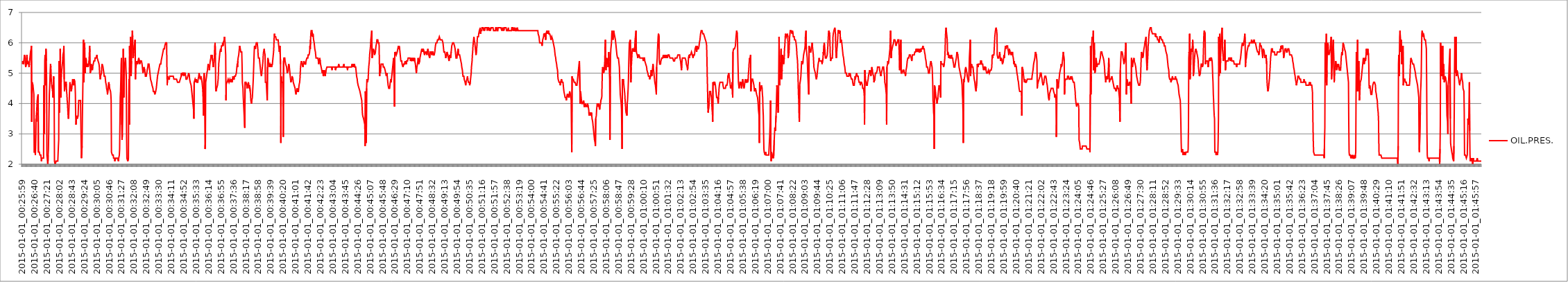
| Category | OIL.PRES. |
|---|---|
| 2015-01-01_00:25:59 | 5.3 |
| 2015-01-01_00:26:00 | 5.4 |
| 2015-01-01_00:26:01 | 5.4 |
| 2015-01-01_00:26:02 | 5.4 |
| 2015-01-01_00:26:03 | 5.3 |
| 2015-01-01_00:26:03 | 5.4 |
| 2015-01-01_00:26:05 | 5.5 |
| 2015-01-01_00:26:06 | 5.6 |
| 2015-01-01_00:26:07 | 5.6 |
| 2015-01-01_00:26:08 | 5.5 |
| 2015-01-01_00:26:09 | 5.3 |
| 2015-01-01_00:26:10 | 5.2 |
| 2015-01-01_00:26:11 | 5.2 |
| 2015-01-01_00:26:12 | 5.3 |
| 2015-01-01_00:26:13 | 5.5 |
| 2015-01-01_00:26:14 | 5.6 |
| 2015-01-01_00:26:15 | 5.5 |
| 2015-01-01_00:26:16 | 5.3 |
| 2015-01-01_00:26:17 | 5.4 |
| 2015-01-01_00:26:18 | 5.4 |
| 2015-01-01_00:26:19 | 5.4 |
| 2015-01-01_00:26:20 | 5.3 |
| 2015-01-01_00:26:21 | 5.2 |
| 2015-01-01_00:26:22 | 5.3 |
| 2015-01-01_00:26:23 | 5.4 |
| 2015-01-01_00:26:24 | 5.5 |
| 2015-01-01_00:26:25 | 5.6 |
| 2015-01-01_00:26:26 | 5.7 |
| 2015-01-01_00:26:27 | 5.7 |
| 2015-01-01_00:26:28 | 5.8 |
| 2015-01-01_00:26:29 | 5.9 |
| 2015-01-01_00:26:30 | 3.4 |
| 2015-01-01_00:26:31 | 4.7 |
| 2015-01-01_00:26:32 | 4.7 |
| 2015-01-01_00:26:33 | 4.7 |
| 2015-01-01_00:26:34 | 4.6 |
| 2015-01-01_00:26:35 | 4.5 |
| 2015-01-01_00:26:36 | 4.4 |
| 2015-01-01_00:26:37 | 4.3 |
| 2015-01-01_00:26:38 | 2.4 |
| 2015-01-01_00:26:39 | 2.4 |
| 2015-01-01_00:26:40 | 2.4 |
| 2015-01-01_00:26:41 | 2.4 |
| 2015-01-01_00:26:42 | 2.3 |
| 2015-01-01_00:26:43 | 2.3 |
| 2015-01-01_00:26:44 | 3.5 |
| 2015-01-01_00:26:45 | 3.4 |
| 2015-01-01_00:26:46 | 3.7 |
| 2015-01-01_00:26:47 | 3.9 |
| 2015-01-01_00:26:48 | 4.1 |
| 2015-01-01_00:26:49 | 4.2 |
| 2015-01-01_00:26:50 | 4.2 |
| 2015-01-01_00:26:51 | 4.3 |
| 2015-01-01_00:26:52 | 2.4 |
| 2015-01-01_00:26:53 | 2.4 |
| 2015-01-01_00:26:54 | 2.4 |
| 2015-01-01_00:26:55 | 2.4 |
| 2015-01-01_00:26:56 | 2.4 |
| 2015-01-01_00:26:57 | 2.3 |
| 2015-01-01_00:26:58 | 2.3 |
| 2015-01-01_00:26:59 | 2.3 |
| 2015-01-01_00:27:00 | 2.3 |
| 2015-01-01_00:27:01 | 2.2 |
| 2015-01-01_00:27:02 | 2.1 |
| 2015-01-01_00:27:03 | 2.2 |
| 2015-01-01_00:27:04 | 2.2 |
| 2015-01-01_00:27:05 | 2.2 |
| 2015-01-01_00:27:06 | 2.2 |
| 2015-01-01_00:27:07 | 2.2 |
| 2015-01-01_00:27:08 | 2.2 |
| 2015-01-01_00:27:09 | 2.2 |
| 2015-01-01_00:27:10 | 4.6 |
| 2015-01-01_00:27:11 | 3 |
| 2015-01-01_00:27:12 | 3.8 |
| 2015-01-01_00:27:13 | 5.4 |
| 2015-01-01_00:27:14 | 5.6 |
| 2015-01-01_00:27:15 | 4.6 |
| 2015-01-01_00:27:16 | 5.5 |
| 2015-01-01_00:27:17 | 5.8 |
| 2015-01-01_00:27:18 | 5.4 |
| 2015-01-01_00:27:19 | 4.8 |
| 2015-01-01_00:27:20 | 2.3 |
| 2015-01-01_00:27:21 | 2.2 |
| 2015-01-01_00:27:22 | 2.1 |
| 2015-01-01_00:27:23 | 1.9 |
| 2015-01-01_00:27:24 | 2.3 |
| 2015-01-01_00:27:25 | 2.5 |
| 2015-01-01_00:27:26 | 3 |
| 2015-01-01_00:27:27 | 3.7 |
| 2015-01-01_00:27:28 | 4.3 |
| 2015-01-01_00:27:29 | 4.5 |
| 2015-01-01_00:27:30 | 4.8 |
| 2015-01-01_00:27:31 | 5.1 |
| 2015-01-01_00:27:32 | 5.3 |
| 2015-01-01_00:27:33 | 5.2 |
| 2015-01-01_00:27:34 | 4.9 |
| 2015-01-01_00:27:35 | 4.7 |
| 2015-01-01_00:27:36 | 4.6 |
| 2015-01-01_00:27:37 | 4.5 |
| 2015-01-01_00:27:38 | 4.6 |
| 2015-01-01_00:27:39 | 4.4 |
| 2015-01-01_00:27:40 | 4.2 |
| 2015-01-01_00:27:41 | 4.5 |
| 2015-01-01_00:27:42 | 4.9 |
| 2015-01-01_00:27:43 | 4.8 |
| 2015-01-01_00:27:44 | 4.1 |
| 2015-01-01_00:27:45 | 2.1 |
| 2015-01-01_00:27:46 | 2.1 |
| 2015-01-01_00:27:47 | 2 |
| 2015-01-01_00:27:48 | 2 |
| 2015-01-01_00:27:49 | 2 |
| 2015-01-01_00:27:50 | 2.1 |
| 2015-01-01_00:27:51 | 2.1 |
| 2015-01-01_00:27:52 | 2.1 |
| 2015-01-01_00:27:53 | 2.1 |
| 2015-01-01_00:27:54 | 2.1 |
| 2015-01-01_00:27:55 | 2.1 |
| 2015-01-01_00:27:56 | 2.1 |
| 2015-01-01_00:27:57 | 2.1 |
| 2015-01-01_00:27:58 | 2.6 |
| 2015-01-01_00:27:59 | 2.8 |
| 2015-01-01_00:28:00 | 5.4 |
| 2015-01-01_00:28:01 | 3.7 |
| 2015-01-01_00:28:02 | 4.4 |
| 2015-01-01_00:28:03 | 4.9 |
| 2015-01-01_00:28:04 | 5.8 |
| 2015-01-01_00:28:05 | 4.8 |
| 2015-01-01_00:28:06 | 4.2 |
| 2015-01-01_00:28:07 | 4.7 |
| 2015-01-01_00:28:08 | 5 |
| 2015-01-01_00:28:09 | 5.1 |
| 2015-01-01_00:28:10 | 5.2 |
| 2015-01-01_00:28:11 | 5.3 |
| 2015-01-01_00:28:12 | 5.4 |
| 2015-01-01_00:28:13 | 5.6 |
| 2015-01-01_00:28:14 | 5.6 |
| 2015-01-01_00:28:15 | 5.7 |
| 2015-01-01_00:28:16 | 5.9 |
| 2015-01-01_00:28:17 | 4.8 |
| 2015-01-01_00:28:18 | 4.4 |
| 2015-01-01_00:28:19 | 4.5 |
| 2015-01-01_00:28:20 | 4.6 |
| 2015-01-01_00:28:21 | 4.7 |
| 2015-01-01_00:28:22 | 4.7 |
| 2015-01-01_00:28:23 | 4.7 |
| 2015-01-01_00:28:24 | 4.7 |
| 2015-01-01_00:28:25 | 4.4 |
| 2015-01-01_00:28:26 | 4.3 |
| 2015-01-01_00:28:27 | 4.1 |
| 2015-01-01_00:28:28 | 4 |
| 2015-01-01_00:28:29 | 3.8 |
| 2015-01-01_00:28:30 | 3.6 |
| 2015-01-01_00:28:31 | 3.5 |
| 2015-01-01_00:28:32 | 3.6 |
| 2015-01-01_00:28:33 | 3.9 |
| 2015-01-01_00:28:34 | 4.2 |
| 2015-01-01_00:28:35 | 4.5 |
| 2015-01-01_00:28:36 | 4.7 |
| 2015-01-01_00:28:37 | 4.7 |
| 2015-01-01_00:28:38 | 4.7 |
| 2015-01-01_00:28:39 | 4.5 |
| 2015-01-01_00:28:40 | 4.4 |
| 2015-01-01_00:28:41 | 4.4 |
| 2015-01-01_00:28:42 | 4.5 |
| 2015-01-01_00:28:43 | 4.6 |
| 2015-01-01_00:28:44 | 4.7 |
| 2015-01-01_00:28:45 | 4.8 |
| 2015-01-01_00:28:46 | 4.8 |
| 2015-01-01_00:28:47 | 4.7 |
| 2015-01-01_00:28:48 | 4.6 |
| 2015-01-01_00:28:49 | 4.7 |
| 2015-01-01_00:28:50 | 4.8 |
| 2015-01-01_00:28:51 | 4.8 |
| 2015-01-01_00:28:52 | 4.7 |
| 2015-01-01_00:28:53 | 4.6 |
| 2015-01-01_00:28:54 | 4.3 |
| 2015-01-01_00:28:55 | 3.6 |
| 2015-01-01_00:28:56 | 3.3 |
| 2015-01-01_00:28:57 | 3.3 |
| 2015-01-01_00:28:58 | 3.6 |
| 2015-01-01_00:28:59 | 3.6 |
| 2015-01-01_00:29:00 | 3.5 |
| 2015-01-01_00:29:01 | 3.5 |
| 2015-01-01_00:29:02 | 3.5 |
| 2015-01-01_00:29:03 | 3.6 |
| 2015-01-01_00:29:04 | 3.9 |
| 2015-01-01_00:29:05 | 4.1 |
| 2015-01-01_00:29:06 | 4.1 |
| 2015-01-01_00:29:07 | 4.1 |
| 2015-01-01_00:29:08 | 4.1 |
| 2015-01-01_00:29:09 | 4.1 |
| 2015-01-01_00:29:10 | 4.1 |
| 2015-01-01_00:29:11 | 4.1 |
| 2015-01-01_00:29:12 | 4.1 |
| 2015-01-01_00:29:13 | 2.7 |
| 2015-01-01_00:29:14 | 2.2 |
| 2015-01-01_00:29:15 | 2.2 |
| 2015-01-01_00:29:16 | 2.6 |
| 2015-01-01_00:29:17 | 3.5 |
| 2015-01-01_00:29:18 | 4.1 |
| 2015-01-01_00:29:19 | 4.8 |
| 2015-01-01_00:29:20 | 6 |
| 2015-01-01_00:29:21 | 6.1 |
| 2015-01-01_00:29:22 | 4.7 |
| 2015-01-01_00:29:23 | 5.3 |
| 2015-01-01_00:29:24 | 6 |
| 2015-01-01_00:29:25 | 5.8 |
| 2015-01-01_00:29:26 | 5 |
| 2015-01-01_00:29:27 | 5.2 |
| 2015-01-01_00:29:28 | 5.4 |
| 2015-01-01_00:29:29 | 5.5 |
| 2015-01-01_00:29:30 | 5.4 |
| 2015-01-01_00:29:31 | 5.3 |
| 2015-01-01_00:29:32 | 5.2 |
| 2015-01-01_00:29:33 | 5.3 |
| 2015-01-01_00:29:34 | 5.3 |
| 2015-01-01_00:29:35 | 5.3 |
| 2015-01-01_00:29:36 | 5.2 |
| 2015-01-01_00:29:37 | 5.2 |
| 2015-01-01_00:29:38 | 5.2 |
| 2015-01-01_00:29:39 | 5.4 |
| 2015-01-01_00:29:40 | 5.6 |
| 2015-01-01_00:29:41 | 5.9 |
| 2015-01-01_00:29:42 | 5.7 |
| 2015-01-01_00:29:43 | 5 |
| 2015-01-01_00:29:44 | 5 |
| 2015-01-01_00:29:45 | 5.1 |
| 2015-01-01_00:29:46 | 5.3 |
| 2015-01-01_00:29:47 | 5.3 |
| 2015-01-01_00:29:48 | 5.2 |
| 2015-01-01_00:29:49 | 5.2 |
| 2015-01-01_00:29:50 | 5.1 |
| 2015-01-01_00:29:51 | 5.2 |
| 2015-01-01_00:29:52 | 5.2 |
| 2015-01-01_00:29:53 | 5.3 |
| 2015-01-01_00:29:54 | 5.3 |
| 2015-01-01_00:29:55 | 5.4 |
| 2015-01-01_00:29:56 | 5.4 |
| 2015-01-01_00:29:57 | 5.4 |
| 2015-01-01_00:29:58 | 5.4 |
| 2015-01-01_00:29:59 | 5.5 |
| 2015-01-01_00:30:00 | 5.5 |
| 2015-01-01_00:30:01 | 5.5 |
| 2015-01-01_00:30:02 | 5.5 |
| 2015-01-01_00:30:03 | 5.5 |
| 2015-01-01_00:30:04 | 5.5 |
| 2015-01-01_00:30:05 | 5.6 |
| 2015-01-01_00:30:06 | 5.5 |
| 2015-01-01_00:30:07 | 5.5 |
| 2015-01-01_00:30:08 | 5.5 |
| 2015-01-01_00:30:09 | 5.4 |
| 2015-01-01_00:30:10 | 5.4 |
| 2015-01-01_00:30:11 | 5.4 |
| 2015-01-01_00:30:12 | 5.3 |
| 2015-01-01_00:30:13 | 5.2 |
| 2015-01-01_00:30:14 | 5 |
| 2015-01-01_00:30:15 | 4.9 |
| 2015-01-01_00:30:16 | 4.8 |
| 2015-01-01_00:30:17 | 4.9 |
| 2015-01-01_00:30:18 | 4.9 |
| 2015-01-01_00:30:19 | 4.9 |
| 2015-01-01_00:30:20 | 5 |
| 2015-01-01_00:30:21 | 5.2 |
| 2015-01-01_00:30:22 | 5.3 |
| 2015-01-01_00:30:23 | 5.3 |
| 2015-01-01_00:30:24 | 5.3 |
| 2015-01-01_00:30:25 | 5.2 |
| 2015-01-01_00:30:26 | 5.2 |
| 2015-01-01_00:30:27 | 5.2 |
| 2015-01-01_00:30:28 | 5 |
| 2015-01-01_00:30:29 | 4.9 |
| 2015-01-01_00:30:30 | 4.9 |
| 2015-01-01_00:30:31 | 4.9 |
| 2015-01-01_00:30:32 | 4.9 |
| 2015-01-01_00:30:33 | 4.8 |
| 2015-01-01_00:30:34 | 4.7 |
| 2015-01-01_00:30:35 | 4.7 |
| 2015-01-01_00:30:36 | 4.6 |
| 2015-01-01_00:30:37 | 4.5 |
| 2015-01-01_00:30:38 | 4.5 |
| 2015-01-01_00:30:39 | 4.4 |
| 2015-01-01_00:30:40 | 4.3 |
| 2015-01-01_00:30:41 | 4.3 |
| 2015-01-01_00:30:42 | 4.5 |
| 2015-01-01_00:30:43 | 4.6 |
| 2015-01-01_00:30:44 | 4.7 |
| 2015-01-01_00:30:45 | 4.7 |
| 2015-01-01_00:30:46 | 4.6 |
| 2015-01-01_00:30:47 | 4.5 |
| 2015-01-01_00:30:48 | 4.5 |
| 2015-01-01_00:30:49 | 4.5 |
| 2015-01-01_00:30:50 | 4.4 |
| 2015-01-01_00:30:51 | 4.3 |
| 2015-01-01_00:30:52 | 4.1 |
| 2015-01-01_00:30:53 | 2.4 |
| 2015-01-01_00:30:54 | 2.4 |
| 2015-01-01_00:30:55 | 2.4 |
| 2015-01-01_00:30:56 | 2.3 |
| 2015-01-01_00:30:57 | 2.3 |
| 2015-01-01_00:30:58 | 2.3 |
| 2015-01-01_00:30:59 | 2.3 |
| 2015-01-01_00:31:00 | 2.2 |
| 2015-01-01_00:31:01 | 2.2 |
| 2015-01-01_00:31:02 | 2.2 |
| 2015-01-01_00:31:03 | 2.2 |
| 2015-01-01_00:31:04 | 2.1 |
| 2015-01-01_00:31:05 | 2.1 |
| 2015-01-01_00:31:06 | 2.1 |
| 2015-01-01_00:31:07 | 2.2 |
| 2015-01-01_00:31:08 | 2.2 |
| 2015-01-01_00:31:09 | 2.2 |
| 2015-01-01_00:31:10 | 2.2 |
| 2015-01-01_00:31:11 | 2.2 |
| 2015-01-01_00:31:12 | 2.2 |
| 2015-01-01_00:31:13 | 2.2 |
| 2015-01-01_00:31:14 | 2.2 |
| 2015-01-01_00:31:15 | 2.2 |
| 2015-01-01_00:31:16 | 2.1 |
| 2015-01-01_00:31:17 | 2.2 |
| 2015-01-01_00:31:18 | 2.2 |
| 2015-01-01_00:31:19 | 2.3 |
| 2015-01-01_00:31:20 | 2.5 |
| 2015-01-01_00:31:21 | 3.4 |
| 2015-01-01_00:31:22 | 4.2 |
| 2015-01-01_00:31:23 | 4.4 |
| 2015-01-01_00:31:24 | 4.8 |
| 2015-01-01_00:31:25 | 5.3 |
| 2015-01-01_00:31:26 | 5.5 |
| 2015-01-01_00:31:27 | 3.3 |
| 2015-01-01_00:31:28 | 2.8 |
| 2015-01-01_00:31:29 | 3 |
| 2015-01-01_00:31:30 | 3.5 |
| 2015-01-01_00:31:31 | 4.7 |
| 2015-01-01_00:31:32 | 5.8 |
| 2015-01-01_00:31:33 | 4.7 |
| 2015-01-01_00:31:34 | 4.2 |
| 2015-01-01_00:31:35 | 4.7 |
| 2015-01-01_00:31:36 | 5.1 |
| 2015-01-01_00:31:37 | 5.3 |
| 2015-01-01_00:31:38 | 5.4 |
| 2015-01-01_00:31:39 | 5.5 |
| 2015-01-01_00:31:40 | 5.4 |
| 2015-01-01_00:31:41 | 5.1 |
| 2015-01-01_00:31:42 | 4.9 |
| 2015-01-01_00:31:43 | 2.9 |
| 2015-01-01_00:31:44 | 2.2 |
| 2015-01-01_00:31:45 | 2.2 |
| 2015-01-01_00:31:46 | 2.2 |
| 2015-01-01_00:31:47 | 2.1 |
| 2015-01-01_00:31:48 | 2.1 |
| 2015-01-01_00:31:49 | 2.2 |
| 2015-01-01_00:31:50 | 4.1 |
| 2015-01-01_00:31:51 | 4.8 |
| 2015-01-01_00:31:52 | 3.3 |
| 2015-01-01_00:31:53 | 5.9 |
| 2015-01-01_00:31:54 | 5 |
| 2015-01-01_00:31:55 | 5.1 |
| 2015-01-01_00:31:56 | 6.2 |
| 2015-01-01_00:31:57 | 5.3 |
| 2015-01-01_00:31:58 | 4.9 |
| 2015-01-01_00:31:59 | 5.4 |
| 2015-01-01_00:32:00 | 5.9 |
| 2015-01-01_00:32:01 | 6.2 |
| 2015-01-01_00:32:02 | 6.4 |
| 2015-01-01_00:32:03 | 6.2 |
| 2015-01-01_00:32:04 | 5.5 |
| 2015-01-01_00:32:05 | 5.5 |
| 2015-01-01_00:32:06 | 5.6 |
| 2015-01-01_00:32:07 | 5.8 |
| 2015-01-01_00:32:08 | 5.9 |
| 2015-01-01_00:32:09 | 5.9 |
| 2015-01-01_00:32:10 | 6 |
| 2015-01-01_00:32:11 | 6.1 |
| 2015-01-01_00:32:12 | 4.8 |
| 2015-01-01_00:32:13 | 5.1 |
| 2015-01-01_00:32:14 | 5.2 |
| 2015-01-01_00:32:15 | 5.3 |
| 2015-01-01_00:32:16 | 5.4 |
| 2015-01-01_00:32:17 | 5.4 |
| 2015-01-01_00:32:18 | 5.4 |
| 2015-01-01_00:32:19 | 5.3 |
| 2015-01-01_00:32:20 | 5.3 |
| 2015-01-01_00:32:21 | 5.4 |
| 2015-01-01_00:32:22 | 5.4 |
| 2015-01-01_00:32:23 | 5.5 |
| 2015-01-01_00:32:24 | 5.5 |
| 2015-01-01_00:32:25 | 5.4 |
| 2015-01-01_00:32:26 | 5.3 |
| 2015-01-01_00:32:27 | 5.3 |
| 2015-01-01_00:32:28 | 5.3 |
| 2015-01-01_00:32:29 | 5.4 |
| 2015-01-01_00:32:30 | 5.4 |
| 2015-01-01_00:32:31 | 5.4 |
| 2015-01-01_00:32:32 | 5.4 |
| 2015-01-01_00:32:33 | 5.4 |
| 2015-01-01_00:32:34 | 5.3 |
| 2015-01-01_00:32:35 | 5.2 |
| 2015-01-01_00:32:36 | 5.1 |
| 2015-01-01_00:32:37 | 5 |
| 2015-01-01_00:32:38 | 5 |
| 2015-01-01_00:32:39 | 5.1 |
| 2015-01-01_00:32:40 | 5.2 |
| 2015-01-01_00:32:41 | 5.2 |
| 2015-01-01_00:32:42 | 5.2 |
| 2015-01-01_00:32:43 | 5.1 |
| 2015-01-01_00:32:44 | 5 |
| 2015-01-01_00:32:45 | 4.9 |
| 2015-01-01_00:32:46 | 4.9 |
| 2015-01-01_00:32:47 | 4.9 |
| 2015-01-01_00:32:48 | 4.9 |
| 2015-01-01_00:32:49 | 4.9 |
| 2015-01-01_00:32:50 | 4.9 |
| 2015-01-01_00:32:51 | 5.1 |
| 2015-01-01_00:32:52 | 5.1 |
| 2015-01-01_00:32:53 | 5.2 |
| 2015-01-01_00:32:54 | 5.3 |
| 2015-01-01_00:32:55 | 5.3 |
| 2015-01-01_00:32:56 | 5.3 |
| 2015-01-01_00:32:57 | 5.3 |
| 2015-01-01_00:32:58 | 5.2 |
| 2015-01-01_00:32:59 | 5.1 |
| 2015-01-01_00:33:00 | 5.1 |
| 2015-01-01_00:33:01 | 4.9 |
| 2015-01-01_00:33:02 | 4.8 |
| 2015-01-01_00:33:03 | 4.8 |
| 2015-01-01_00:33:04 | 4.8 |
| 2015-01-01_00:33:05 | 4.7 |
| 2015-01-01_00:33:06 | 4.7 |
| 2015-01-01_00:33:07 | 4.6 |
| 2015-01-01_00:33:08 | 4.6 |
| 2015-01-01_00:33:09 | 4.6 |
| 2015-01-01_00:33:10 | 4.5 |
| 2015-01-01_00:33:11 | 4.4 |
| 2015-01-01_00:33:12 | 4.4 |
| 2015-01-01_00:33:13 | 4.4 |
| 2015-01-01_00:33:14 | 4.4 |
| 2015-01-01_00:33:15 | 4.4 |
| 2015-01-01_00:33:16 | 4.3 |
| 2015-01-01_00:33:17 | 4.3 |
| 2015-01-01_00:33:18 | 4.3 |
| 2015-01-01_00:33:19 | 4.4 |
| 2015-01-01_00:33:20 | 4.4 |
| 2015-01-01_00:33:21 | 4.5 |
| 2015-01-01_00:33:22 | 4.6 |
| 2015-01-01_00:33:23 | 4.7 |
| 2015-01-01_00:33:24 | 4.8 |
| 2015-01-01_00:33:25 | 4.9 |
| 2015-01-01_00:33:26 | 4.9 |
| 2015-01-01_00:33:27 | 5 |
| 2015-01-01_00:33:28 | 5 |
| 2015-01-01_00:33:29 | 5.1 |
| 2015-01-01_00:33:30 | 5.1 |
| 2015-01-01_00:33:31 | 5.2 |
| 2015-01-01_00:33:32 | 5.2 |
| 2015-01-01_00:33:33 | 5.3 |
| 2015-01-01_00:33:34 | 5.3 |
| 2015-01-01_00:33:35 | 5.3 |
| 2015-01-01_00:33:36 | 5.3 |
| 2015-01-01_00:33:37 | 5.4 |
| 2015-01-01_00:33:38 | 5.4 |
| 2015-01-01_00:33:39 | 5.5 |
| 2015-01-01_00:33:40 | 5.5 |
| 2015-01-01_00:33:41 | 5.6 |
| 2015-01-01_00:33:42 | 5.6 |
| 2015-01-01_00:33:43 | 5.7 |
| 2015-01-01_00:33:44 | 5.7 |
| 2015-01-01_00:33:45 | 5.8 |
| 2015-01-01_00:33:46 | 5.8 |
| 2015-01-01_00:33:47 | 5.8 |
| 2015-01-01_00:33:48 | 5.8 |
| 2015-01-01_00:33:49 | 5.9 |
| 2015-01-01_00:33:50 | 5.9 |
| 2015-01-01_00:33:51 | 5.9 |
| 2015-01-01_00:33:52 | 6 |
| 2015-01-01_00:33:53 | 6 |
| 2015-01-01_00:33:54 | 6 |
| 2015-01-01_00:33:55 | 6 |
| 2015-01-01_00:33:56 | 6 |
| 2015-01-01_00:33:57 | 4.6 |
| 2015-01-01_00:33:58 | 4.9 |
| 2015-01-01_00:33:59 | 4.9 |
| 2015-01-01_00:34:00 | 4.9 |
| 2015-01-01_00:34:01 | 4.8 |
| 2015-01-01_00:34:02 | 4.8 |
| 2015-01-01_00:34:03 | 4.8 |
| 2015-01-01_00:34:04 | 4.8 |
| 2015-01-01_00:34:05 | 4.9 |
| 2015-01-01_00:34:06 | 4.9 |
| 2015-01-01_00:34:07 | 4.9 |
| 2015-01-01_00:34:08 | 4.9 |
| 2015-01-01_00:34:09 | 4.9 |
| 2015-01-01_00:34:10 | 4.9 |
| 2015-01-01_00:34:11 | 4.9 |
| 2015-01-01_00:34:12 | 4.9 |
| 2015-01-01_00:34:13 | 4.9 |
| 2015-01-01_00:34:14 | 4.9 |
| 2015-01-01_00:34:15 | 4.9 |
| 2015-01-01_00:34:16 | 4.9 |
| 2015-01-01_00:34:17 | 4.9 |
| 2015-01-01_00:34:18 | 4.9 |
| 2015-01-01_00:34:19 | 4.8 |
| 2015-01-01_00:34:20 | 4.8 |
| 2015-01-01_00:34:21 | 4.8 |
| 2015-01-01_00:34:22 | 4.8 |
| 2015-01-01_00:34:23 | 4.8 |
| 2015-01-01_00:34:24 | 4.8 |
| 2015-01-01_00:34:25 | 4.8 |
| 2015-01-01_00:34:26 | 4.8 |
| 2015-01-01_00:34:27 | 4.8 |
| 2015-01-01_00:34:28 | 4.8 |
| 2015-01-01_00:34:29 | 4.8 |
| 2015-01-01_00:34:30 | 4.8 |
| 2015-01-01_00:34:31 | 4.7 |
| 2015-01-01_00:34:32 | 4.7 |
| 2015-01-01_00:34:33 | 4.7 |
| 2015-01-01_00:34:34 | 4.7 |
| 2015-01-01_00:34:35 | 4.7 |
| 2015-01-01_00:34:36 | 4.7 |
| 2015-01-01_00:34:37 | 4.7 |
| 2015-01-01_00:34:38 | 4.7 |
| 2015-01-01_00:34:39 | 4.7 |
| 2015-01-01_00:34:40 | 4.8 |
| 2015-01-01_00:34:41 | 4.8 |
| 2015-01-01_00:34:42 | 4.8 |
| 2015-01-01_00:34:43 | 4.9 |
| 2015-01-01_00:34:44 | 5 |
| 2015-01-01_00:34:45 | 4.9 |
| 2015-01-01_00:34:46 | 4.9 |
| 2015-01-01_00:34:47 | 5 |
| 2015-01-01_00:34:48 | 5 |
| 2015-01-01_00:34:49 | 5 |
| 2015-01-01_00:34:50 | 5 |
| 2015-01-01_00:34:51 | 5 |
| 2015-01-01_00:34:52 | 4.9 |
| 2015-01-01_00:34:53 | 5 |
| 2015-01-01_00:34:54 | 5 |
| 2015-01-01_00:34:55 | 5 |
| 2015-01-01_00:34:56 | 5 |
| 2015-01-01_00:34:57 | 5 |
| 2015-01-01_00:34:58 | 4.9 |
| 2015-01-01_00:34:59 | 4.8 |
| 2015-01-01_00:35:00 | 4.8 |
| 2015-01-01_00:35:01 | 4.8 |
| 2015-01-01_00:35:02 | 4.8 |
| 2015-01-01_00:35:03 | 4.8 |
| 2015-01-01_00:35:04 | 4.8 |
| 2015-01-01_00:35:05 | 4.9 |
| 2015-01-01_00:35:06 | 4.9 |
| 2015-01-01_00:35:07 | 4.9 |
| 2015-01-01_00:35:08 | 5 |
| 2015-01-01_00:35:09 | 5 |
| 2015-01-01_00:35:10 | 4.9 |
| 2015-01-01_00:35:11 | 4.8 |
| 2015-01-01_00:35:12 | 4.8 |
| 2015-01-01_00:35:13 | 4.7 |
| 2015-01-01_00:35:14 | 4.7 |
| 2015-01-01_00:35:15 | 4.7 |
| 2015-01-01_00:35:16 | 4.6 |
| 2015-01-01_00:35:17 | 4.5 |
| 2015-01-01_00:35:18 | 4.4 |
| 2015-01-01_00:35:19 | 4.3 |
| 2015-01-01_00:35:20 | 4.3 |
| 2015-01-01_00:35:21 | 4.1 |
| 2015-01-01_00:35:22 | 4 |
| 2015-01-01_00:35:23 | 3.9 |
| 2015-01-01_00:35:24 | 3.8 |
| 2015-01-01_00:35:25 | 3.5 |
| 2015-01-01_00:35:26 | 4.7 |
| 2015-01-01_00:35:27 | 4.7 |
| 2015-01-01_00:35:28 | 4.7 |
| 2015-01-01_00:35:29 | 4.8 |
| 2015-01-01_00:35:30 | 4.8 |
| 2015-01-01_00:35:31 | 4.8 |
| 2015-01-01_00:35:32 | 4.7 |
| 2015-01-01_00:35:33 | 4.8 |
| 2015-01-01_00:35:34 | 4.8 |
| 2015-01-01_00:35:35 | 4.7 |
| 2015-01-01_00:35:36 | 4.7 |
| 2015-01-01_00:35:37 | 4.7 |
| 2015-01-01_00:35:38 | 4.7 |
| 2015-01-01_00:35:39 | 4.8 |
| 2015-01-01_00:35:40 | 4.8 |
| 2015-01-01_00:35:41 | 4.9 |
| 2015-01-01_00:35:42 | 5 |
| 2015-01-01_00:35:43 | 5 |
| 2015-01-01_00:35:44 | 4.9 |
| 2015-01-01_00:35:45 | 4.9 |
| 2015-01-01_00:35:46 | 4.8 |
| 2015-01-01_00:35:47 | 4.8 |
| 2015-01-01_00:35:48 | 4.9 |
| 2015-01-01_00:35:49 | 4.9 |
| 2015-01-01_00:35:50 | 4.8 |
| 2015-01-01_00:35:51 | 4.8 |
| 2015-01-01_00:35:52 | 4.7 |
| 2015-01-01_00:35:53 | 4.6 |
| 2015-01-01_00:35:54 | 4.5 |
| 2015-01-01_00:35:55 | 4.3 |
| 2015-01-01_00:35:56 | 4.3 |
| 2015-01-01_00:35:57 | 3.6 |
| 2015-01-01_00:35:58 | 4.9 |
| 2015-01-01_00:35:59 | 5 |
| 2015-01-01_00:36:00 | 4.7 |
| 2015-01-01_00:36:01 | 3.8 |
| 2015-01-01_00:36:02 | 2.5 |
| 2015-01-01_00:36:03 | 2.7 |
| 2015-01-01_00:36:04 | 4.7 |
| 2015-01-01_00:36:05 | 4.7 |
| 2015-01-01_00:36:06 | 4.7 |
| 2015-01-01_00:36:07 | 4.9 |
| 2015-01-01_00:36:08 | 5 |
| 2015-01-01_00:36:09 | 5 |
| 2015-01-01_00:36:10 | 5.1 |
| 2015-01-01_00:36:11 | 5.2 |
| 2015-01-01_00:36:12 | 5.3 |
| 2015-01-01_00:36:13 | 5.3 |
| 2015-01-01_00:36:14 | 5.3 |
| 2015-01-01_00:36:15 | 5.2 |
| 2015-01-01_00:36:16 | 5.1 |
| 2015-01-01_00:36:17 | 5.2 |
| 2015-01-01_00:36:18 | 5.3 |
| 2015-01-01_00:36:19 | 5.4 |
| 2015-01-01_00:36:20 | 5.4 |
| 2015-01-01_00:36:21 | 5.5 |
| 2015-01-01_00:36:22 | 5.6 |
| 2015-01-01_00:36:23 | 5.5 |
| 2015-01-01_00:36:24 | 5.5 |
| 2015-01-01_00:36:25 | 5.6 |
| 2015-01-01_00:36:26 | 5.6 |
| 2015-01-01_00:36:27 | 5.4 |
| 2015-01-01_00:36:28 | 5.3 |
| 2015-01-01_00:36:29 | 5.2 |
| 2015-01-01_00:36:30 | 5.3 |
| 2015-01-01_00:36:31 | 5.3 |
| 2015-01-01_00:36:32 | 5.4 |
| 2015-01-01_00:36:33 | 5.6 |
| 2015-01-01_00:36:34 | 5.9 |
| 2015-01-01_00:36:35 | 6 |
| 2015-01-01_00:36:36 | 5.6 |
| 2015-01-01_00:36:37 | 4.5 |
| 2015-01-01_00:36:38 | 4.4 |
| 2015-01-01_00:36:39 | 4.4 |
| 2015-01-01_00:36:40 | 4.5 |
| 2015-01-01_00:36:41 | 4.5 |
| 2015-01-01_00:36:42 | 4.5 |
| 2015-01-01_00:36:43 | 4.6 |
| 2015-01-01_00:36:44 | 4.7 |
| 2015-01-01_00:36:45 | 4.8 |
| 2015-01-01_00:36:46 | 5 |
| 2015-01-01_00:36:47 | 5.3 |
| 2015-01-01_00:36:48 | 5.4 |
| 2015-01-01_00:36:49 | 5.5 |
| 2015-01-01_00:36:50 | 5.5 |
| 2015-01-01_00:36:51 | 5.7 |
| 2015-01-01_00:36:52 | 5.7 |
| 2015-01-01_00:36:53 | 5.8 |
| 2015-01-01_00:36:54 | 5.7 |
| 2015-01-01_00:36:55 | 5.8 |
| 2015-01-01_00:36:56 | 5.9 |
| 2015-01-01_00:36:57 | 5.9 |
| 2015-01-01_00:36:58 | 5.9 |
| 2015-01-01_00:36:59 | 5.9 |
| 2015-01-01_00:37:00 | 6 |
| 2015-01-01_00:37:01 | 5.9 |
| 2015-01-01_00:37:02 | 6 |
| 2015-01-01_00:37:03 | 6 |
| 2015-01-01_00:37:04 | 6 |
| 2015-01-01_00:37:05 | 6.1 |
| 2015-01-01_00:37:06 | 6.2 |
| 2015-01-01_00:37:07 | 6.1 |
| 2015-01-01_00:37:08 | 6 |
| 2015-01-01_00:37:09 | 6 |
| 2015-01-01_00:37:10 | 5.6 |
| 2015-01-01_00:37:11 | 4.1 |
| 2015-01-01_00:37:12 | 4.7 |
| 2015-01-01_00:37:13 | 4.7 |
| 2015-01-01_00:37:14 | 4.7 |
| 2015-01-01_00:37:15 | 4.7 |
| 2015-01-01_00:37:16 | 4.7 |
| 2015-01-01_00:37:17 | 4.7 |
| 2015-01-01_00:37:18 | 4.8 |
| 2015-01-01_00:37:19 | 4.8 |
| 2015-01-01_00:37:20 | 4.8 |
| 2015-01-01_00:37:21 | 4.7 |
| 2015-01-01_00:37:22 | 4.7 |
| 2015-01-01_00:37:23 | 4.7 |
| 2015-01-01_00:37:24 | 4.8 |
| 2015-01-01_00:37:25 | 4.8 |
| 2015-01-01_00:37:26 | 4.8 |
| 2015-01-01_00:37:27 | 4.7 |
| 2015-01-01_00:37:28 | 4.7 |
| 2015-01-01_00:37:29 | 4.8 |
| 2015-01-01_00:37:30 | 4.8 |
| 2015-01-01_00:37:31 | 4.7 |
| 2015-01-01_00:37:32 | 4.8 |
| 2015-01-01_00:37:33 | 4.8 |
| 2015-01-01_00:37:34 | 4.9 |
| 2015-01-01_00:37:35 | 4.8 |
| 2015-01-01_00:37:36 | 4.8 |
| 2015-01-01_00:37:37 | 4.8 |
| 2015-01-01_00:37:38 | 4.8 |
| 2015-01-01_00:37:39 | 4.9 |
| 2015-01-01_00:37:40 | 4.9 |
| 2015-01-01_00:37:41 | 4.9 |
| 2015-01-01_00:37:42 | 4.9 |
| 2015-01-01_00:37:43 | 4.9 |
| 2015-01-01_00:37:44 | 4.9 |
| 2015-01-01_00:37:45 | 5 |
| 2015-01-01_00:37:46 | 5.1 |
| 2015-01-01_00:37:47 | 5.2 |
| 2015-01-01_00:37:48 | 5.3 |
| 2015-01-01_00:37:49 | 5.2 |
| 2015-01-01_00:37:50 | 5.4 |
| 2015-01-01_00:37:51 | 5.5 |
| 2015-01-01_00:37:52 | 5.5 |
| 2015-01-01_00:37:53 | 5.6 |
| 2015-01-01_00:37:54 | 5.7 |
| 2015-01-01_00:37:55 | 5.8 |
| 2015-01-01_00:37:56 | 5.9 |
| 2015-01-01_00:37:57 | 5.9 |
| 2015-01-01_00:37:58 | 5.8 |
| 2015-01-01_00:37:59 | 5.8 |
| 2015-01-01_00:38:00 | 5.7 |
| 2015-01-01_00:38:01 | 5.7 |
| 2015-01-01_00:38:02 | 5.7 |
| 2015-01-01_00:38:03 | 5.7 |
| 2015-01-01_00:38:04 | 5.3 |
| 2015-01-01_00:38:05 | 4.7 |
| 2015-01-01_00:38:06 | 4.6 |
| 2015-01-01_00:38:07 | 4.5 |
| 2015-01-01_00:38:08 | 4.2 |
| 2015-01-01_00:38:09 | 4 |
| 2015-01-01_00:38:10 | 3.8 |
| 2015-01-01_00:38:11 | 3.6 |
| 2015-01-01_00:38:12 | 3.3 |
| 2015-01-01_00:38:13 | 3.2 |
| 2015-01-01_00:38:14 | 4.7 |
| 2015-01-01_00:38:15 | 4.7 |
| 2015-01-01_00:38:16 | 4.7 |
| 2015-01-01_00:38:17 | 4.7 |
| 2015-01-01_00:38:18 | 4.7 |
| 2015-01-01_00:38:19 | 4.7 |
| 2015-01-01_00:38:20 | 4.6 |
| 2015-01-01_00:38:21 | 4.5 |
| 2015-01-01_00:38:22 | 4.6 |
| 2015-01-01_00:38:23 | 4.6 |
| 2015-01-01_00:38:24 | 4.6 |
| 2015-01-01_00:38:25 | 4.7 |
| 2015-01-01_00:38:26 | 4.6 |
| 2015-01-01_00:38:27 | 4.6 |
| 2015-01-01_00:38:28 | 4.5 |
| 2015-01-01_00:38:29 | 4.6 |
| 2015-01-01_00:38:30 | 4.6 |
| 2015-01-01_00:38:31 | 4.4 |
| 2015-01-01_00:38:32 | 4.3 |
| 2015-01-01_00:38:33 | 4.1 |
| 2015-01-01_00:38:34 | 4.1 |
| 2015-01-01_00:38:35 | 4 |
| 2015-01-01_00:38:36 | 4.1 |
| 2015-01-01_00:38:37 | 4.1 |
| 2015-01-01_00:38:38 | 4.2 |
| 2015-01-01_00:38:39 | 4.4 |
| 2015-01-01_00:38:40 | 4.6 |
| 2015-01-01_00:38:41 | 4.8 |
| 2015-01-01_00:38:42 | 5.1 |
| 2015-01-01_00:38:43 | 5.4 |
| 2015-01-01_00:38:44 | 5.7 |
| 2015-01-01_00:38:45 | 5.9 |
| 2015-01-01_00:38:46 | 5.9 |
| 2015-01-01_00:38:47 | 5.9 |
| 2015-01-01_00:38:48 | 5.8 |
| 2015-01-01_00:38:49 | 5.9 |
| 2015-01-01_00:38:50 | 5.9 |
| 2015-01-01_00:38:51 | 6 |
| 2015-01-01_00:38:52 | 6 |
| 2015-01-01_00:38:53 | 6 |
| 2015-01-01_00:38:54 | 6 |
| 2015-01-01_00:38:55 | 5.9 |
| 2015-01-01_00:38:56 | 5.8 |
| 2015-01-01_00:38:57 | 5.6 |
| 2015-01-01_00:38:58 | 5.5 |
| 2015-01-01_00:38:59 | 5.5 |
| 2015-01-01_00:39:00 | 5.5 |
| 2015-01-01_00:39:01 | 5.5 |
| 2015-01-01_00:39:02 | 5.4 |
| 2015-01-01_00:39:03 | 5.4 |
| 2015-01-01_00:39:04 | 5.2 |
| 2015-01-01_00:39:05 | 5.1 |
| 2015-01-01_00:39:06 | 5 |
| 2015-01-01_00:39:07 | 5 |
| 2015-01-01_00:39:08 | 4.9 |
| 2015-01-01_00:39:09 | 5 |
| 2015-01-01_00:39:10 | 5.1 |
| 2015-01-01_00:39:11 | 5.1 |
| 2015-01-01_00:39:12 | 5.3 |
| 2015-01-01_00:39:13 | 5.4 |
| 2015-01-01_00:39:14 | 5.6 |
| 2015-01-01_00:39:15 | 5.7 |
| 2015-01-01_00:39:16 | 5.7 |
| 2015-01-01_00:39:17 | 5.8 |
| 2015-01-01_00:39:18 | 5.7 |
| 2015-01-01_00:39:19 | 5.7 |
| 2015-01-01_00:39:20 | 5.6 |
| 2015-01-01_00:39:21 | 4.7 |
| 2015-01-01_00:39:22 | 4.7 |
| 2015-01-01_00:39:23 | 4.7 |
| 2015-01-01_00:39:24 | 4.7 |
| 2015-01-01_00:39:25 | 4.7 |
| 2015-01-01_00:39:26 | 4.7 |
| 2015-01-01_00:39:27 | 4.1 |
| 2015-01-01_00:39:28 | 5.2 |
| 2015-01-01_00:39:29 | 5.5 |
| 2015-01-01_00:39:30 | 5.5 |
| 2015-01-01_00:39:31 | 5.4 |
| 2015-01-01_00:39:32 | 5.3 |
| 2015-01-01_00:39:33 | 5.2 |
| 2015-01-01_00:39:34 | 5.2 |
| 2015-01-01_00:39:35 | 5.2 |
| 2015-01-01_00:39:36 | 5.3 |
| 2015-01-01_00:39:37 | 5.3 |
| 2015-01-01_00:39:38 | 5.3 |
| 2015-01-01_00:39:39 | 5.2 |
| 2015-01-01_00:39:40 | 5.3 |
| 2015-01-01_00:39:41 | 5.2 |
| 2015-01-01_00:39:42 | 5.2 |
| 2015-01-01_00:39:43 | 5.2 |
| 2015-01-01_00:39:44 | 5.3 |
| 2015-01-01_00:39:45 | 5.3 |
| 2015-01-01_00:39:46 | 5.5 |
| 2015-01-01_00:39:47 | 5.6 |
| 2015-01-01_00:39:48 | 5.7 |
| 2015-01-01_00:39:49 | 5.9 |
| 2015-01-01_00:39:50 | 6.2 |
| 2015-01-01_00:39:51 | 6.3 |
| 2015-01-01_00:39:52 | 6.2 |
| 2015-01-01_00:39:53 | 6.2 |
| 2015-01-01_00:39:54 | 6.2 |
| 2015-01-01_00:39:55 | 6.2 |
| 2015-01-01_00:39:56 | 6.2 |
| 2015-01-01_00:39:57 | 6.1 |
| 2015-01-01_00:39:58 | 6.1 |
| 2015-01-01_00:39:59 | 6.1 |
| 2015-01-01_00:40:00 | 6.1 |
| 2015-01-01_00:40:01 | 6.1 |
| 2015-01-01_00:40:02 | 6.1 |
| 2015-01-01_00:40:03 | 6.1 |
| 2015-01-01_00:40:04 | 6 |
| 2015-01-01_00:40:05 | 5.9 |
| 2015-01-01_00:40:06 | 5.8 |
| 2015-01-01_00:40:07 | 5.7 |
| 2015-01-01_00:40:08 | 5.7 |
| 2015-01-01_00:40:09 | 5.9 |
| 2015-01-01_00:40:10 | 5.9 |
| 2015-01-01_00:40:11 | 5.3 |
| 2015-01-01_00:40:12 | 2.7 |
| 2015-01-01_00:40:13 | 4.9 |
| 2015-01-01_00:40:14 | 4.8 |
| 2015-01-01_00:40:15 | 4.7 |
| 2015-01-01_00:40:16 | 4.7 |
| 2015-01-01_00:40:17 | 4.7 |
| 2015-01-01_00:40:18 | 4.7 |
| 2015-01-01_00:40:19 | 4.3 |
| 2015-01-01_00:40:20 | 2.9 |
| 2015-01-01_00:40:21 | 5.4 |
| 2015-01-01_00:40:22 | 5.5 |
| 2015-01-01_00:40:23 | 5.5 |
| 2015-01-01_00:40:24 | 5.5 |
| 2015-01-01_00:40:25 | 5.5 |
| 2015-01-01_00:40:26 | 5.4 |
| 2015-01-01_00:40:27 | 5.4 |
| 2015-01-01_00:40:28 | 5.3 |
| 2015-01-01_00:40:29 | 5.3 |
| 2015-01-01_00:40:30 | 5.3 |
| 2015-01-01_00:40:31 | 5.2 |
| 2015-01-01_00:40:32 | 5.1 |
| 2015-01-01_00:40:33 | 5 |
| 2015-01-01_00:40:34 | 5 |
| 2015-01-01_00:40:35 | 5 |
| 2015-01-01_00:40:36 | 5.1 |
| 2015-01-01_00:40:37 | 5.2 |
| 2015-01-01_00:40:38 | 5.3 |
| 2015-01-01_00:40:39 | 5.3 |
| 2015-01-01_00:40:40 | 5.2 |
| 2015-01-01_00:40:41 | 5.1 |
| 2015-01-01_00:40:42 | 5 |
| 2015-01-01_00:40:43 | 4.9 |
| 2015-01-01_00:40:44 | 4.8 |
| 2015-01-01_00:40:45 | 4.7 |
| 2015-01-01_00:40:46 | 4.7 |
| 2015-01-01_00:40:47 | 4.7 |
| 2015-01-01_00:40:48 | 4.8 |
| 2015-01-01_00:40:49 | 4.9 |
| 2015-01-01_00:40:50 | 4.9 |
| 2015-01-01_00:40:51 | 4.9 |
| 2015-01-01_00:40:52 | 4.8 |
| 2015-01-01_00:40:53 | 4.7 |
| 2015-01-01_00:40:54 | 4.7 |
| 2015-01-01_00:40:55 | 4.7 |
| 2015-01-01_00:40:56 | 4.6 |
| 2015-01-01_00:40:57 | 4.6 |
| 2015-01-01_00:40:58 | 4.6 |
| 2015-01-01_00:40:59 | 4.5 |
| 2015-01-01_00:41:00 | 4.4 |
| 2015-01-01_00:41:01 | 4.4 |
| 2015-01-01_00:41:02 | 4.3 |
| 2015-01-01_00:41:03 | 4.4 |
| 2015-01-01_00:41:04 | 4.4 |
| 2015-01-01_00:41:05 | 4.4 |
| 2015-01-01_00:41:06 | 4.5 |
| 2015-01-01_00:41:07 | 4.4 |
| 2015-01-01_00:41:08 | 4.4 |
| 2015-01-01_00:41:09 | 4.4 |
| 2015-01-01_00:41:10 | 4.4 |
| 2015-01-01_00:41:11 | 4.5 |
| 2015-01-01_00:41:12 | 4.6 |
| 2015-01-01_00:41:13 | 4.6 |
| 2015-01-01_00:41:14 | 4.7 |
| 2015-01-01_00:41:15 | 4.8 |
| 2015-01-01_00:41:16 | 5 |
| 2015-01-01_00:41:17 | 5.2 |
| 2015-01-01_00:41:18 | 5.3 |
| 2015-01-01_00:41:19 | 5.3 |
| 2015-01-01_00:41:20 | 5.4 |
| 2015-01-01_00:41:21 | 5.4 |
| 2015-01-01_00:41:22 | 5.3 |
| 2015-01-01_00:41:23 | 5.3 |
| 2015-01-01_00:41:24 | 5.3 |
| 2015-01-01_00:41:25 | 5.2 |
| 2015-01-01_00:41:26 | 5.3 |
| 2015-01-01_00:41:27 | 5.3 |
| 2015-01-01_00:41:28 | 5.4 |
| 2015-01-01_00:41:29 | 5.4 |
| 2015-01-01_00:41:30 | 5.4 |
| 2015-01-01_00:41:31 | 5.3 |
| 2015-01-01_00:41:32 | 5.3 |
| 2015-01-01_00:41:33 | 5.3 |
| 2015-01-01_00:41:34 | 5.3 |
| 2015-01-01_00:41:35 | 5.4 |
| 2015-01-01_00:41:36 | 5.4 |
| 2015-01-01_00:41:37 | 5.4 |
| 2015-01-01_00:41:38 | 5.5 |
| 2015-01-01_00:41:39 | 5.5 |
| 2015-01-01_00:41:40 | 5.5 |
| 2015-01-01_00:41:41 | 5.5 |
| 2015-01-01_00:41:42 | 5.6 |
| 2015-01-01_00:41:43 | 5.6 |
| 2015-01-01_00:41:44 | 5.6 |
| 2015-01-01_00:41:45 | 5.6 |
| 2015-01-01_00:41:46 | 5.6 |
| 2015-01-01_00:41:47 | 5.7 |
| 2015-01-01_00:41:48 | 5.9 |
| 2015-01-01_00:41:49 | 5.8 |
| 2015-01-01_00:41:50 | 6.1 |
| 2015-01-01_00:41:51 | 6.3 |
| 2015-01-01_00:41:52 | 6.4 |
| 2015-01-01_00:41:53 | 6.4 |
| 2015-01-01_00:41:54 | 6.4 |
| 2015-01-01_00:41:55 | 6.4 |
| 2015-01-01_00:41:56 | 6.2 |
| 2015-01-01_00:41:57 | 6.2 |
| 2015-01-01_00:41:58 | 6.3 |
| 2015-01-01_00:41:59 | 6.2 |
| 2015-01-01_00:42:00 | 6.1 |
| 2015-01-01_00:42:01 | 6.1 |
| 2015-01-01_00:42:02 | 6 |
| 2015-01-01_00:42:03 | 5.9 |
| 2015-01-01_00:42:04 | 5.8 |
| 2015-01-01_00:42:05 | 5.8 |
| 2015-01-01_00:42:06 | 5.7 |
| 2015-01-01_00:42:07 | 5.6 |
| 2015-01-01_00:42:08 | 5.5 |
| 2015-01-01_00:42:09 | 5.5 |
| 2015-01-01_00:42:10 | 5.5 |
| 2015-01-01_00:42:11 | 5.5 |
| 2015-01-01_00:42:12 | 5.5 |
| 2015-01-01_00:42:13 | 5.5 |
| 2015-01-01_00:42:14 | 5.5 |
| 2015-01-01_00:42:15 | 5.5 |
| 2015-01-01_00:42:16 | 5.4 |
| 2015-01-01_00:42:17 | 5.3 |
| 2015-01-01_00:42:18 | 5.4 |
| 2015-01-01_00:42:19 | 5.4 |
| 2015-01-01_00:42:20 | 5.5 |
| 2015-01-01_00:42:21 | 5.5 |
| 2015-01-01_00:42:22 | 5.4 |
| 2015-01-01_00:42:23 | 5.3 |
| 2015-01-01_00:42:24 | 5.3 |
| 2015-01-01_00:42:25 | 5.2 |
| 2015-01-01_00:42:26 | 5.2 |
| 2015-01-01_00:42:27 | 5.1 |
| 2015-01-01_00:42:28 | 5.1 |
| 2015-01-01_00:42:29 | 5 |
| 2015-01-01_00:42:30 | 5.1 |
| 2015-01-01_00:42:31 | 5 |
| 2015-01-01_00:42:32 | 4.9 |
| 2015-01-01_00:42:33 | 4.9 |
| 2015-01-01_00:42:34 | 5 |
| 2015-01-01_00:42:35 | 5.1 |
| 2015-01-01_00:42:36 | 5.1 |
| 2015-01-01_00:42:37 | 5 |
| 2015-01-01_00:42:38 | 4.9 |
| 2015-01-01_00:42:39 | 4.9 |
| 2015-01-01_00:42:40 | 4.9 |
| 2015-01-01_00:42:41 | 5.1 |
| 2015-01-01_00:42:42 | 5.1 |
| 2015-01-01_00:42:43 | 5.1 |
| 2015-01-01_00:42:44 | 5.2 |
| 2015-01-01_00:42:45 | 5.2 |
| 2015-01-01_00:42:46 | 5.2 |
| 2015-01-01_00:42:47 | 5.2 |
| 2015-01-01_00:42:48 | 5.2 |
| 2015-01-01_00:42:49 | 5.2 |
| 2015-01-01_00:42:50 | 5.2 |
| 2015-01-01_00:42:51 | 5.2 |
| 2015-01-01_00:42:52 | 5.2 |
| 2015-01-01_00:42:53 | 5.2 |
| 2015-01-01_00:42:54 | 5.2 |
| 2015-01-01_00:42:55 | 5.2 |
| 2015-01-01_00:42:56 | 5.2 |
| 2015-01-01_00:42:57 | 5.2 |
| 2015-01-01_00:42:58 | 5.2 |
| 2015-01-01_00:42:59 | 5.2 |
| 2015-01-01_00:43:00 | 5.2 |
| 2015-01-01_00:43:01 | 5.1 |
| 2015-01-01_00:43:02 | 5.2 |
| 2015-01-01_00:43:03 | 5.2 |
| 2015-01-01_00:43:04 | 5.2 |
| 2015-01-01_00:43:05 | 5.2 |
| 2015-01-01_00:43:06 | 5.2 |
| 2015-01-01_00:43:07 | 5.2 |
| 2015-01-01_00:43:08 | 5.2 |
| 2015-01-01_00:43:09 | 5.2 |
| 2015-01-01_00:43:10 | 5.2 |
| 2015-01-01_00:43:11 | 5.2 |
| 2015-01-01_00:43:12 | 5.1 |
| 2015-01-01_00:43:13 | 5.1 |
| 2015-01-01_00:43:14 | 5.1 |
| 2015-01-01_00:43:15 | 5.2 |
| 2015-01-01_00:43:16 | 5.2 |
| 2015-01-01_00:43:17 | 5.2 |
| 2015-01-01_00:43:18 | 5.2 |
| 2015-01-01_00:43:19 | 5.2 |
| 2015-01-01_00:43:20 | 5.2 |
| 2015-01-01_00:43:21 | 5.2 |
| 2015-01-01_00:43:22 | 5.2 |
| 2015-01-01_00:43:23 | 5.3 |
| 2015-01-01_00:43:24 | 5.3 |
| 2015-01-01_00:43:25 | 5.2 |
| 2015-01-01_00:43:26 | 5.2 |
| 2015-01-01_00:43:27 | 5.2 |
| 2015-01-01_00:43:28 | 5.2 |
| 2015-01-01_00:43:29 | 5.2 |
| 2015-01-01_00:43:30 | 5.2 |
| 2015-01-01_00:43:31 | 5.2 |
| 2015-01-01_00:43:32 | 5.2 |
| 2015-01-01_00:43:33 | 5.2 |
| 2015-01-01_00:43:34 | 5.2 |
| 2015-01-01_00:43:35 | 5.2 |
| 2015-01-01_00:43:36 | 5.2 |
| 2015-01-01_00:43:37 | 5.2 |
| 2015-01-01_00:43:38 | 5.2 |
| 2015-01-01_00:43:39 | 5.2 |
| 2015-01-01_00:43:40 | 5.3 |
| 2015-01-01_00:43:41 | 5.2 |
| 2015-01-01_00:43:42 | 5.2 |
| 2015-01-01_00:43:43 | 5.2 |
| 2015-01-01_00:43:44 | 5.2 |
| 2015-01-01_00:43:45 | 5.2 |
| 2015-01-01_00:43:46 | 5.2 |
| 2015-01-01_00:43:47 | 5.2 |
| 2015-01-01_00:43:48 | 5.2 |
| 2015-01-01_00:43:49 | 5.2 |
| 2015-01-01_00:43:50 | 5.2 |
| 2015-01-01_00:43:51 | 5.2 |
| 2015-01-01_00:43:52 | 5.1 |
| 2015-01-01_00:43:53 | 5.2 |
| 2015-01-01_00:43:54 | 5.2 |
| 2015-01-01_00:43:55 | 5.2 |
| 2015-01-01_00:43:56 | 5.2 |
| 2015-01-01_00:43:57 | 5.2 |
| 2015-01-01_00:43:58 | 5.2 |
| 2015-01-01_00:43:59 | 5.2 |
| 2015-01-01_00:44:00 | 5.2 |
| 2015-01-01_00:44:01 | 5.2 |
| 2015-01-01_00:44:02 | 5.2 |
| 2015-01-01_00:44:03 | 5.2 |
| 2015-01-01_00:44:04 | 5.2 |
| 2015-01-01_00:44:05 | 5.2 |
| 2015-01-01_00:44:06 | 5.2 |
| 2015-01-01_00:44:07 | 5.3 |
| 2015-01-01_00:44:08 | 5.2 |
| 2015-01-01_00:44:09 | 5.2 |
| 2015-01-01_00:44:10 | 5.3 |
| 2015-01-01_00:44:11 | 5.3 |
| 2015-01-01_00:44:12 | 5.3 |
| 2015-01-01_00:44:13 | 5.2 |
| 2015-01-01_00:44:14 | 5.2 |
| 2015-01-01_00:44:15 | 5.3 |
| 2015-01-01_00:44:16 | 5.2 |
| 2015-01-01_00:44:17 | 5.2 |
| 2015-01-01_00:44:18 | 5.2 |
| 2015-01-01_00:44:19 | 5.2 |
| 2015-01-01_00:44:20 | 5.1 |
| 2015-01-01_00:44:21 | 5.1 |
| 2015-01-01_00:44:22 | 4.9 |
| 2015-01-01_00:44:23 | 4.9 |
| 2015-01-01_00:44:24 | 4.8 |
| 2015-01-01_00:44:25 | 4.7 |
| 2015-01-01_00:44:26 | 4.7 |
| 2015-01-01_00:44:27 | 4.6 |
| 2015-01-01_00:44:28 | 4.6 |
| 2015-01-01_00:44:29 | 4.6 |
| 2015-01-01_00:44:30 | 4.5 |
| 2015-01-01_00:44:31 | 4.5 |
| 2015-01-01_00:44:32 | 4.5 |
| 2015-01-01_00:44:33 | 4.4 |
| 2015-01-01_00:44:34 | 4.4 |
| 2015-01-01_00:44:35 | 4.3 |
| 2015-01-01_00:44:36 | 4.3 |
| 2015-01-01_00:44:37 | 4.2 |
| 2015-01-01_00:44:38 | 4.2 |
| 2015-01-01_00:44:39 | 4.1 |
| 2015-01-01_00:44:40 | 3.9 |
| 2015-01-01_00:44:41 | 3.7 |
| 2015-01-01_00:44:42 | 3.6 |
| 2015-01-01_00:44:43 | 3.6 |
| 2015-01-01_00:44:44 | 3.6 |
| 2015-01-01_00:44:45 | 3.5 |
| 2015-01-01_00:44:46 | 3.5 |
| 2015-01-01_00:44:47 | 3.4 |
| 2015-01-01_00:44:48 | 3.4 |
| 2015-01-01_00:44:49 | 3.3 |
| 2015-01-01_00:44:50 | 2.6 |
| 2015-01-01_00:44:51 | 4.4 |
| 2015-01-01_00:44:52 | 4.3 |
| 2015-01-01_00:44:53 | 4.2 |
| 2015-01-01_00:44:54 | 2.7 |
| 2015-01-01_00:44:55 | 4.5 |
| 2015-01-01_00:44:56 | 4.8 |
| 2015-01-01_00:44:57 | 4.7 |
| 2015-01-01_00:44:58 | 4.7 |
| 2015-01-01_00:44:59 | 4.7 |
| 2015-01-01_00:45:00 | 4.8 |
| 2015-01-01_00:45:01 | 5 |
| 2015-01-01_00:45:02 | 5.2 |
| 2015-01-01_00:45:03 | 5.3 |
| 2015-01-01_00:45:04 | 5.4 |
| 2015-01-01_00:45:05 | 5.6 |
| 2015-01-01_00:45:06 | 5.7 |
| 2015-01-01_00:45:07 | 5.7 |
| 2015-01-01_00:45:08 | 5.9 |
| 2015-01-01_00:45:09 | 6.1 |
| 2015-01-01_00:45:10 | 6.2 |
| 2015-01-01_00:45:11 | 6.3 |
| 2015-01-01_00:45:12 | 6.4 |
| 2015-01-01_00:45:13 | 5.5 |
| 2015-01-01_00:45:14 | 5.5 |
| 2015-01-01_00:45:15 | 5.6 |
| 2015-01-01_00:45:16 | 5.7 |
| 2015-01-01_00:45:17 | 5.8 |
| 2015-01-01_00:45:18 | 5.8 |
| 2015-01-01_00:45:19 | 5.8 |
| 2015-01-01_00:45:20 | 5.7 |
| 2015-01-01_00:45:21 | 5.6 |
| 2015-01-01_00:45:22 | 5.6 |
| 2015-01-01_00:45:23 | 5.6 |
| 2015-01-01_00:45:24 | 5.7 |
| 2015-01-01_00:45:25 | 5.7 |
| 2015-01-01_00:45:26 | 5.9 |
| 2015-01-01_00:45:27 | 5.9 |
| 2015-01-01_00:45:28 | 6 |
| 2015-01-01_00:45:29 | 6.1 |
| 2015-01-01_00:45:30 | 6.1 |
| 2015-01-01_00:45:31 | 6.1 |
| 2015-01-01_00:45:32 | 6.1 |
| 2015-01-01_00:45:33 | 6 |
| 2015-01-01_00:45:34 | 6 |
| 2015-01-01_00:45:35 | 6 |
| 2015-01-01_00:45:36 | 6 |
| 2015-01-01_00:45:37 | 6 |
| 2015-01-01_00:45:38 | 4.9 |
| 2015-01-01_00:45:39 | 5.1 |
| 2015-01-01_00:45:40 | 5 |
| 2015-01-01_00:45:41 | 5.1 |
| 2015-01-01_00:45:42 | 5.2 |
| 2015-01-01_00:45:43 | 5.3 |
| 2015-01-01_00:45:44 | 5.3 |
| 2015-01-01_00:45:45 | 5.3 |
| 2015-01-01_00:45:46 | 5.3 |
| 2015-01-01_00:45:47 | 5.3 |
| 2015-01-01_00:45:48 | 5.3 |
| 2015-01-01_00:45:49 | 5.3 |
| 2015-01-01_00:45:50 | 5.2 |
| 2015-01-01_00:45:51 | 5.2 |
| 2015-01-01_00:45:52 | 5.2 |
| 2015-01-01_00:45:53 | 5.2 |
| 2015-01-01_00:45:54 | 5.2 |
| 2015-01-01_00:45:55 | 5.2 |
| 2015-01-01_00:45:56 | 5.1 |
| 2015-01-01_00:45:57 | 5.1 |
| 2015-01-01_00:45:58 | 5 |
| 2015-01-01_00:45:59 | 5 |
| 2015-01-01_00:46:00 | 4.9 |
| 2015-01-01_00:46:01 | 4.9 |
| 2015-01-01_00:46:02 | 5 |
| 2015-01-01_00:46:03 | 4.9 |
| 2015-01-01_00:46:04 | 4.8 |
| 2015-01-01_00:46:05 | 4.7 |
| 2015-01-01_00:46:06 | 4.6 |
| 2015-01-01_00:46:07 | 4.6 |
| 2015-01-01_00:46:08 | 4.5 |
| 2015-01-01_00:46:09 | 4.5 |
| 2015-01-01_00:46:10 | 4.5 |
| 2015-01-01_00:46:11 | 4.5 |
| 2015-01-01_00:46:12 | 4.6 |
| 2015-01-01_00:46:13 | 4.7 |
| 2015-01-01_00:46:14 | 4.7 |
| 2015-01-01_00:46:15 | 4.8 |
| 2015-01-01_00:46:16 | 4.7 |
| 2015-01-01_00:46:17 | 4.8 |
| 2015-01-01_00:46:18 | 4.9 |
| 2015-01-01_00:46:19 | 5 |
| 2015-01-01_00:46:20 | 5.1 |
| 2015-01-01_00:46:21 | 5.2 |
| 2015-01-01_00:46:22 | 5.3 |
| 2015-01-01_00:46:23 | 5.4 |
| 2015-01-01_00:46:24 | 5.5 |
| 2015-01-01_00:46:25 | 5.5 |
| 2015-01-01_00:46:26 | 4.7 |
| 2015-01-01_00:46:27 | 3.9 |
| 2015-01-01_00:46:28 | 5.7 |
| 2015-01-01_00:46:29 | 5.6 |
| 2015-01-01_00:46:30 | 5.7 |
| 2015-01-01_00:46:31 | 5.7 |
| 2015-01-01_00:46:32 | 5.7 |
| 2015-01-01_00:46:33 | 5.6 |
| 2015-01-01_00:46:34 | 5.6 |
| 2015-01-01_00:46:35 | 5.6 |
| 2015-01-01_00:46:36 | 5.7 |
| 2015-01-01_00:46:37 | 5.7 |
| 2015-01-01_00:46:38 | 5.8 |
| 2015-01-01_00:46:39 | 5.8 |
| 2015-01-01_00:46:40 | 5.9 |
| 2015-01-01_00:46:41 | 5.8 |
| 2015-01-01_00:46:42 | 5.9 |
| 2015-01-01_00:46:43 | 5.9 |
| 2015-01-01_00:46:44 | 5.8 |
| 2015-01-01_00:46:45 | 5.7 |
| 2015-01-01_00:46:46 | 5.6 |
| 2015-01-01_00:46:47 | 5.6 |
| 2015-01-01_00:46:48 | 5.4 |
| 2015-01-01_00:46:49 | 5.4 |
| 2015-01-01_00:46:50 | 5.4 |
| 2015-01-01_00:46:51 | 5.4 |
| 2015-01-01_00:46:52 | 5.3 |
| 2015-01-01_00:46:53 | 5.3 |
| 2015-01-01_00:46:54 | 5.3 |
| 2015-01-01_00:46:55 | 5.2 |
| 2015-01-01_00:46:56 | 5.2 |
| 2015-01-01_00:46:57 | 5.3 |
| 2015-01-01_00:46:58 | 5.3 |
| 2015-01-01_00:46:59 | 5.3 |
| 2015-01-01_00:47:00 | 5.3 |
| 2015-01-01_00:47:01 | 5.3 |
| 2015-01-01_00:47:02 | 5.4 |
| 2015-01-01_00:47:03 | 5.4 |
| 2015-01-01_00:47:04 | 5.3 |
| 2015-01-01_00:47:05 | 5.4 |
| 2015-01-01_00:47:06 | 5.3 |
| 2015-01-01_00:47:07 | 5.4 |
| 2015-01-01_00:47:08 | 5.4 |
| 2015-01-01_00:47:09 | 5.4 |
| 2015-01-01_00:47:10 | 5.4 |
| 2015-01-01_00:47:11 | 5.4 |
| 2015-01-01_00:47:12 | 5.5 |
| 2015-01-01_00:47:13 | 5.5 |
| 2015-01-01_00:47:14 | 5.5 |
| 2015-01-01_00:47:15 | 5.5 |
| 2015-01-01_00:47:16 | 5.5 |
| 2015-01-01_00:47:17 | 5.5 |
| 2015-01-01_00:47:18 | 5.5 |
| 2015-01-01_00:47:19 | 5.5 |
| 2015-01-01_00:47:20 | 5.4 |
| 2015-01-01_00:47:21 | 5.4 |
| 2015-01-01_00:47:22 | 5.5 |
| 2015-01-01_00:47:23 | 5.4 |
| 2015-01-01_00:47:24 | 5.4 |
| 2015-01-01_00:47:25 | 5.5 |
| 2015-01-01_00:47:26 | 5.4 |
| 2015-01-01_00:47:27 | 5.4 |
| 2015-01-01_00:47:28 | 5.4 |
| 2015-01-01_00:47:29 | 5.5 |
| 2015-01-01_00:47:30 | 5.4 |
| 2015-01-01_00:47:31 | 5.4 |
| 2015-01-01_00:47:32 | 5.4 |
| 2015-01-01_00:47:33 | 5.5 |
| 2015-01-01_00:47:34 | 5.4 |
| 2015-01-01_00:47:35 | 5.4 |
| 2015-01-01_00:47:36 | 5.3 |
| 2015-01-01_00:47:37 | 5.2 |
| 2015-01-01_00:47:38 | 5.1 |
| 2015-01-01_00:47:39 | 5 |
| 2015-01-01_00:47:40 | 5.1 |
| 2015-01-01_00:47:41 | 5.2 |
| 2015-01-01_00:47:42 | 5.2 |
| 2015-01-01_00:47:43 | 5.3 |
| 2015-01-01_00:47:44 | 5.4 |
| 2015-01-01_00:47:45 | 5.5 |
| 2015-01-01_00:47:46 | 5.4 |
| 2015-01-01_00:47:47 | 5.3 |
| 2015-01-01_00:47:48 | 5.3 |
| 2015-01-01_00:47:49 | 5.3 |
| 2015-01-01_00:47:50 | 5.4 |
| 2015-01-01_00:47:51 | 5.5 |
| 2015-01-01_00:47:52 | 5.5 |
| 2015-01-01_00:47:53 | 5.6 |
| 2015-01-01_00:47:54 | 5.6 |
| 2015-01-01_00:47:55 | 5.7 |
| 2015-01-01_00:47:56 | 5.7 |
| 2015-01-01_00:47:57 | 5.8 |
| 2015-01-01_00:47:58 | 5.8 |
| 2015-01-01_00:47:59 | 5.7 |
| 2015-01-01_00:48:00 | 5.7 |
| 2015-01-01_00:48:01 | 5.7 |
| 2015-01-01_00:48:02 | 5.8 |
| 2015-01-01_00:48:03 | 5.8 |
| 2015-01-01_00:48:04 | 5.7 |
| 2015-01-01_00:48:05 | 5.7 |
| 2015-01-01_00:48:06 | 5.6 |
| 2015-01-01_00:48:07 | 5.6 |
| 2015-01-01_00:48:08 | 5.6 |
| 2015-01-01_00:48:09 | 5.7 |
| 2015-01-01_00:48:10 | 5.7 |
| 2015-01-01_00:48:11 | 5.7 |
| 2015-01-01_00:48:12 | 5.7 |
| 2015-01-01_00:48:13 | 5.7 |
| 2015-01-01_00:48:14 | 5.6 |
| 2015-01-01_00:48:15 | 5.7 |
| 2015-01-01_00:48:16 | 5.7 |
| 2015-01-01_00:48:17 | 5.8 |
| 2015-01-01_00:48:18 | 5.8 |
| 2015-01-01_00:48:19 | 5.7 |
| 2015-01-01_00:48:20 | 5.6 |
| 2015-01-01_00:48:21 | 5.6 |
| 2015-01-01_00:48:22 | 5.6 |
| 2015-01-01_00:48:23 | 5.5 |
| 2015-01-01_00:48:24 | 5.6 |
| 2015-01-01_00:48:25 | 5.7 |
| 2015-01-01_00:48:26 | 5.7 |
| 2015-01-01_00:48:27 | 5.7 |
| 2015-01-01_00:48:28 | 5.7 |
| 2015-01-01_00:48:29 | 5.7 |
| 2015-01-01_00:48:30 | 5.6 |
| 2015-01-01_00:48:31 | 5.7 |
| 2015-01-01_00:48:32 | 5.7 |
| 2015-01-01_00:48:33 | 5.7 |
| 2015-01-01_00:48:34 | 5.7 |
| 2015-01-01_00:48:35 | 5.6 |
| 2015-01-01_00:48:36 | 5.6 |
| 2015-01-01_00:48:37 | 5.6 |
| 2015-01-01_00:48:38 | 5.6 |
| 2015-01-01_00:48:39 | 5.6 |
| 2015-01-01_00:48:40 | 5.7 |
| 2015-01-01_00:48:41 | 5.8 |
| 2015-01-01_00:48:42 | 5.9 |
| 2015-01-01_00:48:43 | 5.9 |
| 2015-01-01_00:48:44 | 6 |
| 2015-01-01_00:48:45 | 6 |
| 2015-01-01_00:48:46 | 6 |
| 2015-01-01_00:48:47 | 6 |
| 2015-01-01_00:48:48 | 6 |
| 2015-01-01_00:48:49 | 6.1 |
| 2015-01-01_00:48:50 | 6.1 |
| 2015-01-01_00:48:51 | 6.1 |
| 2015-01-01_00:48:52 | 6.1 |
| 2015-01-01_00:48:53 | 6.1 |
| 2015-01-01_00:48:54 | 6.1 |
| 2015-01-01_00:48:55 | 6.2 |
| 2015-01-01_00:48:56 | 6.2 |
| 2015-01-01_00:48:57 | 6.2 |
| 2015-01-01_00:48:58 | 6.1 |
| 2015-01-01_00:48:59 | 6.1 |
| 2015-01-01_00:49:00 | 6.1 |
| 2015-01-01_00:49:01 | 6.1 |
| 2015-01-01_00:49:02 | 6.1 |
| 2015-01-01_00:49:03 | 6.1 |
| 2015-01-01_00:49:04 | 6.1 |
| 2015-01-01_00:49:05 | 6.1 |
| 2015-01-01_00:49:06 | 6.1 |
| 2015-01-01_00:49:07 | 6 |
| 2015-01-01_00:49:08 | 5.9 |
| 2015-01-01_00:49:09 | 5.8 |
| 2015-01-01_00:49:10 | 5.7 |
| 2015-01-01_00:49:11 | 5.7 |
| 2015-01-01_00:49:12 | 5.7 |
| 2015-01-01_00:49:13 | 5.7 |
| 2015-01-01_00:49:14 | 5.7 |
| 2015-01-01_00:49:15 | 5.6 |
| 2015-01-01_00:49:16 | 5.5 |
| 2015-01-01_00:49:17 | 5.5 |
| 2015-01-01_00:49:18 | 5.5 |
| 2015-01-01_00:49:19 | 5.6 |
| 2015-01-01_00:49:20 | 5.7 |
| 2015-01-01_00:49:21 | 5.7 |
| 2015-01-01_00:49:22 | 5.7 |
| 2015-01-01_00:49:23 | 5.6 |
| 2015-01-01_00:49:24 | 5.6 |
| 2015-01-01_00:49:25 | 5.5 |
| 2015-01-01_00:49:26 | 5.5 |
| 2015-01-01_00:49:27 | 5.4 |
| 2015-01-01_00:49:28 | 5.5 |
| 2015-01-01_00:49:29 | 5.6 |
| 2015-01-01_00:49:30 | 5.5 |
| 2015-01-01_00:49:31 | 5.6 |
| 2015-01-01_00:49:32 | 5.5 |
| 2015-01-01_00:49:33 | 5.5 |
| 2015-01-01_00:49:34 | 5.7 |
| 2015-01-01_00:49:35 | 5.8 |
| 2015-01-01_00:49:36 | 5.9 |
| 2015-01-01_00:49:37 | 5.9 |
| 2015-01-01_00:49:38 | 5.9 |
| 2015-01-01_00:49:39 | 6 |
| 2015-01-01_00:49:40 | 6 |
| 2015-01-01_00:49:41 | 6 |
| 2015-01-01_00:49:42 | 6 |
| 2015-01-01_00:49:43 | 6 |
| 2015-01-01_00:49:44 | 6 |
| 2015-01-01_00:49:45 | 5.9 |
| 2015-01-01_00:49:46 | 5.9 |
| 2015-01-01_00:49:47 | 5.8 |
| 2015-01-01_00:49:48 | 5.7 |
| 2015-01-01_00:49:49 | 5.6 |
| 2015-01-01_00:49:50 | 5.5 |
| 2015-01-01_00:49:51 | 5.5 |
| 2015-01-01_00:49:52 | 5.5 |
| 2015-01-01_00:49:53 | 5.5 |
| 2015-01-01_00:49:54 | 5.6 |
| 2015-01-01_00:49:55 | 5.7 |
| 2015-01-01_00:49:56 | 5.7 |
| 2015-01-01_00:49:57 | 5.8 |
| 2015-01-01_00:49:58 | 5.7 |
| 2015-01-01_00:49:59 | 5.6 |
| 2015-01-01_00:50:00 | 5.6 |
| 2015-01-01_00:50:01 | 5.6 |
| 2015-01-01_00:50:02 | 5.6 |
| 2015-01-01_00:50:03 | 5.6 |
| 2015-01-01_00:50:04 | 5.5 |
| 2015-01-01_00:50:05 | 5.5 |
| 2015-01-01_00:50:06 | 5.4 |
| 2015-01-01_00:50:07 | 5.4 |
| 2015-01-01_00:50:08 | 5.3 |
| 2015-01-01_00:50:09 | 5.2 |
| 2015-01-01_00:50:10 | 5.2 |
| 2015-01-01_00:50:11 | 5.1 |
| 2015-01-01_00:50:12 | 5 |
| 2015-01-01_00:50:13 | 4.9 |
| 2015-01-01_00:50:14 | 4.9 |
| 2015-01-01_00:50:15 | 4.9 |
| 2015-01-01_00:50:16 | 4.9 |
| 2015-01-01_00:50:17 | 4.8 |
| 2015-01-01_00:50:18 | 4.8 |
| 2015-01-01_00:50:19 | 4.8 |
| 2015-01-01_00:50:20 | 4.7 |
| 2015-01-01_00:50:21 | 4.7 |
| 2015-01-01_00:50:22 | 4.6 |
| 2015-01-01_00:50:23 | 4.7 |
| 2015-01-01_00:50:24 | 4.7 |
| 2015-01-01_00:50:25 | 4.7 |
| 2015-01-01_00:50:26 | 4.8 |
| 2015-01-01_00:50:27 | 4.8 |
| 2015-01-01_00:50:28 | 4.9 |
| 2015-01-01_00:50:29 | 4.8 |
| 2015-01-01_00:50:30 | 4.8 |
| 2015-01-01_00:50:31 | 4.7 |
| 2015-01-01_00:50:32 | 4.7 |
| 2015-01-01_00:50:33 | 4.7 |
| 2015-01-01_00:50:34 | 4.7 |
| 2015-01-01_00:50:35 | 4.6 |
| 2015-01-01_00:50:36 | 4.6 |
| 2015-01-01_00:50:37 | 4.7 |
| 2015-01-01_00:50:38 | 4.8 |
| 2015-01-01_00:50:39 | 4.9 |
| 2015-01-01_00:50:40 | 5 |
| 2015-01-01_00:50:41 | 5.2 |
| 2015-01-01_00:50:42 | 5.3 |
| 2015-01-01_00:50:43 | 5.4 |
| 2015-01-01_00:50:44 | 5.6 |
| 2015-01-01_00:50:45 | 5.7 |
| 2015-01-01_00:50:46 | 5.9 |
| 2015-01-01_00:50:47 | 6 |
| 2015-01-01_00:50:48 | 6.1 |
| 2015-01-01_00:50:49 | 6.2 |
| 2015-01-01_00:50:50 | 6.1 |
| 2015-01-01_00:50:51 | 6.1 |
| 2015-01-01_00:50:52 | 6 |
| 2015-01-01_00:50:53 | 5.9 |
| 2015-01-01_00:50:54 | 5.8 |
| 2015-01-01_00:50:55 | 5.8 |
| 2015-01-01_00:50:56 | 5.6 |
| 2015-01-01_00:50:57 | 5.6 |
| 2015-01-01_00:50:58 | 5.8 |
| 2015-01-01_00:50:59 | 5.9 |
| 2015-01-01_00:51:00 | 6.1 |
| 2015-01-01_00:51:01 | 6.2 |
| 2015-01-01_00:51:02 | 6.2 |
| 2015-01-01_00:51:03 | 6.2 |
| 2015-01-01_00:51:04 | 6.2 |
| 2015-01-01_00:51:05 | 6.3 |
| 2015-01-01_00:51:06 | 6.3 |
| 2015-01-01_00:51:07 | 6.4 |
| 2015-01-01_00:51:08 | 6.4 |
| 2015-01-01_00:51:09 | 6.4 |
| 2015-01-01_00:51:10 | 6.5 |
| 2015-01-01_00:51:11 | 6.3 |
| 2015-01-01_00:51:12 | 6.4 |
| 2015-01-01_00:51:13 | 6.4 |
| 2015-01-01_00:51:14 | 6.4 |
| 2015-01-01_00:51:15 | 6.4 |
| 2015-01-01_00:51:16 | 6.5 |
| 2015-01-01_00:51:17 | 6.5 |
| 2015-01-01_00:51:18 | 6.5 |
| 2015-01-01_00:51:19 | 6.5 |
| 2015-01-01_00:51:20 | 6.5 |
| 2015-01-01_00:51:21 | 6.5 |
| 2015-01-01_00:51:22 | 6.4 |
| 2015-01-01_00:51:23 | 6.5 |
| 2015-01-01_00:51:24 | 6.4 |
| 2015-01-01_00:51:25 | 6.4 |
| 2015-01-01_00:51:26 | 6.5 |
| 2015-01-01_00:51:27 | 6.5 |
| 2015-01-01_00:51:28 | 6.5 |
| 2015-01-01_00:51:29 | 6.5 |
| 2015-01-01_00:51:30 | 6.5 |
| 2015-01-01_00:51:31 | 6.5 |
| 2015-01-01_00:51:32 | 6.5 |
| 2015-01-01_00:51:33 | 6.4 |
| 2015-01-01_00:51:34 | 6.5 |
| 2015-01-01_00:51:35 | 6.5 |
| 2015-01-01_00:51:36 | 6.5 |
| 2015-01-01_00:51:37 | 6.5 |
| 2015-01-01_00:51:38 | 6.5 |
| 2015-01-01_00:51:39 | 6.4 |
| 2015-01-01_00:51:40 | 6.4 |
| 2015-01-01_00:51:41 | 6.4 |
| 2015-01-01_00:51:42 | 6.5 |
| 2015-01-01_00:51:43 | 6.4 |
| 2015-01-01_00:51:44 | 6.4 |
| 2015-01-01_00:51:45 | 6.4 |
| 2015-01-01_00:51:46 | 6.5 |
| 2015-01-01_00:51:47 | 6.5 |
| 2015-01-01_00:51:48 | 6.5 |
| 2015-01-01_00:51:49 | 6.5 |
| 2015-01-01_00:51:50 | 6.5 |
| 2015-01-01_00:51:51 | 6.5 |
| 2015-01-01_00:51:52 | 6.5 |
| 2015-01-01_00:51:53 | 6.5 |
| 2015-01-01_00:51:54 | 6.4 |
| 2015-01-01_00:51:55 | 6.4 |
| 2015-01-01_00:51:56 | 6.4 |
| 2015-01-01_00:51:57 | 6.4 |
| 2015-01-01_00:51:58 | 6.4 |
| 2015-01-01_00:51:59 | 6.4 |
| 2015-01-01_00:52:00 | 6.4 |
| 2015-01-01_00:52:01 | 6.5 |
| 2015-01-01_00:52:02 | 6.5 |
| 2015-01-01_00:52:03 | 6.5 |
| 2015-01-01_00:52:04 | 6.5 |
| 2015-01-01_00:52:05 | 6.4 |
| 2015-01-01_00:52:06 | 6.4 |
| 2015-01-01_00:52:07 | 6.4 |
| 2015-01-01_00:52:08 | 6.4 |
| 2015-01-01_00:52:09 | 6.5 |
| 2015-01-01_00:52:10 | 6.5 |
| 2015-01-01_00:52:11 | 6.5 |
| 2015-01-01_00:52:12 | 6.5 |
| 2015-01-01_00:52:13 | 6.5 |
| 2015-01-01_00:52:14 | 6.5 |
| 2015-01-01_00:52:15 | 6.5 |
| 2015-01-01_00:52:16 | 6.5 |
| 2015-01-01_00:52:17 | 6.5 |
| 2015-01-01_00:52:18 | 6.5 |
| 2015-01-01_00:52:19 | 6.5 |
| 2015-01-01_00:52:20 | 6.5 |
| 2015-01-01_00:52:21 | 6.4 |
| 2015-01-01_00:52:22 | 6.4 |
| 2015-01-01_00:52:23 | 6.5 |
| 2015-01-01_00:52:24 | 6.4 |
| 2015-01-01_00:52:25 | 6.5 |
| 2015-01-01_00:52:26 | 6.5 |
| 2015-01-01_00:52:27 | 6.5 |
| 2015-01-01_00:52:28 | 6.4 |
| 2015-01-01_00:52:29 | 6.5 |
| 2015-01-01_00:52:30 | 6.5 |
| 2015-01-01_00:52:31 | 6.5 |
| 2015-01-01_00:52:32 | 6.5 |
| 2015-01-01_00:52:33 | 6.5 |
| 2015-01-01_00:52:34 | 6.5 |
| 2015-01-01_00:52:35 | 6.5 |
| 2015-01-01_00:52:36 | 6.5 |
| 2015-01-01_00:52:37 | 6.4 |
| 2015-01-01_00:52:38 | 6.4 |
| 2015-01-01_00:52:39 | 6.4 |
| 2015-01-01_00:52:40 | 6.4 |
| 2015-01-01_00:52:41 | 6.4 |
| 2015-01-01_00:52:42 | 6.4 |
| 2015-01-01_00:52:43 | 6.5 |
| 2015-01-01_00:52:44 | 6.4 |
| 2015-01-01_00:52:45 | 6.4 |
| 2015-01-01_00:52:46 | 6.4 |
| 2015-01-01_00:52:47 | 6.4 |
| 2015-01-01_00:52:48 | 6.4 |
| 2015-01-01_00:52:49 | 6.4 |
| 2015-01-01_00:52:50 | 6.4 |
| 2015-01-01_00:52:51 | 6.4 |
| 2015-01-01_00:52:52 | 6.4 |
| 2015-01-01_00:52:53 | 6.4 |
| 2015-01-01_00:52:54 | 6.5 |
| 2015-01-01_00:52:55 | 6.5 |
| 2015-01-01_00:52:56 | 6.5 |
| 2015-01-01_00:52:57 | 6.5 |
| 2015-01-01_00:52:58 | 6.4 |
| 2015-01-01_00:52:59 | 6.5 |
| 2015-01-01_00:53:00 | 6.4 |
| 2015-01-01_00:53:01 | 6.5 |
| 2015-01-01_00:53:02 | 6.4 |
| 2015-01-01_00:53:03 | 6.4 |
| 2015-01-01_00:53:04 | 6.5 |
| 2015-01-01_00:53:05 | 6.5 |
| 2015-01-01_00:53:06 | 6.4 |
| 2015-01-01_00:53:07 | 6.4 |
| 2015-01-01_00:53:08 | 6.4 |
| 2015-01-01_00:53:09 | 6.4 |
| 2015-01-01_00:53:10 | 6.5 |
| 2015-01-01_00:53:11 | 6.4 |
| 2015-01-01_00:53:12 | 6.4 |
| 2015-01-01_00:53:13 | 6.5 |
| 2015-01-01_00:53:14 | 6.4 |
| 2015-01-01_00:53:15 | 6.4 |
| 2015-01-01_00:53:16 | 6.4 |
| 2015-01-01_00:53:17 | 6.4 |
| 2015-01-01_00:53:18 | 6.4 |
| 2015-01-01_00:53:19 | 6.4 |
| 2015-01-01_00:53:20 | 6.4 |
| 2015-01-01_00:53:21 | 6.4 |
| 2015-01-01_00:53:22 | 6.4 |
| 2015-01-01_00:53:23 | 6.4 |
| 2015-01-01_00:53:24 | 6.4 |
| 2015-01-01_00:53:25 | 6.4 |
| 2015-01-01_00:53:26 | 6.4 |
| 2015-01-01_00:53:27 | 6.4 |
| 2015-01-01_00:53:28 | 6.4 |
| 2015-01-01_00:53:29 | 6.4 |
| 2015-01-01_00:53:30 | 6.4 |
| 2015-01-01_00:53:31 | 6.4 |
| 2015-01-01_00:53:32 | 6.4 |
| 2015-01-01_00:53:33 | 6.4 |
| 2015-01-01_00:53:34 | 6.4 |
| 2015-01-01_00:53:35 | 6.4 |
| 2015-01-01_00:53:36 | 6.4 |
| 2015-01-01_00:53:37 | 6.4 |
| 2015-01-01_00:53:38 | 6.4 |
| 2015-01-01_00:53:39 | 6.4 |
| 2015-01-01_00:53:40 | 6.4 |
| 2015-01-01_00:53:41 | 6.4 |
| 2015-01-01_00:53:42 | 6.4 |
| 2015-01-01_00:53:43 | 6.4 |
| 2015-01-01_00:53:44 | 6.4 |
| 2015-01-01_00:53:45 | 6.4 |
| 2015-01-01_00:53:46 | 6.4 |
| 2015-01-01_00:53:47 | 6.4 |
| 2015-01-01_00:53:48 | 6.4 |
| 2015-01-01_00:53:49 | 6.4 |
| 2015-01-01_00:53:50 | 6.4 |
| 2015-01-01_00:53:51 | 6.4 |
| 2015-01-01_00:53:52 | 6.4 |
| 2015-01-01_00:53:53 | 6.4 |
| 2015-01-01_00:53:54 | 6.4 |
| 2015-01-01_00:53:55 | 6.4 |
| 2015-01-01_00:53:56 | 6.4 |
| 2015-01-01_00:53:57 | 6.4 |
| 2015-01-01_00:53:58 | 6.4 |
| 2015-01-01_00:53:59 | 6.4 |
| 2015-01-01_00:54:00 | 6.4 |
| 2015-01-01_00:54:01 | 6.4 |
| 2015-01-01_00:54:02 | 6.4 |
| 2015-01-01_00:54:03 | 6.4 |
| 2015-01-01_00:54:04 | 6.4 |
| 2015-01-01_00:54:05 | 6.4 |
| 2015-01-01_00:54:06 | 6.4 |
| 2015-01-01_00:54:07 | 6.4 |
| 2015-01-01_00:54:08 | 6.4 |
| 2015-01-01_00:54:09 | 6.4 |
| 2015-01-01_00:54:10 | 6.4 |
| 2015-01-01_00:54:11 | 6.4 |
| 2015-01-01_00:54:12 | 6.4 |
| 2015-01-01_00:54:13 | 6.4 |
| 2015-01-01_00:54:14 | 6.4 |
| 2015-01-01_00:54:15 | 6.4 |
| 2015-01-01_00:54:16 | 6.4 |
| 2015-01-01_00:54:17 | 6.4 |
| 2015-01-01_00:54:18 | 6.4 |
| 2015-01-01_00:54:19 | 6.4 |
| 2015-01-01_00:54:20 | 6.4 |
| 2015-01-01_00:54:21 | 6.3 |
| 2015-01-01_00:54:22 | 6.3 |
| 2015-01-01_00:54:23 | 6.3 |
| 2015-01-01_00:54:24 | 6.2 |
| 2015-01-01_00:54:25 | 6.1 |
| 2015-01-01_00:54:26 | 6 |
| 2015-01-01_00:54:27 | 6 |
| 2015-01-01_00:54:28 | 6 |
| 2015-01-01_00:54:29 | 6 |
| 2015-01-01_00:54:30 | 6 |
| 2015-01-01_00:54:31 | 6 |
| 2015-01-01_00:54:32 | 6 |
| 2015-01-01_00:54:33 | 6 |
| 2015-01-01_00:54:34 | 5.9 |
| 2015-01-01_00:54:35 | 6 |
| 2015-01-01_00:54:36 | 6.1 |
| 2015-01-01_00:54:37 | 6.1 |
| 2015-01-01_00:54:38 | 6.1 |
| 2015-01-01_00:54:39 | 6.2 |
| 2015-01-01_00:54:40 | 6.3 |
| 2015-01-01_00:54:41 | 6.2 |
| 2015-01-01_00:54:42 | 6.3 |
| 2015-01-01_00:54:43 | 6.3 |
| 2015-01-01_00:54:44 | 6.3 |
| 2015-01-01_00:54:45 | 6.3 |
| 2015-01-01_00:54:46 | 6.1 |
| 2015-01-01_00:54:47 | 6.3 |
| 2015-01-01_00:54:48 | 6.3 |
| 2015-01-01_00:54:49 | 6.3 |
| 2015-01-01_00:54:50 | 6.4 |
| 2015-01-01_00:54:51 | 6.4 |
| 2015-01-01_00:54:52 | 6.3 |
| 2015-01-01_00:54:53 | 6.4 |
| 2015-01-01_00:54:54 | 6.3 |
| 2015-01-01_00:54:55 | 6.4 |
| 2015-01-01_00:54:56 | 6.3 |
| 2015-01-01_00:54:57 | 6.3 |
| 2015-01-01_00:54:58 | 6.3 |
| 2015-01-01_00:54:59 | 6.3 |
| 2015-01-01_00:55:00 | 6.3 |
| 2015-01-01_00:55:01 | 6.3 |
| 2015-01-01_00:55:02 | 6.2 |
| 2015-01-01_00:55:03 | 6.1 |
| 2015-01-01_00:55:04 | 6.1 |
| 2015-01-01_00:55:05 | 6.1 |
| 2015-01-01_00:55:06 | 6.2 |
| 2015-01-01_00:55:07 | 6.2 |
| 2015-01-01_00:55:08 | 6.2 |
| 2015-01-01_00:55:09 | 6.1 |
| 2015-01-01_00:55:10 | 6.1 |
| 2015-01-01_00:55:11 | 6 |
| 2015-01-01_00:55:12 | 6 |
| 2015-01-01_00:55:13 | 5.9 |
| 2015-01-01_00:55:14 | 5.9 |
| 2015-01-01_00:55:15 | 5.8 |
| 2015-01-01_00:55:16 | 5.7 |
| 2015-01-01_00:55:17 | 5.6 |
| 2015-01-01_00:55:18 | 5.6 |
| 2015-01-01_00:55:19 | 5.5 |
| 2015-01-01_00:55:20 | 5.4 |
| 2015-01-01_00:55:21 | 5.4 |
| 2015-01-01_00:55:22 | 5.3 |
| 2015-01-01_00:55:23 | 5.2 |
| 2015-01-01_00:55:24 | 5.2 |
| 2015-01-01_00:55:25 | 5.1 |
| 2015-01-01_00:55:26 | 4.9 |
| 2015-01-01_00:55:27 | 4.8 |
| 2015-01-01_00:55:28 | 4.8 |
| 2015-01-01_00:55:29 | 4.8 |
| 2015-01-01_00:55:30 | 4.7 |
| 2015-01-01_00:55:31 | 4.7 |
| 2015-01-01_00:55:32 | 4.7 |
| 2015-01-01_00:55:33 | 4.7 |
| 2015-01-01_00:55:34 | 4.6 |
| 2015-01-01_00:55:35 | 4.7 |
| 2015-01-01_00:55:36 | 4.7 |
| 2015-01-01_00:55:37 | 4.7 |
| 2015-01-01_00:55:38 | 4.8 |
| 2015-01-01_00:55:39 | 4.8 |
| 2015-01-01_00:55:40 | 4.7 |
| 2015-01-01_00:55:41 | 4.7 |
| 2015-01-01_00:55:42 | 4.7 |
| 2015-01-01_00:55:43 | 4.7 |
| 2015-01-01_00:55:44 | 4.6 |
| 2015-01-01_00:55:45 | 4.5 |
| 2015-01-01_00:55:46 | 4.4 |
| 2015-01-01_00:55:47 | 4.4 |
| 2015-01-01_00:55:48 | 4.3 |
| 2015-01-01_00:55:49 | 4.3 |
| 2015-01-01_00:55:50 | 4.2 |
| 2015-01-01_00:55:51 | 4.2 |
| 2015-01-01_00:55:52 | 4.2 |
| 2015-01-01_00:55:53 | 4.2 |
| 2015-01-01_00:55:54 | 4.1 |
| 2015-01-01_00:55:55 | 4.2 |
| 2015-01-01_00:55:56 | 4.2 |
| 2015-01-01_00:55:57 | 4.3 |
| 2015-01-01_00:55:58 | 4.3 |
| 2015-01-01_00:55:59 | 4.3 |
| 2015-01-01_00:56:00 | 4.3 |
| 2015-01-01_00:56:01 | 4.2 |
| 2015-01-01_00:56:02 | 4.3 |
| 2015-01-01_00:56:03 | 4.2 |
| 2015-01-01_00:56:04 | 4.3 |
| 2015-01-01_00:56:05 | 4.4 |
| 2015-01-01_00:56:06 | 4.4 |
| 2015-01-01_00:56:07 | 4.3 |
| 2015-01-01_00:56:08 | 4.3 |
| 2015-01-01_00:56:09 | 4.2 |
| 2015-01-01_00:56:10 | 4.1 |
| 2015-01-01_00:56:11 | 3.2 |
| 2015-01-01_00:56:12 | 2.4 |
| 2015-01-01_00:56:13 | 4.9 |
| 2015-01-01_00:56:14 | 4.8 |
| 2015-01-01_00:56:15 | 4.8 |
| 2015-01-01_00:56:16 | 4.8 |
| 2015-01-01_00:56:17 | 4.8 |
| 2015-01-01_00:56:18 | 4.8 |
| 2015-01-01_00:56:19 | 4.8 |
| 2015-01-01_00:56:20 | 4.7 |
| 2015-01-01_00:56:21 | 4.7 |
| 2015-01-01_00:56:22 | 4.7 |
| 2015-01-01_00:56:23 | 4.7 |
| 2015-01-01_00:56:24 | 4.7 |
| 2015-01-01_00:56:25 | 4.7 |
| 2015-01-01_00:56:26 | 4.6 |
| 2015-01-01_00:56:27 | 4.6 |
| 2015-01-01_00:56:28 | 4.6 |
| 2015-01-01_00:56:29 | 4.6 |
| 2015-01-01_00:56:30 | 4.7 |
| 2015-01-01_00:56:31 | 4.8 |
| 2015-01-01_00:56:32 | 4.9 |
| 2015-01-01_00:56:33 | 5 |
| 2015-01-01_00:56:34 | 5 |
| 2015-01-01_00:56:35 | 5.2 |
| 2015-01-01_00:56:36 | 5.3 |
| 2015-01-01_00:56:37 | 5.4 |
| 2015-01-01_00:56:38 | 5.4 |
| 2015-01-01_00:56:39 | 5.4 |
| 2015-01-01_00:56:40 | 4 |
| 2015-01-01_00:56:41 | 4.4 |
| 2015-01-01_00:56:42 | 4.3 |
| 2015-01-01_00:56:43 | 4.3 |
| 2015-01-01_00:56:44 | 4.1 |
| 2015-01-01_00:56:45 | 4 |
| 2015-01-01_00:56:46 | 4 |
| 2015-01-01_00:56:47 | 4 |
| 2015-01-01_00:56:48 | 4 |
| 2015-01-01_00:56:49 | 4 |
| 2015-01-01_00:56:50 | 4 |
| 2015-01-01_00:56:51 | 4.1 |
| 2015-01-01_00:56:52 | 4 |
| 2015-01-01_00:56:53 | 3.9 |
| 2015-01-01_00:56:54 | 3.9 |
| 2015-01-01_00:56:55 | 3.9 |
| 2015-01-01_00:56:56 | 3.9 |
| 2015-01-01_00:56:57 | 4 |
| 2015-01-01_00:56:58 | 4 |
| 2015-01-01_00:56:59 | 4 |
| 2015-01-01_00:57:00 | 3.9 |
| 2015-01-01_00:57:01 | 3.9 |
| 2015-01-01_00:57:02 | 3.9 |
| 2015-01-01_00:57:03 | 3.9 |
| 2015-01-01_00:57:04 | 4 |
| 2015-01-01_00:57:05 | 4 |
| 2015-01-01_00:57:06 | 3.9 |
| 2015-01-01_00:57:07 | 3.9 |
| 2015-01-01_00:57:08 | 3.8 |
| 2015-01-01_00:57:09 | 3.6 |
| 2015-01-01_00:57:10 | 3.7 |
| 2015-01-01_00:57:11 | 3.7 |
| 2015-01-01_00:57:12 | 3.6 |
| 2015-01-01_00:57:13 | 3.7 |
| 2015-01-01_00:57:14 | 3.6 |
| 2015-01-01_00:57:15 | 3.6 |
| 2015-01-01_00:57:16 | 3.6 |
| 2015-01-01_00:57:17 | 3.7 |
| 2015-01-01_00:57:18 | 3.6 |
| 2015-01-01_00:57:19 | 3.5 |
| 2015-01-01_00:57:20 | 3.5 |
| 2015-01-01_00:57:21 | 3.4 |
| 2015-01-01_00:57:22 | 3.3 |
| 2015-01-01_00:57:23 | 3.2 |
| 2015-01-01_00:57:24 | 3.1 |
| 2015-01-01_00:57:25 | 3 |
| 2015-01-01_00:57:26 | 2.9 |
| 2015-01-01_00:57:27 | 2.8 |
| 2015-01-01_00:57:28 | 2.8 |
| 2015-01-01_00:57:29 | 2.7 |
| 2015-01-01_00:57:30 | 2.6 |
| 2015-01-01_00:57:31 | 3.5 |
| 2015-01-01_00:57:32 | 3.5 |
| 2015-01-01_00:57:33 | 3.6 |
| 2015-01-01_00:57:34 | 3.8 |
| 2015-01-01_00:57:35 | 3.8 |
| 2015-01-01_00:57:36 | 4 |
| 2015-01-01_00:57:37 | 3.9 |
| 2015-01-01_00:57:38 | 3.9 |
| 2015-01-01_00:57:39 | 4 |
| 2015-01-01_00:57:40 | 3.9 |
| 2015-01-01_00:57:41 | 4 |
| 2015-01-01_00:57:42 | 3.9 |
| 2015-01-01_00:57:43 | 3.9 |
| 2015-01-01_00:57:44 | 3.8 |
| 2015-01-01_00:57:45 | 3.9 |
| 2015-01-01_00:57:46 | 3.9 |
| 2015-01-01_00:57:47 | 4 |
| 2015-01-01_00:57:48 | 4.1 |
| 2015-01-01_00:57:49 | 4.1 |
| 2015-01-01_00:57:50 | 4.1 |
| 2015-01-01_00:57:51 | 4.2 |
| 2015-01-01_00:57:52 | 4.2 |
| 2015-01-01_00:57:53 | 5.1 |
| 2015-01-01_00:57:54 | 5.2 |
| 2015-01-01_00:57:55 | 5.2 |
| 2015-01-01_00:57:56 | 5.1 |
| 2015-01-01_00:57:57 | 5 |
| 2015-01-01_00:57:58 | 5 |
| 2015-01-01_00:57:59 | 5.1 |
| 2015-01-01_00:58:00 | 5.1 |
| 2015-01-01_00:58:01 | 5.4 |
| 2015-01-01_00:58:02 | 5.9 |
| 2015-01-01_00:58:03 | 6.1 |
| 2015-01-01_00:58:04 | 5.2 |
| 2015-01-01_00:58:05 | 5.1 |
| 2015-01-01_00:58:06 | 5.3 |
| 2015-01-01_00:58:07 | 5.5 |
| 2015-01-01_00:58:08 | 5.5 |
| 2015-01-01_00:58:09 | 5.5 |
| 2015-01-01_00:58:10 | 5.4 |
| 2015-01-01_00:58:11 | 5.3 |
| 2015-01-01_00:58:12 | 5.2 |
| 2015-01-01_00:58:13 | 5.4 |
| 2015-01-01_00:58:14 | 5.7 |
| 2015-01-01_00:58:15 | 5.4 |
| 2015-01-01_00:58:16 | 5.1 |
| 2015-01-01_00:58:17 | 4.8 |
| 2015-01-01_00:58:18 | 2.8 |
| 2015-01-01_00:58:19 | 4.9 |
| 2015-01-01_00:58:20 | 5.6 |
| 2015-01-01_00:58:21 | 5.8 |
| 2015-01-01_00:58:22 | 5.9 |
| 2015-01-01_00:58:23 | 6 |
| 2015-01-01_00:58:24 | 6.3 |
| 2015-01-01_00:58:25 | 6.4 |
| 2015-01-01_00:58:26 | 6.4 |
| 2015-01-01_00:58:27 | 6.2 |
| 2015-01-01_00:58:28 | 6.1 |
| 2015-01-01_00:58:29 | 6.3 |
| 2015-01-01_00:58:30 | 6.4 |
| 2015-01-01_00:58:31 | 6.4 |
| 2015-01-01_00:58:32 | 6.3 |
| 2015-01-01_00:58:33 | 6.3 |
| 2015-01-01_00:58:34 | 6.2 |
| 2015-01-01_00:58:35 | 6.2 |
| 2015-01-01_00:58:36 | 6.1 |
| 2015-01-01_00:58:37 | 6 |
| 2015-01-01_00:58:38 | 5.9 |
| 2015-01-01_00:58:39 | 5.8 |
| 2015-01-01_00:58:40 | 5.7 |
| 2015-01-01_00:58:41 | 5.6 |
| 2015-01-01_00:58:42 | 5.6 |
| 2015-01-01_00:58:43 | 5.5 |
| 2015-01-01_00:58:44 | 5.5 |
| 2015-01-01_00:58:45 | 5.5 |
| 2015-01-01_00:58:46 | 5.5 |
| 2015-01-01_00:58:47 | 5.4 |
| 2015-01-01_00:58:48 | 5.3 |
| 2015-01-01_00:58:49 | 5.2 |
| 2015-01-01_00:58:50 | 4.9 |
| 2015-01-01_00:58:51 | 4.6 |
| 2015-01-01_00:58:52 | 4.3 |
| 2015-01-01_00:58:53 | 4.2 |
| 2015-01-01_00:58:54 | 4.1 |
| 2015-01-01_00:58:55 | 4 |
| 2015-01-01_00:58:56 | 3.8 |
| 2015-01-01_00:58:57 | 3.8 |
| 2015-01-01_00:58:58 | 2.5 |
| 2015-01-01_00:58:59 | 4.8 |
| 2015-01-01_00:59:00 | 4.7 |
| 2015-01-01_00:59:01 | 4.7 |
| 2015-01-01_00:59:02 | 4.8 |
| 2015-01-01_00:59:03 | 4.7 |
| 2015-01-01_00:59:04 | 4.6 |
| 2015-01-01_00:59:05 | 4.5 |
| 2015-01-01_00:59:06 | 4.4 |
| 2015-01-01_00:59:07 | 4.3 |
| 2015-01-01_00:59:08 | 4.1 |
| 2015-01-01_00:59:09 | 4 |
| 2015-01-01_00:59:10 | 3.8 |
| 2015-01-01_00:59:11 | 3.7 |
| 2015-01-01_00:59:12 | 3.7 |
| 2015-01-01_00:59:13 | 3.7 |
| 2015-01-01_00:59:14 | 3.6 |
| 2015-01-01_00:59:15 | 4 |
| 2015-01-01_00:59:16 | 4.1 |
| 2015-01-01_00:59:17 | 4.3 |
| 2015-01-01_00:59:18 | 4.5 |
| 2015-01-01_00:59:19 | 4.8 |
| 2015-01-01_00:59:20 | 5.3 |
| 2015-01-01_00:59:21 | 5.7 |
| 2015-01-01_00:59:22 | 6 |
| 2015-01-01_00:59:23 | 6 |
| 2015-01-01_00:59:24 | 6 |
| 2015-01-01_00:59:25 | 6.1 |
| 2015-01-01_00:59:26 | 6.1 |
| 2015-01-01_00:59:27 | 4.7 |
| 2015-01-01_00:59:28 | 5.2 |
| 2015-01-01_00:59:29 | 5.3 |
| 2015-01-01_00:59:30 | 5.5 |
| 2015-01-01_00:59:31 | 5.7 |
| 2015-01-01_00:59:32 | 5.8 |
| 2015-01-01_00:59:33 | 5.8 |
| 2015-01-01_00:59:34 | 5.8 |
| 2015-01-01_00:59:35 | 5.8 |
| 2015-01-01_00:59:36 | 5.8 |
| 2015-01-01_00:59:37 | 5.7 |
| 2015-01-01_00:59:38 | 5.8 |
| 2015-01-01_00:59:39 | 5.7 |
| 2015-01-01_00:59:40 | 5.9 |
| 2015-01-01_00:59:41 | 6.1 |
| 2015-01-01_00:59:42 | 6.2 |
| 2015-01-01_00:59:43 | 6.3 |
| 2015-01-01_00:59:44 | 6.4 |
| 2015-01-01_00:59:45 | 5.7 |
| 2015-01-01_00:59:46 | 5.7 |
| 2015-01-01_00:59:47 | 5.7 |
| 2015-01-01_00:59:48 | 5.6 |
| 2015-01-01_00:59:49 | 5.6 |
| 2015-01-01_00:59:50 | 5.5 |
| 2015-01-01_00:59:51 | 5.6 |
| 2015-01-01_00:59:52 | 5.6 |
| 2015-01-01_00:59:53 | 5.6 |
| 2015-01-01_00:59:54 | 5.6 |
| 2015-01-01_00:59:55 | 5.6 |
| 2015-01-01_00:59:56 | 5.6 |
| 2015-01-01_00:59:57 | 5.5 |
| 2015-01-01_00:59:58 | 5.5 |
| 2015-01-01_00:59:59 | 5.5 |
| 2015-01-01_01:00:01 | 5.5 |
| 2015-01-01_01:00:02 | 5.5 |
| 2015-01-01_01:00:03 | 5.5 |
| 2015-01-01_01:00:04 | 5.5 |
| 2015-01-01_01:00:05 | 5.5 |
| 2015-01-01_01:00:06 | 5.5 |
| 2015-01-01_01:00:07 | 5.5 |
| 2015-01-01_01:00:08 | 5.5 |
| 2015-01-01_01:00:09 | 5.4 |
| 2015-01-01_01:00:10 | 5.5 |
| 2015-01-01_01:00:11 | 5.5 |
| 2015-01-01_01:00:12 | 5.5 |
| 2015-01-01_01:00:13 | 5.5 |
| 2015-01-01_01:00:14 | 5.4 |
| 2015-01-01_01:00:15 | 5.4 |
| 2015-01-01_01:00:16 | 5.4 |
| 2015-01-01_01:00:17 | 5.3 |
| 2015-01-01_01:00:18 | 5.3 |
| 2015-01-01_01:00:19 | 5.3 |
| 2015-01-01_01:00:20 | 5.2 |
| 2015-01-01_01:00:21 | 5.1 |
| 2015-01-01_01:00:22 | 5.1 |
| 2015-01-01_01:00:23 | 5.1 |
| 2015-01-01_01:00:24 | 5 |
| 2015-01-01_01:00:25 | 5 |
| 2015-01-01_01:00:26 | 4.9 |
| 2015-01-01_01:00:27 | 4.9 |
| 2015-01-01_01:00:28 | 4.9 |
| 2015-01-01_01:00:29 | 4.9 |
| 2015-01-01_01:00:30 | 4.8 |
| 2015-01-01_01:00:31 | 4.8 |
| 2015-01-01_01:00:32 | 4.8 |
| 2015-01-01_01:00:33 | 4.9 |
| 2015-01-01_01:00:34 | 5 |
| 2015-01-01_01:00:35 | 5.1 |
| 2015-01-01_01:00:36 | 5 |
| 2015-01-01_01:00:37 | 4.9 |
| 2015-01-01_01:00:38 | 5 |
| 2015-01-01_01:00:39 | 5.1 |
| 2015-01-01_01:00:40 | 5.2 |
| 2015-01-01_01:00:41 | 5.3 |
| 2015-01-01_01:00:42 | 5.2 |
| 2015-01-01_01:00:43 | 5.1 |
| 2015-01-01_01:00:44 | 5 |
| 2015-01-01_01:00:45 | 4.9 |
| 2015-01-01_01:00:46 | 4.8 |
| 2015-01-01_01:00:47 | 4.7 |
| 2015-01-01_01:00:48 | 4.7 |
| 2015-01-01_01:00:49 | 4.6 |
| 2015-01-01_01:00:50 | 4.5 |
| 2015-01-01_01:00:51 | 4.4 |
| 2015-01-01_01:00:52 | 4.3 |
| 2015-01-01_01:00:53 | 5.2 |
| 2015-01-01_01:00:54 | 5.2 |
| 2015-01-01_01:00:55 | 5.5 |
| 2015-01-01_01:00:56 | 5.8 |
| 2015-01-01_01:00:57 | 6 |
| 2015-01-01_01:00:58 | 6.2 |
| 2015-01-01_01:00:59 | 6.3 |
| 2015-01-01_01:01:00 | 6.3 |
| 2015-01-01_01:01:01 | 6.2 |
| 2015-01-01_01:01:02 | 5.4 |
| 2015-01-01_01:01:03 | 5.3 |
| 2015-01-01_01:01:04 | 5.3 |
| 2015-01-01_01:01:05 | 5.3 |
| 2015-01-01_01:01:06 | 5.3 |
| 2015-01-01_01:01:07 | 5.4 |
| 2015-01-01_01:01:08 | 5.4 |
| 2015-01-01_01:01:09 | 5.4 |
| 2015-01-01_01:01:10 | 5.5 |
| 2015-01-01_01:01:11 | 5.5 |
| 2015-01-01_01:01:12 | 5.5 |
| 2015-01-01_01:01:13 | 5.5 |
| 2015-01-01_01:01:14 | 5.5 |
| 2015-01-01_01:01:15 | 5.6 |
| 2015-01-01_01:01:16 | 5.6 |
| 2015-01-01_01:01:17 | 5.5 |
| 2015-01-01_01:01:18 | 5.5 |
| 2015-01-01_01:01:19 | 5.6 |
| 2015-01-01_01:01:20 | 5.6 |
| 2015-01-01_01:01:21 | 5.6 |
| 2015-01-01_01:01:22 | 5.5 |
| 2015-01-01_01:01:23 | 5.6 |
| 2015-01-01_01:01:24 | 5.5 |
| 2015-01-01_01:01:25 | 5.6 |
| 2015-01-01_01:01:26 | 5.5 |
| 2015-01-01_01:01:27 | 5.6 |
| 2015-01-01_01:01:28 | 5.5 |
| 2015-01-01_01:01:29 | 5.5 |
| 2015-01-01_01:01:30 | 5.5 |
| 2015-01-01_01:01:31 | 5.6 |
| 2015-01-01_01:01:32 | 5.6 |
| 2015-01-01_01:01:33 | 5.6 |
| 2015-01-01_01:01:34 | 5.6 |
| 2015-01-01_01:01:35 | 5.6 |
| 2015-01-01_01:01:36 | 5.6 |
| 2015-01-01_01:01:37 | 5.5 |
| 2015-01-01_01:01:38 | 5.5 |
| 2015-01-01_01:01:39 | 5.5 |
| 2015-01-01_01:01:40 | 5.5 |
| 2015-01-01_01:01:41 | 5.5 |
| 2015-01-01_01:01:42 | 5.5 |
| 2015-01-01_01:01:43 | 5.5 |
| 2015-01-01_01:01:44 | 5.5 |
| 2015-01-01_01:01:45 | 5.5 |
| 2015-01-01_01:01:46 | 5.5 |
| 2015-01-01_01:01:47 | 5.5 |
| 2015-01-01_01:01:48 | 5.5 |
| 2015-01-01_01:01:49 | 5.4 |
| 2015-01-01_01:01:50 | 5.4 |
| 2015-01-01_01:01:51 | 5.4 |
| 2015-01-01_01:01:52 | 5.4 |
| 2015-01-01_01:01:53 | 5.4 |
| 2015-01-01_01:01:54 | 5.5 |
| 2015-01-01_01:01:55 | 5.5 |
| 2015-01-01_01:01:56 | 5.5 |
| 2015-01-01_01:01:57 | 5.5 |
| 2015-01-01_01:01:58 | 5.5 |
| 2015-01-01_01:01:59 | 5.5 |
| 2015-01-01_01:02:00 | 5.5 |
| 2015-01-01_01:02:01 | 5.5 |
| 2015-01-01_01:02:02 | 5.5 |
| 2015-01-01_01:02:03 | 5.6 |
| 2015-01-01_01:02:04 | 5.6 |
| 2015-01-01_01:02:05 | 5.6 |
| 2015-01-01_01:02:06 | 5.6 |
| 2015-01-01_01:02:07 | 5.6 |
| 2015-01-01_01:02:08 | 5.6 |
| 2015-01-01_01:02:09 | 5.6 |
| 2015-01-01_01:02:10 | 5.5 |
| 2015-01-01_01:02:11 | 5.5 |
| 2015-01-01_01:02:12 | 5.4 |
| 2015-01-01_01:02:13 | 5.3 |
| 2015-01-01_01:02:14 | 5.2 |
| 2015-01-01_01:02:15 | 5.1 |
| 2015-01-01_01:02:16 | 5.3 |
| 2015-01-01_01:02:17 | 5.4 |
| 2015-01-01_01:02:18 | 5.5 |
| 2015-01-01_01:02:19 | 5.5 |
| 2015-01-01_01:02:20 | 5.5 |
| 2015-01-01_01:02:21 | 5.5 |
| 2015-01-01_01:02:22 | 5.5 |
| 2015-01-01_01:02:23 | 5.5 |
| 2015-01-01_01:02:24 | 5.5 |
| 2015-01-01_01:02:25 | 5.5 |
| 2015-01-01_01:02:26 | 5.5 |
| 2015-01-01_01:02:27 | 5.5 |
| 2015-01-01_01:02:28 | 5.5 |
| 2015-01-01_01:02:29 | 5.5 |
| 2015-01-01_01:02:30 | 5.4 |
| 2015-01-01_01:02:31 | 5.3 |
| 2015-01-01_01:02:32 | 5.3 |
| 2015-01-01_01:02:33 | 5.3 |
| 2015-01-01_01:02:34 | 5.2 |
| 2015-01-01_01:02:35 | 5.1 |
| 2015-01-01_01:02:36 | 5.2 |
| 2015-01-01_01:02:37 | 5.3 |
| 2015-01-01_01:02:38 | 5.5 |
| 2015-01-01_01:02:39 | 5.5 |
| 2015-01-01_01:02:40 | 5.6 |
| 2015-01-01_01:02:41 | 5.5 |
| 2015-01-01_01:02:42 | 5.6 |
| 2015-01-01_01:02:43 | 5.6 |
| 2015-01-01_01:02:44 | 5.6 |
| 2015-01-01_01:02:45 | 5.6 |
| 2015-01-01_01:02:46 | 5.6 |
| 2015-01-01_01:02:47 | 5.6 |
| 2015-01-01_01:02:48 | 5.7 |
| 2015-01-01_01:02:49 | 5.7 |
| 2015-01-01_01:02:50 | 5.7 |
| 2015-01-01_01:02:51 | 5.6 |
| 2015-01-01_01:02:52 | 5.6 |
| 2015-01-01_01:02:53 | 5.5 |
| 2015-01-01_01:02:54 | 5.5 |
| 2015-01-01_01:02:55 | 5.6 |
| 2015-01-01_01:02:56 | 5.6 |
| 2015-01-01_01:02:57 | 5.6 |
| 2015-01-01_01:02:58 | 5.6 |
| 2015-01-01_01:02:59 | 5.7 |
| 2015-01-01_01:03:00 | 5.8 |
| 2015-01-01_01:03:01 | 5.8 |
| 2015-01-01_01:03:02 | 5.8 |
| 2015-01-01_01:03:03 | 5.9 |
| 2015-01-01_01:03:04 | 5.9 |
| 2015-01-01_01:03:05 | 5.7 |
| 2015-01-01_01:03:06 | 5.8 |
| 2015-01-01_01:03:07 | 5.9 |
| 2015-01-01_01:03:08 | 5.8 |
| 2015-01-01_01:03:09 | 5.8 |
| 2015-01-01_01:03:10 | 5.8 |
| 2015-01-01_01:03:11 | 5.8 |
| 2015-01-01_01:03:12 | 5.8 |
| 2015-01-01_01:03:13 | 5.9 |
| 2015-01-01_01:03:14 | 6 |
| 2015-01-01_01:03:15 | 6 |
| 2015-01-01_01:03:16 | 6.1 |
| 2015-01-01_01:03:17 | 6.2 |
| 2015-01-01_01:03:18 | 6.3 |
| 2015-01-01_01:03:19 | 6.3 |
| 2015-01-01_01:03:20 | 6.4 |
| 2015-01-01_01:03:21 | 6.4 |
| 2015-01-01_01:03:22 | 6.4 |
| 2015-01-01_01:03:23 | 6.4 |
| 2015-01-01_01:03:24 | 6.4 |
| 2015-01-01_01:03:25 | 6.3 |
| 2015-01-01_01:03:26 | 6.3 |
| 2015-01-01_01:03:27 | 6.3 |
| 2015-01-01_01:03:28 | 6.3 |
| 2015-01-01_01:03:29 | 6.3 |
| 2015-01-01_01:03:30 | 6.3 |
| 2015-01-01_01:03:31 | 6.2 |
| 2015-01-01_01:03:32 | 6.2 |
| 2015-01-01_01:03:33 | 6.2 |
| 2015-01-01_01:03:34 | 6.1 |
| 2015-01-01_01:03:35 | 6.1 |
| 2015-01-01_01:03:36 | 6.1 |
| 2015-01-01_01:03:37 | 6 |
| 2015-01-01_01:03:38 | 5.9 |
| 2015-01-01_01:03:39 | 5.5 |
| 2015-01-01_01:03:40 | 4.9 |
| 2015-01-01_01:03:41 | 4.5 |
| 2015-01-01_01:03:42 | 3.9 |
| 2015-01-01_01:03:43 | 3.7 |
| 2015-01-01_01:03:44 | 3.7 |
| 2015-01-01_01:03:45 | 3.7 |
| 2015-01-01_01:03:46 | 4 |
| 2015-01-01_01:03:47 | 4.2 |
| 2015-01-01_01:03:48 | 4.4 |
| 2015-01-01_01:03:49 | 4.4 |
| 2015-01-01_01:03:50 | 4.4 |
| 2015-01-01_01:03:51 | 4.4 |
| 2015-01-01_01:03:52 | 4.3 |
| 2015-01-01_01:03:53 | 4.3 |
| 2015-01-01_01:03:54 | 4.2 |
| 2015-01-01_01:03:55 | 4 |
| 2015-01-01_01:03:56 | 3.8 |
| 2015-01-01_01:03:57 | 3.7 |
| 2015-01-01_01:03:58 | 3.4 |
| 2015-01-01_01:03:59 | 4.7 |
| 2015-01-01_01:04:00 | 4.7 |
| 2015-01-01_01:04:01 | 4.6 |
| 2015-01-01_01:04:02 | 4.7 |
| 2015-01-01_01:04:03 | 4.7 |
| 2015-01-01_01:04:04 | 4.7 |
| 2015-01-01_01:04:05 | 4.7 |
| 2015-01-01_01:04:06 | 4.7 |
| 2015-01-01_01:04:07 | 4.6 |
| 2015-01-01_01:04:08 | 4.5 |
| 2015-01-01_01:04:09 | 4.4 |
| 2015-01-01_01:04:10 | 4.3 |
| 2015-01-01_01:04:11 | 4.2 |
| 2015-01-01_01:04:12 | 4.2 |
| 2015-01-01_01:04:13 | 4.2 |
| 2015-01-01_01:04:14 | 4.2 |
| 2015-01-01_01:04:15 | 4.1 |
| 2015-01-01_01:04:16 | 4 |
| 2015-01-01_01:04:17 | 4.2 |
| 2015-01-01_01:04:18 | 4.3 |
| 2015-01-01_01:04:19 | 4.5 |
| 2015-01-01_01:04:20 | 4.6 |
| 2015-01-01_01:04:21 | 4.6 |
| 2015-01-01_01:04:22 | 4.7 |
| 2015-01-01_01:04:23 | 4.7 |
| 2015-01-01_01:04:24 | 4.7 |
| 2015-01-01_01:04:25 | 4.7 |
| 2015-01-01_01:04:26 | 4.7 |
| 2015-01-01_01:04:27 | 4.7 |
| 2015-01-01_01:04:28 | 4.7 |
| 2015-01-01_01:04:29 | 4.7 |
| 2015-01-01_01:04:30 | 4.7 |
| 2015-01-01_01:04:31 | 4.7 |
| 2015-01-01_01:04:32 | 4.6 |
| 2015-01-01_01:04:33 | 4.6 |
| 2015-01-01_01:04:34 | 4.5 |
| 2015-01-01_01:04:35 | 4.5 |
| 2015-01-01_01:04:36 | 4.5 |
| 2015-01-01_01:04:37 | 4.5 |
| 2015-01-01_01:04:38 | 4.5 |
| 2015-01-01_01:04:39 | 4.5 |
| 2015-01-01_01:04:40 | 4.5 |
| 2015-01-01_01:04:41 | 4.5 |
| 2015-01-01_01:04:42 | 4.6 |
| 2015-01-01_01:04:43 | 4.6 |
| 2015-01-01_01:04:44 | 4.6 |
| 2015-01-01_01:04:45 | 4.6 |
| 2015-01-01_01:04:46 | 4.6 |
| 2015-01-01_01:04:47 | 4.7 |
| 2015-01-01_01:04:48 | 4.9 |
| 2015-01-01_01:04:49 | 4.9 |
| 2015-01-01_01:04:50 | 4.9 |
| 2015-01-01_01:04:51 | 5 |
| 2015-01-01_01:04:52 | 4.9 |
| 2015-01-01_01:04:53 | 4.9 |
| 2015-01-01_01:04:54 | 4.8 |
| 2015-01-01_01:04:55 | 4.7 |
| 2015-01-01_01:04:56 | 4.7 |
| 2015-01-01_01:04:57 | 4.5 |
| 2015-01-01_01:04:58 | 4.5 |
| 2015-01-01_01:04:59 | 4.5 |
| 2015-01-01_01:05:00 | 4.6 |
| 2015-01-01_01:05:01 | 4.5 |
| 2015-01-01_01:05:02 | 4.7 |
| 2015-01-01_01:05:03 | 4.7 |
| 2015-01-01_01:05:04 | 4.2 |
| 2015-01-01_01:05:05 | 5.7 |
| 2015-01-01_01:05:06 | 5.7 |
| 2015-01-01_01:05:07 | 5.8 |
| 2015-01-01_01:05:08 | 5.8 |
| 2015-01-01_01:05:09 | 5.8 |
| 2015-01-01_01:05:10 | 5.8 |
| 2015-01-01_01:05:11 | 5.8 |
| 2015-01-01_01:05:12 | 5.8 |
| 2015-01-01_01:05:13 | 5.9 |
| 2015-01-01_01:05:14 | 5.9 |
| 2015-01-01_01:05:15 | 6.2 |
| 2015-01-01_01:05:16 | 6.3 |
| 2015-01-01_01:05:17 | 6.4 |
| 2015-01-01_01:05:18 | 6.4 |
| 2015-01-01_01:05:19 | 6.3 |
| 2015-01-01_01:05:20 | 6 |
| 2015-01-01_01:05:21 | 5.5 |
| 2015-01-01_01:05:22 | 5.1 |
| 2015-01-01_01:05:23 | 4.7 |
| 2015-01-01_01:05:24 | 4.6 |
| 2015-01-01_01:05:25 | 4.5 |
| 2015-01-01_01:05:26 | 4.5 |
| 2015-01-01_01:05:27 | 4.6 |
| 2015-01-01_01:05:28 | 4.7 |
| 2015-01-01_01:05:29 | 4.7 |
| 2015-01-01_01:05:30 | 4.7 |
| 2015-01-01_01:05:31 | 4.7 |
| 2015-01-01_01:05:32 | 4.6 |
| 2015-01-01_01:05:33 | 4.5 |
| 2015-01-01_01:05:34 | 4.5 |
| 2015-01-01_01:05:35 | 4.6 |
| 2015-01-01_01:05:36 | 4.7 |
| 2015-01-01_01:05:37 | 4.8 |
| 2015-01-01_01:05:38 | 4.7 |
| 2015-01-01_01:05:39 | 4.7 |
| 2015-01-01_01:05:40 | 4.6 |
| 2015-01-01_01:05:41 | 4.5 |
| 2015-01-01_01:05:42 | 4.5 |
| 2015-01-01_01:05:43 | 4.6 |
| 2015-01-01_01:05:44 | 4.7 |
| 2015-01-01_01:05:45 | 4.7 |
| 2015-01-01_01:05:46 | 4.8 |
| 2015-01-01_01:05:47 | 4.8 |
| 2015-01-01_01:05:48 | 4.7 |
| 2015-01-01_01:05:49 | 4.7 |
| 2015-01-01_01:05:50 | 4.7 |
| 2015-01-01_01:05:51 | 4.7 |
| 2015-01-01_01:05:52 | 4.7 |
| 2015-01-01_01:05:53 | 4.8 |
| 2015-01-01_01:05:54 | 4.7 |
| 2015-01-01_01:05:55 | 4.8 |
| 2015-01-01_01:05:56 | 5 |
| 2015-01-01_01:05:57 | 5.1 |
| 2015-01-01_01:05:58 | 5.3 |
| 2015-01-01_01:05:59 | 5.4 |
| 2015-01-01_01:06:00 | 5.5 |
| 2015-01-01_01:06:01 | 5.4 |
| 2015-01-01_01:06:02 | 5.5 |
| 2015-01-01_01:06:03 | 5.6 |
| 2015-01-01_01:06:04 | 4.4 |
| 2015-01-01_01:06:05 | 4.6 |
| 2015-01-01_01:06:06 | 4.7 |
| 2015-01-01_01:06:07 | 4.8 |
| 2015-01-01_01:06:08 | 4.8 |
| 2015-01-01_01:06:09 | 4.8 |
| 2015-01-01_01:06:10 | 4.8 |
| 2015-01-01_01:06:11 | 4.8 |
| 2015-01-01_01:06:12 | 4.7 |
| 2015-01-01_01:06:13 | 4.7 |
| 2015-01-01_01:06:14 | 4.6 |
| 2015-01-01_01:06:15 | 4.6 |
| 2015-01-01_01:06:16 | 4.4 |
| 2015-01-01_01:06:17 | 4.4 |
| 2015-01-01_01:06:18 | 4.4 |
| 2015-01-01_01:06:19 | 4.5 |
| 2015-01-01_01:06:20 | 4.5 |
| 2015-01-01_01:06:21 | 4.4 |
| 2015-01-01_01:06:22 | 4.4 |
| 2015-01-01_01:06:23 | 4.3 |
| 2015-01-01_01:06:24 | 4.3 |
| 2015-01-01_01:06:25 | 4.3 |
| 2015-01-01_01:06:26 | 4.2 |
| 2015-01-01_01:06:27 | 4.2 |
| 2015-01-01_01:06:28 | 4 |
| 2015-01-01_01:06:29 | 3.8 |
| 2015-01-01_01:06:30 | 3.7 |
| 2015-01-01_01:06:31 | 3.6 |
| 2015-01-01_01:06:32 | 2.7 |
| 2015-01-01_01:06:33 | 4.7 |
| 2015-01-01_01:06:34 | 4.4 |
| 2015-01-01_01:06:35 | 4.4 |
| 2015-01-01_01:06:36 | 4.4 |
| 2015-01-01_01:06:37 | 4.5 |
| 2015-01-01_01:06:38 | 4.5 |
| 2015-01-01_01:06:39 | 4.6 |
| 2015-01-01_01:06:40 | 4.6 |
| 2015-01-01_01:06:41 | 4.5 |
| 2015-01-01_01:06:42 | 4.3 |
| 2015-01-01_01:06:43 | 4.2 |
| 2015-01-01_01:06:44 | 3.8 |
| 2015-01-01_01:06:45 | 3.6 |
| 2015-01-01_01:06:46 | 3 |
| 2015-01-01_01:06:47 | 2.5 |
| 2015-01-01_01:06:48 | 2.4 |
| 2015-01-01_01:06:49 | 2.4 |
| 2015-01-01_01:06:50 | 2.4 |
| 2015-01-01_01:06:51 | 2.3 |
| 2015-01-01_01:06:52 | 2.3 |
| 2015-01-01_01:06:53 | 2.4 |
| 2015-01-01_01:06:54 | 2.3 |
| 2015-01-01_01:06:55 | 2.3 |
| 2015-01-01_01:06:56 | 2.3 |
| 2015-01-01_01:06:57 | 2.3 |
| 2015-01-01_01:06:58 | 2.3 |
| 2015-01-01_01:06:59 | 2.3 |
| 2015-01-01_01:07:00 | 2.3 |
| 2015-01-01_01:07:01 | 2.3 |
| 2015-01-01_01:07:02 | 2.3 |
| 2015-01-01_01:07:03 | 2.3 |
| 2015-01-01_01:07:04 | 2.3 |
| 2015-01-01_01:07:05 | 2.3 |
| 2015-01-01_01:07:06 | 2.9 |
| 2015-01-01_01:07:07 | 2.9 |
| 2015-01-01_01:07:08 | 3.5 |
| 2015-01-01_01:07:09 | 4.1 |
| 2015-01-01_01:07:10 | 2.3 |
| 2015-01-01_01:07:11 | 2.1 |
| 2015-01-01_01:07:12 | 2.4 |
| 2015-01-01_01:07:13 | 2.4 |
| 2015-01-01_01:07:14 | 2.3 |
| 2015-01-01_01:07:15 | 2.2 |
| 2015-01-01_01:07:16 | 2.2 |
| 2015-01-01_01:07:17 | 2.3 |
| 2015-01-01_01:07:18 | 2.3 |
| 2015-01-01_01:07:19 | 2.2 |
| 2015-01-01_01:07:20 | 2.2 |
| 2015-01-01_01:07:21 | 2.8 |
| 2015-01-01_01:07:22 | 2.8 |
| 2015-01-01_01:07:23 | 3.2 |
| 2015-01-01_01:07:24 | 3.2 |
| 2015-01-01_01:07:25 | 3.1 |
| 2015-01-01_01:07:26 | 3.1 |
| 2015-01-01_01:07:27 | 3.6 |
| 2015-01-01_01:07:28 | 3.9 |
| 2015-01-01_01:07:29 | 4.3 |
| 2015-01-01_01:07:30 | 4.6 |
| 2015-01-01_01:07:31 | 4.3 |
| 2015-01-01_01:07:32 | 4.2 |
| 2015-01-01_01:07:33 | 3.9 |
| 2015-01-01_01:07:34 | 3.7 |
| 2015-01-01_01:07:35 | 4 |
| 2015-01-01_01:07:36 | 5.1 |
| 2015-01-01_01:07:37 | 6.2 |
| 2015-01-01_01:07:38 | 5.4 |
| 2015-01-01_01:07:39 | 4.6 |
| 2015-01-01_01:07:40 | 4.9 |
| 2015-01-01_01:07:41 | 5 |
| 2015-01-01_01:07:42 | 5.3 |
| 2015-01-01_01:07:43 | 5.7 |
| 2015-01-01_01:07:44 | 5.8 |
| 2015-01-01_01:07:45 | 4.8 |
| 2015-01-01_01:07:46 | 4.8 |
| 2015-01-01_01:07:47 | 5.1 |
| 2015-01-01_01:07:48 | 5.5 |
| 2015-01-01_01:07:49 | 5.6 |
| 2015-01-01_01:07:50 | 5.5 |
| 2015-01-01_01:07:51 | 5.4 |
| 2015-01-01_01:07:52 | 5.3 |
| 2015-01-01_01:07:53 | 5.3 |
| 2015-01-01_01:07:54 | 5.5 |
| 2015-01-01_01:07:55 | 5.8 |
| 2015-01-01_01:07:56 | 5.9 |
| 2015-01-01_01:07:57 | 6.1 |
| 2015-01-01_01:07:58 | 6.3 |
| 2015-01-01_01:07:59 | 6.3 |
| 2015-01-01_01:08:00 | 6.3 |
| 2015-01-01_01:08:01 | 6.2 |
| 2015-01-01_01:08:02 | 6.2 |
| 2015-01-01_01:08:03 | 6.2 |
| 2015-01-01_01:08:04 | 6.3 |
| 2015-01-01_01:08:05 | 6.3 |
| 2015-01-01_01:08:06 | 6.2 |
| 2015-01-01_01:08:07 | 5.5 |
| 2015-01-01_01:08:08 | 5.5 |
| 2015-01-01_01:08:09 | 5.5 |
| 2015-01-01_01:08:10 | 5.7 |
| 2015-01-01_01:08:11 | 6 |
| 2015-01-01_01:08:12 | 6.2 |
| 2015-01-01_01:08:13 | 6.3 |
| 2015-01-01_01:08:14 | 6.4 |
| 2015-01-01_01:08:15 | 6.4 |
| 2015-01-01_01:08:16 | 6.4 |
| 2015-01-01_01:08:17 | 6.4 |
| 2015-01-01_01:08:18 | 6.4 |
| 2015-01-01_01:08:19 | 6.4 |
| 2015-01-01_01:08:20 | 6.3 |
| 2015-01-01_01:08:21 | 6.4 |
| 2015-01-01_01:08:22 | 6.4 |
| 2015-01-01_01:08:23 | 6.3 |
| 2015-01-01_01:08:24 | 6.2 |
| 2015-01-01_01:08:25 | 6.2 |
| 2015-01-01_01:08:26 | 6.2 |
| 2015-01-01_01:08:27 | 6.2 |
| 2015-01-01_01:08:28 | 6.1 |
| 2015-01-01_01:08:29 | 6.1 |
| 2015-01-01_01:08:30 | 6.1 |
| 2015-01-01_01:08:31 | 6.1 |
| 2015-01-01_01:08:32 | 6.1 |
| 2015-01-01_01:08:33 | 6 |
| 2015-01-01_01:08:34 | 5.9 |
| 2015-01-01_01:08:35 | 5.8 |
| 2015-01-01_01:08:36 | 5.6 |
| 2015-01-01_01:08:37 | 5.5 |
| 2015-01-01_01:08:38 | 5.4 |
| 2015-01-01_01:08:39 | 5.1 |
| 2015-01-01_01:08:40 | 4.7 |
| 2015-01-01_01:08:41 | 4.3 |
| 2015-01-01_01:08:42 | 4.1 |
| 2015-01-01_01:08:43 | 3.6 |
| 2015-01-01_01:08:44 | 3.4 |
| 2015-01-01_01:08:45 | 4.6 |
| 2015-01-01_01:08:46 | 4.6 |
| 2015-01-01_01:08:47 | 4.6 |
| 2015-01-01_01:08:48 | 4.8 |
| 2015-01-01_01:08:49 | 4.9 |
| 2015-01-01_01:08:50 | 5.1 |
| 2015-01-01_01:08:51 | 5.3 |
| 2015-01-01_01:08:52 | 5.4 |
| 2015-01-01_01:08:53 | 5.4 |
| 2015-01-01_01:08:54 | 5.4 |
| 2015-01-01_01:08:55 | 5.3 |
| 2015-01-01_01:08:56 | 5.4 |
| 2015-01-01_01:08:57 | 5.4 |
| 2015-01-01_01:08:58 | 5.6 |
| 2015-01-01_01:08:59 | 5.6 |
| 2015-01-01_01:09:00 | 5.7 |
| 2015-01-01_01:09:01 | 5.7 |
| 2015-01-01_01:09:02 | 5.8 |
| 2015-01-01_01:09:03 | 5.9 |
| 2015-01-01_01:09:04 | 6.2 |
| 2015-01-01_01:09:05 | 6.3 |
| 2015-01-01_01:09:06 | 6.4 |
| 2015-01-01_01:09:07 | 5.8 |
| 2015-01-01_01:09:08 | 5.7 |
| 2015-01-01_01:09:09 | 5.6 |
| 2015-01-01_01:09:10 | 5.5 |
| 2015-01-01_01:09:11 | 5.2 |
| 2015-01-01_01:09:12 | 4.9 |
| 2015-01-01_01:09:13 | 4.9 |
| 2015-01-01_01:09:14 | 4.9 |
| 2015-01-01_01:09:15 | 4.3 |
| 2015-01-01_01:09:16 | 5.9 |
| 2015-01-01_01:09:17 | 5.9 |
| 2015-01-01_01:09:18 | 5.8 |
| 2015-01-01_01:09:19 | 5.7 |
| 2015-01-01_01:09:20 | 5.7 |
| 2015-01-01_01:09:21 | 5.7 |
| 2015-01-01_01:09:22 | 5.7 |
| 2015-01-01_01:09:23 | 5.8 |
| 2015-01-01_01:09:24 | 5.8 |
| 2015-01-01_01:09:25 | 5.9 |
| 2015-01-01_01:09:26 | 6 |
| 2015-01-01_01:09:27 | 5.9 |
| 2015-01-01_01:09:28 | 5.9 |
| 2015-01-01_01:09:29 | 5.7 |
| 2015-01-01_01:09:30 | 5.6 |
| 2015-01-01_01:09:31 | 5.4 |
| 2015-01-01_01:09:32 | 5.2 |
| 2015-01-01_01:09:33 | 5.2 |
| 2015-01-01_01:09:34 | 5.1 |
| 2015-01-01_01:09:35 | 5.1 |
| 2015-01-01_01:09:36 | 5.1 |
| 2015-01-01_01:09:37 | 5 |
| 2015-01-01_01:09:38 | 4.9 |
| 2015-01-01_01:09:39 | 4.9 |
| 2015-01-01_01:09:40 | 4.8 |
| 2015-01-01_01:09:41 | 4.8 |
| 2015-01-01_01:09:42 | 4.9 |
| 2015-01-01_01:09:43 | 4.9 |
| 2015-01-01_01:09:44 | 5.1 |
| 2015-01-01_01:09:45 | 5.1 |
| 2015-01-01_01:09:46 | 5.3 |
| 2015-01-01_01:09:47 | 5.3 |
| 2015-01-01_01:09:48 | 5.4 |
| 2015-01-01_01:09:49 | 5.5 |
| 2015-01-01_01:09:50 | 5.5 |
| 2015-01-01_01:09:51 | 5.4 |
| 2015-01-01_01:09:52 | 5.4 |
| 2015-01-01_01:09:53 | 5.4 |
| 2015-01-01_01:09:54 | 5.4 |
| 2015-01-01_01:09:55 | 5.4 |
| 2015-01-01_01:09:56 | 5.4 |
| 2015-01-01_01:09:57 | 5.4 |
| 2015-01-01_01:09:58 | 5.4 |
| 2015-01-01_01:09:59 | 5.3 |
| 2015-01-01_01:10:00 | 5.3 |
| 2015-01-01_01:10:01 | 5.3 |
| 2015-01-01_01:10:02 | 5.5 |
| 2015-01-01_01:10:03 | 5.7 |
| 2015-01-01_01:10:04 | 5.6 |
| 2015-01-01_01:10:05 | 5.9 |
| 2015-01-01_01:10:06 | 6 |
| 2015-01-01_01:10:07 | 5.9 |
| 2015-01-01_01:10:08 | 5.8 |
| 2015-01-01_01:10:09 | 5.6 |
| 2015-01-01_01:10:10 | 5.5 |
| 2015-01-01_01:10:11 | 5.5 |
| 2015-01-01_01:10:12 | 5.5 |
| 2015-01-01_01:10:13 | 5.5 |
| 2015-01-01_01:10:14 | 5.5 |
| 2015-01-01_01:10:15 | 5.5 |
| 2015-01-01_01:10:16 | 5.6 |
| 2015-01-01_01:10:17 | 5.6 |
| 2015-01-01_01:10:18 | 5.9 |
| 2015-01-01_01:10:19 | 6.1 |
| 2015-01-01_01:10:20 | 6.3 |
| 2015-01-01_01:10:21 | 6.4 |
| 2015-01-01_01:10:22 | 6.4 |
| 2015-01-01_01:10:23 | 6.4 |
| 2015-01-01_01:10:24 | 6.3 |
| 2015-01-01_01:10:25 | 6 |
| 2015-01-01_01:10:26 | 5.6 |
| 2015-01-01_01:10:27 | 5.4 |
| 2015-01-01_01:10:28 | 5.4 |
| 2015-01-01_01:10:29 | 5.4 |
| 2015-01-01_01:10:30 | 5.5 |
| 2015-01-01_01:10:31 | 5.5 |
| 2015-01-01_01:10:32 | 5.5 |
| 2015-01-01_01:10:33 | 5.5 |
| 2015-01-01_01:10:34 | 5.8 |
| 2015-01-01_01:10:35 | 6.2 |
| 2015-01-01_01:10:36 | 6.3 |
| 2015-01-01_01:10:37 | 6.3 |
| 2015-01-01_01:10:38 | 6.4 |
| 2015-01-01_01:10:39 | 6.4 |
| 2015-01-01_01:10:40 | 6.4 |
| 2015-01-01_01:10:41 | 6.5 |
| 2015-01-01_01:10:42 | 6.4 |
| 2015-01-01_01:10:43 | 6.3 |
| 2015-01-01_01:10:44 | 5.9 |
| 2015-01-01_01:10:45 | 5.6 |
| 2015-01-01_01:10:46 | 5.5 |
| 2015-01-01_01:10:47 | 5.6 |
| 2015-01-01_01:10:48 | 5.8 |
| 2015-01-01_01:10:49 | 5.9 |
| 2015-01-01_01:10:50 | 5.9 |
| 2015-01-01_01:10:51 | 6.2 |
| 2015-01-01_01:10:52 | 6.4 |
| 2015-01-01_01:10:53 | 6.4 |
| 2015-01-01_01:10:54 | 6.4 |
| 2015-01-01_01:10:55 | 6.4 |
| 2015-01-01_01:10:56 | 6.4 |
| 2015-01-01_01:10:57 | 6.3 |
| 2015-01-01_01:10:58 | 6.4 |
| 2015-01-01_01:10:59 | 6.4 |
| 2015-01-01_01:11:00 | 6 |
| 2015-01-01_01:11:01 | 6 |
| 2015-01-01_01:11:02 | 6.1 |
| 2015-01-01_01:11:03 | 6.1 |
| 2015-01-01_01:11:04 | 6 |
| 2015-01-01_01:11:05 | 5.9 |
| 2015-01-01_01:11:06 | 5.8 |
| 2015-01-01_01:11:07 | 5.8 |
| 2015-01-01_01:11:08 | 5.6 |
| 2015-01-01_01:11:09 | 5.6 |
| 2015-01-01_01:11:10 | 5.5 |
| 2015-01-01_01:11:11 | 5.4 |
| 2015-01-01_01:11:12 | 5.3 |
| 2015-01-01_01:11:13 | 5.3 |
| 2015-01-01_01:11:14 | 5.2 |
| 2015-01-01_01:11:15 | 5.1 |
| 2015-01-01_01:11:16 | 5 |
| 2015-01-01_01:11:17 | 5 |
| 2015-01-01_01:11:18 | 5 |
| 2015-01-01_01:11:19 | 5 |
| 2015-01-01_01:11:20 | 5 |
| 2015-01-01_01:11:21 | 4.9 |
| 2015-01-01_01:11:22 | 4.9 |
| 2015-01-01_01:11:23 | 4.9 |
| 2015-01-01_01:11:24 | 4.9 |
| 2015-01-01_01:11:25 | 4.9 |
| 2015-01-01_01:11:26 | 4.9 |
| 2015-01-01_01:11:27 | 4.9 |
| 2015-01-01_01:11:28 | 5 |
| 2015-01-01_01:11:29 | 4.9 |
| 2015-01-01_01:11:30 | 4.9 |
| 2015-01-01_01:11:31 | 5 |
| 2015-01-01_01:11:32 | 5 |
| 2015-01-01_01:11:33 | 4.9 |
| 2015-01-01_01:11:34 | 4.9 |
| 2015-01-01_01:11:35 | 4.9 |
| 2015-01-01_01:11:36 | 4.8 |
| 2015-01-01_01:11:37 | 4.8 |
| 2015-01-01_01:11:38 | 4.8 |
| 2015-01-01_01:11:39 | 4.8 |
| 2015-01-01_01:11:40 | 4.7 |
| 2015-01-01_01:11:41 | 4.7 |
| 2015-01-01_01:11:42 | 4.6 |
| 2015-01-01_01:11:43 | 4.6 |
| 2015-01-01_01:11:44 | 4.6 |
| 2015-01-01_01:11:45 | 4.6 |
| 2015-01-01_01:11:46 | 4.7 |
| 2015-01-01_01:11:47 | 4.8 |
| 2015-01-01_01:11:48 | 4.9 |
| 2015-01-01_01:11:49 | 4.8 |
| 2015-01-01_01:11:50 | 4.9 |
| 2015-01-01_01:11:51 | 4.9 |
| 2015-01-01_01:11:52 | 4.9 |
| 2015-01-01_01:11:53 | 5 |
| 2015-01-01_01:11:54 | 5 |
| 2015-01-01_01:11:55 | 4.9 |
| 2015-01-01_01:11:56 | 4.9 |
| 2015-01-01_01:11:57 | 4.9 |
| 2015-01-01_01:11:58 | 4.9 |
| 2015-01-01_01:11:59 | 4.8 |
| 2015-01-01_01:12:00 | 4.8 |
| 2015-01-01_01:12:01 | 4.7 |
| 2015-01-01_01:12:02 | 4.7 |
| 2015-01-01_01:12:03 | 4.7 |
| 2015-01-01_01:12:04 | 4.7 |
| 2015-01-01_01:12:05 | 4.6 |
| 2015-01-01_01:12:06 | 4.7 |
| 2015-01-01_01:12:07 | 4.7 |
| 2015-01-01_01:12:08 | 4.7 |
| 2015-01-01_01:12:09 | 4.7 |
| 2015-01-01_01:12:10 | 4.7 |
| 2015-01-01_01:12:11 | 4.7 |
| 2015-01-01_01:12:12 | 4.6 |
| 2015-01-01_01:12:13 | 4.5 |
| 2015-01-01_01:12:14 | 4.5 |
| 2015-01-01_01:12:15 | 4.5 |
| 2015-01-01_01:12:16 | 4.5 |
| 2015-01-01_01:12:17 | 4.4 |
| 2015-01-01_01:12:18 | 4.3 |
| 2015-01-01_01:12:19 | 3.3 |
| 2015-01-01_01:12:20 | 5.1 |
| 2015-01-01_01:12:21 | 5 |
| 2015-01-01_01:12:22 | 4.8 |
| 2015-01-01_01:12:23 | 4.8 |
| 2015-01-01_01:12:24 | 4.7 |
| 2015-01-01_01:12:25 | 4.6 |
| 2015-01-01_01:12:26 | 4.6 |
| 2015-01-01_01:12:27 | 4.6 |
| 2015-01-01_01:12:28 | 4.6 |
| 2015-01-01_01:12:29 | 4.7 |
| 2015-01-01_01:12:30 | 4.7 |
| 2015-01-01_01:12:31 | 4.8 |
| 2015-01-01_01:12:32 | 4.9 |
| 2015-01-01_01:12:33 | 4.9 |
| 2015-01-01_01:12:34 | 5 |
| 2015-01-01_01:12:35 | 5 |
| 2015-01-01_01:12:36 | 5.1 |
| 2015-01-01_01:12:37 | 5.1 |
| 2015-01-01_01:12:38 | 5 |
| 2015-01-01_01:12:39 | 5 |
| 2015-01-01_01:12:40 | 4.9 |
| 2015-01-01_01:12:41 | 5 |
| 2015-01-01_01:12:42 | 5.1 |
| 2015-01-01_01:12:43 | 5.2 |
| 2015-01-01_01:12:44 | 5.2 |
| 2015-01-01_01:12:45 | 5.1 |
| 2015-01-01_01:12:46 | 5 |
| 2015-01-01_01:12:47 | 5 |
| 2015-01-01_01:12:48 | 5 |
| 2015-01-01_01:12:49 | 4.9 |
| 2015-01-01_01:12:50 | 4.7 |
| 2015-01-01_01:12:51 | 4.7 |
| 2015-01-01_01:12:52 | 4.7 |
| 2015-01-01_01:12:53 | 4.8 |
| 2015-01-01_01:12:54 | 4.9 |
| 2015-01-01_01:12:55 | 5 |
| 2015-01-01_01:12:56 | 5 |
| 2015-01-01_01:12:57 | 5 |
| 2015-01-01_01:12:58 | 5 |
| 2015-01-01_01:12:59 | 5 |
| 2015-01-01_01:13:00 | 5 |
| 2015-01-01_01:13:01 | 5.1 |
| 2015-01-01_01:13:02 | 5.2 |
| 2015-01-01_01:13:03 | 5.2 |
| 2015-01-01_01:13:04 | 5.2 |
| 2015-01-01_01:13:05 | 5.2 |
| 2015-01-01_01:13:06 | 5.2 |
| 2015-01-01_01:13:07 | 5.2 |
| 2015-01-01_01:13:08 | 5.2 |
| 2015-01-01_01:13:09 | 5.1 |
| 2015-01-01_01:13:10 | 5.1 |
| 2015-01-01_01:13:11 | 5 |
| 2015-01-01_01:13:12 | 5 |
| 2015-01-01_01:13:13 | 4.9 |
| 2015-01-01_01:13:14 | 5 |
| 2015-01-01_01:13:15 | 5 |
| 2015-01-01_01:13:16 | 5 |
| 2015-01-01_01:13:17 | 5.1 |
| 2015-01-01_01:13:18 | 5.1 |
| 2015-01-01_01:13:19 | 5.2 |
| 2015-01-01_01:13:20 | 5.2 |
| 2015-01-01_01:13:21 | 5.2 |
| 2015-01-01_01:13:22 | 5.2 |
| 2015-01-01_01:13:23 | 5.1 |
| 2015-01-01_01:13:24 | 5 |
| 2015-01-01_01:13:25 | 4.9 |
| 2015-01-01_01:13:26 | 4.7 |
| 2015-01-01_01:13:27 | 4.7 |
| 2015-01-01_01:13:28 | 4.6 |
| 2015-01-01_01:13:29 | 4.5 |
| 2015-01-01_01:13:30 | 4.4 |
| 2015-01-01_01:13:31 | 4.3 |
| 2015-01-01_01:13:32 | 3.3 |
| 2015-01-01_01:13:33 | 5.2 |
| 2015-01-01_01:13:34 | 5.2 |
| 2015-01-01_01:13:35 | 5.3 |
| 2015-01-01_01:13:36 | 5.4 |
| 2015-01-01_01:13:37 | 5.3 |
| 2015-01-01_01:13:38 | 5.3 |
| 2015-01-01_01:13:39 | 5.4 |
| 2015-01-01_01:13:40 | 5.5 |
| 2015-01-01_01:13:41 | 5.6 |
| 2015-01-01_01:13:42 | 5.6 |
| 2015-01-01_01:13:43 | 5.8 |
| 2015-01-01_01:13:44 | 6.2 |
| 2015-01-01_01:13:45 | 6.4 |
| 2015-01-01_01:13:46 | 6.4 |
| 2015-01-01_01:13:47 | 5.5 |
| 2015-01-01_01:13:48 | 5.7 |
| 2015-01-01_01:13:49 | 5.7 |
| 2015-01-01_01:13:50 | 5.8 |
| 2015-01-01_01:13:51 | 5.8 |
| 2015-01-01_01:13:52 | 5.9 |
| 2015-01-01_01:13:53 | 5.9 |
| 2015-01-01_01:13:54 | 5.9 |
| 2015-01-01_01:13:55 | 6 |
| 2015-01-01_01:13:56 | 6.1 |
| 2015-01-01_01:13:57 | 6.1 |
| 2015-01-01_01:13:58 | 6.1 |
| 2015-01-01_01:13:59 | 6.1 |
| 2015-01-01_01:14:00 | 6.1 |
| 2015-01-01_01:14:01 | 6.1 |
| 2015-01-01_01:14:02 | 6 |
| 2015-01-01_01:14:03 | 5.9 |
| 2015-01-01_01:14:04 | 6 |
| 2015-01-01_01:14:05 | 6 |
| 2015-01-01_01:14:06 | 6 |
| 2015-01-01_01:14:07 | 6 |
| 2015-01-01_01:14:08 | 6 |
| 2015-01-01_01:14:09 | 6.1 |
| 2015-01-01_01:14:10 | 6.1 |
| 2015-01-01_01:14:11 | 6.1 |
| 2015-01-01_01:14:12 | 6.1 |
| 2015-01-01_01:14:13 | 6.1 |
| 2015-01-01_01:14:14 | 5.5 |
| 2015-01-01_01:14:15 | 5.1 |
| 2015-01-01_01:14:16 | 5.9 |
| 2015-01-01_01:14:17 | 5.9 |
| 2015-01-01_01:14:18 | 6 |
| 2015-01-01_01:14:19 | 6.1 |
| 2015-01-01_01:14:20 | 5 |
| 2015-01-01_01:14:21 | 5 |
| 2015-01-01_01:14:22 | 5 |
| 2015-01-01_01:14:23 | 5 |
| 2015-01-01_01:14:24 | 5 |
| 2015-01-01_01:14:25 | 5 |
| 2015-01-01_01:14:26 | 5.1 |
| 2015-01-01_01:14:27 | 5.1 |
| 2015-01-01_01:14:28 | 5.1 |
| 2015-01-01_01:14:29 | 5.1 |
| 2015-01-01_01:14:30 | 5 |
| 2015-01-01_01:14:31 | 5 |
| 2015-01-01_01:14:32 | 5 |
| 2015-01-01_01:14:33 | 5 |
| 2015-01-01_01:14:34 | 4.9 |
| 2015-01-01_01:14:35 | 5 |
| 2015-01-01_01:14:36 | 5.1 |
| 2015-01-01_01:14:37 | 5.1 |
| 2015-01-01_01:14:38 | 5.2 |
| 2015-01-01_01:14:39 | 5.3 |
| 2015-01-01_01:14:40 | 5.4 |
| 2015-01-01_01:14:41 | 5.4 |
| 2015-01-01_01:14:42 | 5.5 |
| 2015-01-01_01:14:43 | 5.5 |
| 2015-01-01_01:14:44 | 5.5 |
| 2015-01-01_01:14:45 | 5.5 |
| 2015-01-01_01:14:46 | 5.5 |
| 2015-01-01_01:14:47 | 5.6 |
| 2015-01-01_01:14:48 | 5.6 |
| 2015-01-01_01:14:49 | 5.6 |
| 2015-01-01_01:14:50 | 5.6 |
| 2015-01-01_01:14:51 | 5.6 |
| 2015-01-01_01:14:52 | 5.6 |
| 2015-01-01_01:14:53 | 5.5 |
| 2015-01-01_01:14:54 | 5.5 |
| 2015-01-01_01:14:55 | 5.4 |
| 2015-01-01_01:14:56 | 5.5 |
| 2015-01-01_01:14:57 | 5.6 |
| 2015-01-01_01:14:58 | 5.6 |
| 2015-01-01_01:14:59 | 5.6 |
| 2015-01-01_01:15:00 | 5.6 |
| 2015-01-01_01:15:01 | 5.6 |
| 2015-01-01_01:15:02 | 5.6 |
| 2015-01-01_01:15:03 | 5.6 |
| 2015-01-01_01:15:04 | 5.6 |
| 2015-01-01_01:15:05 | 5.7 |
| 2015-01-01_01:15:06 | 5.7 |
| 2015-01-01_01:15:07 | 5.7 |
| 2015-01-01_01:15:08 | 5.7 |
| 2015-01-01_01:15:09 | 5.8 |
| 2015-01-01_01:15:10 | 5.8 |
| 2015-01-01_01:15:11 | 5.7 |
| 2015-01-01_01:15:12 | 5.7 |
| 2015-01-01_01:15:13 | 5.8 |
| 2015-01-01_01:15:14 | 5.8 |
| 2015-01-01_01:15:15 | 5.8 |
| 2015-01-01_01:15:16 | 5.7 |
| 2015-01-01_01:15:17 | 5.7 |
| 2015-01-01_01:15:18 | 5.8 |
| 2015-01-01_01:15:19 | 5.7 |
| 2015-01-01_01:15:20 | 5.7 |
| 2015-01-01_01:15:21 | 5.7 |
| 2015-01-01_01:15:22 | 5.7 |
| 2015-01-01_01:15:23 | 5.8 |
| 2015-01-01_01:15:24 | 5.8 |
| 2015-01-01_01:15:25 | 5.7 |
| 2015-01-01_01:15:26 | 5.8 |
| 2015-01-01_01:15:27 | 5.8 |
| 2015-01-01_01:15:28 | 5.8 |
| 2015-01-01_01:15:29 | 5.8 |
| 2015-01-01_01:15:30 | 5.8 |
| 2015-01-01_01:15:31 | 5.8 |
| 2015-01-01_01:15:32 | 5.9 |
| 2015-01-01_01:15:33 | 5.8 |
| 2015-01-01_01:15:34 | 5.8 |
| 2015-01-01_01:15:35 | 5.8 |
| 2015-01-01_01:15:36 | 5.8 |
| 2015-01-01_01:15:37 | 5.7 |
| 2015-01-01_01:15:38 | 5.7 |
| 2015-01-01_01:15:39 | 5.6 |
| 2015-01-01_01:15:40 | 5.5 |
| 2015-01-01_01:15:41 | 5.5 |
| 2015-01-01_01:15:42 | 5.4 |
| 2015-01-01_01:15:43 | 5.3 |
| 2015-01-01_01:15:44 | 5.2 |
| 2015-01-01_01:15:45 | 5.2 |
| 2015-01-01_01:15:46 | 5.2 |
| 2015-01-01_01:15:47 | 5.2 |
| 2015-01-01_01:15:48 | 5.2 |
| 2015-01-01_01:15:49 | 5.1 |
| 2015-01-01_01:15:50 | 5 |
| 2015-01-01_01:15:51 | 5 |
| 2015-01-01_01:15:52 | 5 |
| 2015-01-01_01:15:53 | 5 |
| 2015-01-01_01:15:54 | 5 |
| 2015-01-01_01:15:55 | 5.2 |
| 2015-01-01_01:15:56 | 5.3 |
| 2015-01-01_01:15:57 | 5.3 |
| 2015-01-01_01:15:58 | 5.4 |
| 2015-01-01_01:15:59 | 5.4 |
| 2015-01-01_01:16:00 | 5.3 |
| 2015-01-01_01:16:01 | 5.3 |
| 2015-01-01_01:16:02 | 5.2 |
| 2015-01-01_01:16:03 | 5 |
| 2015-01-01_01:16:04 | 4.7 |
| 2015-01-01_01:16:05 | 4.1 |
| 2015-01-01_01:16:06 | 4 |
| 2015-01-01_01:16:07 | 3.7 |
| 2015-01-01_01:16:08 | 3.6 |
| 2015-01-01_01:16:09 | 2.5 |
| 2015-01-01_01:16:10 | 4.6 |
| 2015-01-01_01:16:11 | 4.6 |
| 2015-01-01_01:16:12 | 4.5 |
| 2015-01-01_01:16:13 | 4.4 |
| 2015-01-01_01:16:14 | 4.3 |
| 2015-01-01_01:16:15 | 4.2 |
| 2015-01-01_01:16:16 | 4.2 |
| 2015-01-01_01:16:17 | 4.1 |
| 2015-01-01_01:16:18 | 4 |
| 2015-01-01_01:16:19 | 4 |
| 2015-01-01_01:16:20 | 4 |
| 2015-01-01_01:16:21 | 4.2 |
| 2015-01-01_01:16:22 | 4.2 |
| 2015-01-01_01:16:23 | 4.4 |
| 2015-01-01_01:16:24 | 4.5 |
| 2015-01-01_01:16:25 | 4.6 |
| 2015-01-01_01:16:26 | 4.6 |
| 2015-01-01_01:16:27 | 4.6 |
| 2015-01-01_01:16:28 | 4.5 |
| 2015-01-01_01:16:29 | 4.4 |
| 2015-01-01_01:16:30 | 4.2 |
| 2015-01-01_01:16:31 | 5.4 |
| 2015-01-01_01:16:32 | 5.3 |
| 2015-01-01_01:16:33 | 5.3 |
| 2015-01-01_01:16:34 | 5.3 |
| 2015-01-01_01:16:35 | 5.3 |
| 2015-01-01_01:16:36 | 5.3 |
| 2015-01-01_01:16:37 | 5.3 |
| 2015-01-01_01:16:38 | 5.3 |
| 2015-01-01_01:16:39 | 5.3 |
| 2015-01-01_01:16:40 | 5.2 |
| 2015-01-01_01:16:41 | 5.2 |
| 2015-01-01_01:16:42 | 5.3 |
| 2015-01-01_01:16:43 | 5.4 |
| 2015-01-01_01:16:44 | 5.5 |
| 2015-01-01_01:16:45 | 5.8 |
| 2015-01-01_01:16:46 | 6.2 |
| 2015-01-01_01:16:47 | 6.4 |
| 2015-01-01_01:16:48 | 6.5 |
| 2015-01-01_01:16:49 | 6.4 |
| 2015-01-01_01:16:50 | 6.3 |
| 2015-01-01_01:16:51 | 6.3 |
| 2015-01-01_01:16:52 | 6.1 |
| 2015-01-01_01:16:53 | 5.6 |
| 2015-01-01_01:16:54 | 5.7 |
| 2015-01-01_01:16:55 | 5.7 |
| 2015-01-01_01:16:56 | 5.6 |
| 2015-01-01_01:16:57 | 5.5 |
| 2015-01-01_01:16:58 | 5.5 |
| 2015-01-01_01:16:59 | 5.6 |
| 2015-01-01_01:17:00 | 5.6 |
| 2015-01-01_01:17:01 | 5.5 |
| 2015-01-01_01:17:02 | 5.5 |
| 2015-01-01_01:17:03 | 5.5 |
| 2015-01-01_01:17:04 | 5.5 |
| 2015-01-01_01:17:05 | 5.5 |
| 2015-01-01_01:17:06 | 5.6 |
| 2015-01-01_01:17:07 | 5.5 |
| 2015-01-01_01:17:08 | 5.5 |
| 2015-01-01_01:17:09 | 5.5 |
| 2015-01-01_01:17:10 | 5.5 |
| 2015-01-01_01:17:11 | 5.4 |
| 2015-01-01_01:17:12 | 5.4 |
| 2015-01-01_01:17:13 | 5.3 |
| 2015-01-01_01:17:14 | 5.2 |
| 2015-01-01_01:17:15 | 5.2 |
| 2015-01-01_01:17:16 | 5.2 |
| 2015-01-01_01:17:17 | 5.2 |
| 2015-01-01_01:17:18 | 5.2 |
| 2015-01-01_01:17:19 | 5.2 |
| 2015-01-01_01:17:20 | 5.4 |
| 2015-01-01_01:17:21 | 5.4 |
| 2015-01-01_01:17:22 | 5.5 |
| 2015-01-01_01:17:23 | 5.6 |
| 2015-01-01_01:17:24 | 5.7 |
| 2015-01-01_01:17:25 | 5.7 |
| 2015-01-01_01:17:26 | 5.7 |
| 2015-01-01_01:17:27 | 5.6 |
| 2015-01-01_01:17:28 | 5.5 |
| 2015-01-01_01:17:29 | 5.4 |
| 2015-01-01_01:17:30 | 5.3 |
| 2015-01-01_01:17:31 | 5.2 |
| 2015-01-01_01:17:32 | 5.2 |
| 2015-01-01_01:17:33 | 5.1 |
| 2015-01-01_01:17:34 | 5.1 |
| 2015-01-01_01:17:35 | 5 |
| 2015-01-01_01:17:36 | 5 |
| 2015-01-01_01:17:37 | 4.9 |
| 2015-01-01_01:17:38 | 4.9 |
| 2015-01-01_01:17:39 | 4.8 |
| 2015-01-01_01:17:40 | 4.7 |
| 2015-01-01_01:17:41 | 4.6 |
| 2015-01-01_01:17:42 | 4.3 |
| 2015-01-01_01:17:43 | 4.1 |
| 2015-01-01_01:17:44 | 3.7 |
| 2015-01-01_01:17:45 | 2.7 |
| 2015-01-01_01:17:46 | 4.8 |
| 2015-01-01_01:17:47 | 4.7 |
| 2015-01-01_01:17:48 | 4.8 |
| 2015-01-01_01:17:49 | 4.8 |
| 2015-01-01_01:17:50 | 4.9 |
| 2015-01-01_01:17:51 | 5.1 |
| 2015-01-01_01:17:52 | 5.1 |
| 2015-01-01_01:17:53 | 5.2 |
| 2015-01-01_01:17:54 | 5.2 |
| 2015-01-01_01:17:55 | 5.1 |
| 2015-01-01_01:17:56 | 5.1 |
| 2015-01-01_01:17:57 | 5 |
| 2015-01-01_01:17:58 | 4.9 |
| 2015-01-01_01:17:59 | 4.9 |
| 2015-01-01_01:18:00 | 4.8 |
| 2015-01-01_01:18:01 | 4.8 |
| 2015-01-01_01:18:02 | 4.7 |
| 2015-01-01_01:18:03 | 4.8 |
| 2015-01-01_01:18:04 | 5.1 |
| 2015-01-01_01:18:05 | 5.5 |
| 2015-01-01_01:18:06 | 5.7 |
| 2015-01-01_01:18:07 | 5.9 |
| 2015-01-01_01:18:08 | 6.1 |
| 2015-01-01_01:18:09 | 4.9 |
| 2015-01-01_01:18:10 | 5.1 |
| 2015-01-01_01:18:11 | 5.2 |
| 2015-01-01_01:18:12 | 5.3 |
| 2015-01-01_01:18:13 | 5.3 |
| 2015-01-01_01:18:14 | 5.2 |
| 2015-01-01_01:18:15 | 5.2 |
| 2015-01-01_01:18:16 | 5.2 |
| 2015-01-01_01:18:17 | 5.2 |
| 2015-01-01_01:18:18 | 5.1 |
| 2015-01-01_01:18:19 | 5 |
| 2015-01-01_01:18:20 | 4.9 |
| 2015-01-01_01:18:21 | 4.8 |
| 2015-01-01_01:18:22 | 4.8 |
| 2015-01-01_01:18:23 | 4.7 |
| 2015-01-01_01:18:24 | 4.6 |
| 2015-01-01_01:18:25 | 4.5 |
| 2015-01-01_01:18:26 | 4.5 |
| 2015-01-01_01:18:27 | 4.4 |
| 2015-01-01_01:18:28 | 4.4 |
| 2015-01-01_01:18:29 | 4.4 |
| 2015-01-01_01:18:30 | 4.8 |
| 2015-01-01_01:18:31 | 5.3 |
| 2015-01-01_01:18:32 | 5.3 |
| 2015-01-01_01:18:33 | 5.3 |
| 2015-01-01_01:18:34 | 5.2 |
| 2015-01-01_01:18:35 | 5.3 |
| 2015-01-01_01:18:36 | 5.3 |
| 2015-01-01_01:18:37 | 5.3 |
| 2015-01-01_01:18:38 | 5.3 |
| 2015-01-01_01:18:39 | 5.3 |
| 2015-01-01_01:18:40 | 5.3 |
| 2015-01-01_01:18:41 | 5.3 |
| 2015-01-01_01:18:42 | 5.4 |
| 2015-01-01_01:18:43 | 5.4 |
| 2015-01-01_01:18:44 | 5.4 |
| 2015-01-01_01:18:45 | 5.4 |
| 2015-01-01_01:18:46 | 5.3 |
| 2015-01-01_01:18:47 | 5.3 |
| 2015-01-01_01:18:48 | 5.3 |
| 2015-01-01_01:18:49 | 5.3 |
| 2015-01-01_01:18:50 | 5.2 |
| 2015-01-01_01:18:51 | 5.2 |
| 2015-01-01_01:18:52 | 5.1 |
| 2015-01-01_01:18:53 | 5.1 |
| 2015-01-01_01:18:54 | 5.2 |
| 2015-01-01_01:18:55 | 5.2 |
| 2015-01-01_01:18:56 | 5.2 |
| 2015-01-01_01:18:57 | 5.2 |
| 2015-01-01_01:18:58 | 5.1 |
| 2015-01-01_01:18:59 | 5.2 |
| 2015-01-01_01:19:00 | 5.1 |
| 2015-01-01_01:19:01 | 5.1 |
| 2015-01-01_01:19:02 | 5 |
| 2015-01-01_01:19:03 | 5 |
| 2015-01-01_01:19:04 | 5 |
| 2015-01-01_01:19:05 | 5 |
| 2015-01-01_01:19:06 | 5 |
| 2015-01-01_01:19:07 | 5 |
| 2015-01-01_01:19:08 | 5.1 |
| 2015-01-01_01:19:09 | 5.1 |
| 2015-01-01_01:19:10 | 5.1 |
| 2015-01-01_01:19:11 | 5 |
| 2015-01-01_01:19:12 | 5 |
| 2015-01-01_01:19:13 | 5 |
| 2015-01-01_01:19:14 | 5.1 |
| 2015-01-01_01:19:15 | 5.1 |
| 2015-01-01_01:19:16 | 5.1 |
| 2015-01-01_01:19:17 | 5.1 |
| 2015-01-01_01:19:18 | 5.1 |
| 2015-01-01_01:19:19 | 5.2 |
| 2015-01-01_01:19:20 | 5.5 |
| 2015-01-01_01:19:21 | 5.6 |
| 2015-01-01_01:19:22 | 5.5 |
| 2015-01-01_01:19:23 | 5.6 |
| 2015-01-01_01:19:24 | 5.6 |
| 2015-01-01_01:19:25 | 5.6 |
| 2015-01-01_01:19:26 | 5.6 |
| 2015-01-01_01:19:27 | 5.8 |
| 2015-01-01_01:19:28 | 6 |
| 2015-01-01_01:19:29 | 6.2 |
| 2015-01-01_01:19:30 | 6.3 |
| 2015-01-01_01:19:31 | 6.4 |
| 2015-01-01_01:19:32 | 6.4 |
| 2015-01-01_01:19:33 | 6.5 |
| 2015-01-01_01:19:34 | 6.5 |
| 2015-01-01_01:19:35 | 6.4 |
| 2015-01-01_01:19:36 | 6.3 |
| 2015-01-01_01:19:37 | 5.6 |
| 2015-01-01_01:19:38 | 5.6 |
| 2015-01-01_01:19:39 | 5.5 |
| 2015-01-01_01:19:40 | 5.5 |
| 2015-01-01_01:19:41 | 5.5 |
| 2015-01-01_01:19:42 | 5.5 |
| 2015-01-01_01:19:43 | 5.5 |
| 2015-01-01_01:19:44 | 5.6 |
| 2015-01-01_01:19:45 | 5.7 |
| 2015-01-01_01:19:46 | 5.6 |
| 2015-01-01_01:19:47 | 5.5 |
| 2015-01-01_01:19:48 | 5.4 |
| 2015-01-01_01:19:49 | 5.4 |
| 2015-01-01_01:19:50 | 5.5 |
| 2015-01-01_01:19:51 | 5.5 |
| 2015-01-01_01:19:52 | 5.5 |
| 2015-01-01_01:19:53 | 5.4 |
| 2015-01-01_01:19:54 | 5.3 |
| 2015-01-01_01:19:55 | 5.3 |
| 2015-01-01_01:19:56 | 5.3 |
| 2015-01-01_01:19:57 | 5.4 |
| 2015-01-01_01:19:58 | 5.5 |
| 2015-01-01_01:19:59 | 5.6 |
| 2015-01-01_01:20:00 | 5.5 |
| 2015-01-01_01:20:01 | 5.6 |
| 2015-01-01_01:20:02 | 5.7 |
| 2015-01-01_01:20:03 | 5.8 |
| 2015-01-01_01:20:04 | 5.9 |
| 2015-01-01_01:20:05 | 5.8 |
| 2015-01-01_01:20:06 | 5.8 |
| 2015-01-01_01:20:07 | 5.8 |
| 2015-01-01_01:20:08 | 5.9 |
| 2015-01-01_01:20:09 | 5.9 |
| 2015-01-01_01:20:10 | 5.9 |
| 2015-01-01_01:20:11 | 5.9 |
| 2015-01-01_01:20:12 | 5.8 |
| 2015-01-01_01:20:13 | 5.8 |
| 2015-01-01_01:20:14 | 5.7 |
| 2015-01-01_01:20:15 | 5.6 |
| 2015-01-01_01:20:16 | 5.7 |
| 2015-01-01_01:20:17 | 5.8 |
| 2015-01-01_01:20:18 | 5.8 |
| 2015-01-01_01:20:19 | 5.7 |
| 2015-01-01_01:20:20 | 5.7 |
| 2015-01-01_01:20:21 | 5.7 |
| 2015-01-01_01:20:22 | 5.6 |
| 2015-01-01_01:20:23 | 5.6 |
| 2015-01-01_01:20:24 | 5.7 |
| 2015-01-01_01:20:25 | 5.7 |
| 2015-01-01_01:20:26 | 5.6 |
| 2015-01-01_01:20:27 | 5.7 |
| 2015-01-01_01:20:28 | 5.6 |
| 2015-01-01_01:20:29 | 5.6 |
| 2015-01-01_01:20:30 | 5.5 |
| 2015-01-01_01:20:31 | 5.4 |
| 2015-01-01_01:20:32 | 5.3 |
| 2015-01-01_01:20:33 | 5.4 |
| 2015-01-01_01:20:34 | 5.3 |
| 2015-01-01_01:20:35 | 5.3 |
| 2015-01-01_01:20:36 | 5.2 |
| 2015-01-01_01:20:37 | 5.3 |
| 2015-01-01_01:20:38 | 5.3 |
| 2015-01-01_01:20:39 | 5.3 |
| 2015-01-01_01:20:40 | 5.2 |
| 2015-01-01_01:20:41 | 5.1 |
| 2015-01-01_01:20:42 | 5 |
| 2015-01-01_01:20:43 | 5 |
| 2015-01-01_01:20:44 | 4.9 |
| 2015-01-01_01:20:45 | 4.8 |
| 2015-01-01_01:20:46 | 4.8 |
| 2015-01-01_01:20:47 | 4.7 |
| 2015-01-01_01:20:48 | 4.7 |
| 2015-01-01_01:20:49 | 4.5 |
| 2015-01-01_01:20:50 | 4.5 |
| 2015-01-01_01:20:51 | 4.4 |
| 2015-01-01_01:20:52 | 4.4 |
| 2015-01-01_01:20:53 | 4.4 |
| 2015-01-01_01:20:54 | 4.4 |
| 2015-01-01_01:20:55 | 4.4 |
| 2015-01-01_01:20:56 | 4.4 |
| 2015-01-01_01:20:57 | 4.4 |
| 2015-01-01_01:20:58 | 3.6 |
| 2015-01-01_01:20:59 | 5.2 |
| 2015-01-01_01:21:00 | 5.2 |
| 2015-01-01_01:21:01 | 5.2 |
| 2015-01-01_01:21:02 | 5.1 |
| 2015-01-01_01:21:03 | 5 |
| 2015-01-01_01:21:04 | 4.9 |
| 2015-01-01_01:21:05 | 4.8 |
| 2015-01-01_01:21:06 | 4.8 |
| 2015-01-01_01:21:07 | 4.7 |
| 2015-01-01_01:21:08 | 4.8 |
| 2015-01-01_01:21:09 | 4.8 |
| 2015-01-01_01:21:10 | 4.7 |
| 2015-01-01_01:21:11 | 4.7 |
| 2015-01-01_01:21:12 | 4.7 |
| 2015-01-01_01:21:13 | 4.7 |
| 2015-01-01_01:21:14 | 4.7 |
| 2015-01-01_01:21:15 | 4.7 |
| 2015-01-01_01:21:16 | 4.8 |
| 2015-01-01_01:21:17 | 4.8 |
| 2015-01-01_01:21:18 | 4.8 |
| 2015-01-01_01:21:19 | 4.8 |
| 2015-01-01_01:21:20 | 4.8 |
| 2015-01-01_01:21:21 | 4.8 |
| 2015-01-01_01:21:22 | 4.8 |
| 2015-01-01_01:21:23 | 4.8 |
| 2015-01-01_01:21:24 | 4.8 |
| 2015-01-01_01:21:25 | 4.8 |
| 2015-01-01_01:21:26 | 4.8 |
| 2015-01-01_01:21:27 | 4.8 |
| 2015-01-01_01:21:28 | 4.8 |
| 2015-01-01_01:21:29 | 4.8 |
| 2015-01-01_01:21:30 | 4.8 |
| 2015-01-01_01:21:31 | 4.8 |
| 2015-01-01_01:21:32 | 4.9 |
| 2015-01-01_01:21:33 | 4.9 |
| 2015-01-01_01:21:34 | 4.9 |
| 2015-01-01_01:21:35 | 5.1 |
| 2015-01-01_01:21:36 | 5.2 |
| 2015-01-01_01:21:37 | 5.3 |
| 2015-01-01_01:21:38 | 5.3 |
| 2015-01-01_01:21:39 | 5.4 |
| 2015-01-01_01:21:40 | 5.4 |
| 2015-01-01_01:21:41 | 5.5 |
| 2015-01-01_01:21:42 | 5.6 |
| 2015-01-01_01:21:43 | 5.7 |
| 2015-01-01_01:21:44 | 5.7 |
| 2015-01-01_01:21:45 | 5.7 |
| 2015-01-01_01:21:46 | 5.6 |
| 2015-01-01_01:21:47 | 5.6 |
| 2015-01-01_01:21:48 | 5.4 |
| 2015-01-01_01:21:49 | 4.5 |
| 2015-01-01_01:21:50 | 4.6 |
| 2015-01-01_01:21:51 | 4.6 |
| 2015-01-01_01:21:52 | 4.7 |
| 2015-01-01_01:21:53 | 4.7 |
| 2015-01-01_01:21:54 | 4.7 |
| 2015-01-01_01:21:55 | 4.8 |
| 2015-01-01_01:21:56 | 4.8 |
| 2015-01-01_01:21:57 | 4.8 |
| 2015-01-01_01:21:58 | 4.9 |
| 2015-01-01_01:21:59 | 5 |
| 2015-01-01_01:22:00 | 5 |
| 2015-01-01_01:22:01 | 5 |
| 2015-01-01_01:22:02 | 5 |
| 2015-01-01_01:22:03 | 4.9 |
| 2015-01-01_01:22:04 | 4.9 |
| 2015-01-01_01:22:05 | 4.8 |
| 2015-01-01_01:22:06 | 4.7 |
| 2015-01-01_01:22:07 | 4.7 |
| 2015-01-01_01:22:08 | 4.6 |
| 2015-01-01_01:22:09 | 4.6 |
| 2015-01-01_01:22:10 | 4.6 |
| 2015-01-01_01:22:11 | 4.7 |
| 2015-01-01_01:22:12 | 4.8 |
| 2015-01-01_01:22:13 | 4.8 |
| 2015-01-01_01:22:14 | 4.9 |
| 2015-01-01_01:22:15 | 4.9 |
| 2015-01-01_01:22:16 | 4.9 |
| 2015-01-01_01:22:17 | 4.9 |
| 2015-01-01_01:22:18 | 4.9 |
| 2015-01-01_01:22:19 | 4.8 |
| 2015-01-01_01:22:20 | 4.7 |
| 2015-01-01_01:22:21 | 4.7 |
| 2015-01-01_01:22:22 | 4.6 |
| 2015-01-01_01:22:23 | 4.5 |
| 2015-01-01_01:22:24 | 4.4 |
| 2015-01-01_01:22:25 | 4.3 |
| 2015-01-01_01:22:26 | 4.2 |
| 2015-01-01_01:22:27 | 4.2 |
| 2015-01-01_01:22:28 | 4.1 |
| 2015-01-01_01:22:29 | 4.3 |
| 2015-01-01_01:22:30 | 4.3 |
| 2015-01-01_01:22:31 | 4.3 |
| 2015-01-01_01:22:32 | 4.4 |
| 2015-01-01_01:22:33 | 4.4 |
| 2015-01-01_01:22:34 | 4.4 |
| 2015-01-01_01:22:35 | 4.5 |
| 2015-01-01_01:22:36 | 4.5 |
| 2015-01-01_01:22:37 | 4.5 |
| 2015-01-01_01:22:38 | 4.5 |
| 2015-01-01_01:22:39 | 4.5 |
| 2015-01-01_01:22:40 | 4.5 |
| 2015-01-01_01:22:41 | 4.5 |
| 2015-01-01_01:22:42 | 4.5 |
| 2015-01-01_01:22:43 | 4.4 |
| 2015-01-01_01:22:44 | 4.4 |
| 2015-01-01_01:22:45 | 4.4 |
| 2015-01-01_01:22:46 | 4.3 |
| 2015-01-01_01:22:47 | 4.2 |
| 2015-01-01_01:22:48 | 4.3 |
| 2015-01-01_01:22:49 | 4.3 |
| 2015-01-01_01:22:50 | 4.2 |
| 2015-01-01_01:22:51 | 4.1 |
| 2015-01-01_01:22:52 | 2.9 |
| 2015-01-01_01:22:53 | 3.4 |
| 2015-01-01_01:22:54 | 4.8 |
| 2015-01-01_01:22:55 | 4.7 |
| 2015-01-01_01:22:56 | 4.7 |
| 2015-01-01_01:22:57 | 4.6 |
| 2015-01-01_01:22:58 | 4.5 |
| 2015-01-01_01:22:59 | 4.6 |
| 2015-01-01_01:23:00 | 4.7 |
| 2015-01-01_01:23:01 | 4.8 |
| 2015-01-01_01:23:02 | 4.9 |
| 2015-01-01_01:23:03 | 5 |
| 2015-01-01_01:23:04 | 5 |
| 2015-01-01_01:23:05 | 5.1 |
| 2015-01-01_01:23:06 | 5.1 |
| 2015-01-01_01:23:07 | 5.2 |
| 2015-01-01_01:23:08 | 5.3 |
| 2015-01-01_01:23:09 | 5.2 |
| 2015-01-01_01:23:10 | 5.2 |
| 2015-01-01_01:23:11 | 5.3 |
| 2015-01-01_01:23:12 | 5.4 |
| 2015-01-01_01:23:13 | 5.5 |
| 2015-01-01_01:23:14 | 5.6 |
| 2015-01-01_01:23:15 | 5.7 |
| 2015-01-01_01:23:16 | 5.7 |
| 2015-01-01_01:23:17 | 5.7 |
| 2015-01-01_01:23:18 | 5.4 |
| 2015-01-01_01:23:19 | 4.3 |
| 2015-01-01_01:23:20 | 4.7 |
| 2015-01-01_01:23:21 | 4.7 |
| 2015-01-01_01:23:22 | 4.8 |
| 2015-01-01_01:23:23 | 4.8 |
| 2015-01-01_01:23:24 | 4.8 |
| 2015-01-01_01:23:25 | 4.8 |
| 2015-01-01_01:23:26 | 4.8 |
| 2015-01-01_01:23:27 | 4.8 |
| 2015-01-01_01:23:28 | 4.8 |
| 2015-01-01_01:23:29 | 4.9 |
| 2015-01-01_01:23:30 | 4.9 |
| 2015-01-01_01:23:31 | 4.9 |
| 2015-01-01_01:23:32 | 4.9 |
| 2015-01-01_01:23:33 | 4.9 |
| 2015-01-01_01:23:34 | 4.8 |
| 2015-01-01_01:23:35 | 4.8 |
| 2015-01-01_01:23:36 | 4.8 |
| 2015-01-01_01:23:37 | 4.8 |
| 2015-01-01_01:23:38 | 4.8 |
| 2015-01-01_01:23:39 | 4.8 |
| 2015-01-01_01:23:40 | 4.9 |
| 2015-01-01_01:23:41 | 4.8 |
| 2015-01-01_01:23:42 | 4.8 |
| 2015-01-01_01:23:43 | 4.9 |
| 2015-01-01_01:23:44 | 4.9 |
| 2015-01-01_01:23:45 | 4.8 |
| 2015-01-01_01:23:46 | 4.8 |
| 2015-01-01_01:23:47 | 4.8 |
| 2015-01-01_01:23:48 | 4.7 |
| 2015-01-01_01:23:49 | 4.7 |
| 2015-01-01_01:23:50 | 4.7 |
| 2015-01-01_01:23:51 | 4.7 |
| 2015-01-01_01:23:52 | 4.6 |
| 2015-01-01_01:23:53 | 4.5 |
| 2015-01-01_01:23:54 | 4.4 |
| 2015-01-01_01:23:55 | 4.2 |
| 2015-01-01_01:23:56 | 4.1 |
| 2015-01-01_01:23:57 | 4 |
| 2015-01-01_01:23:58 | 4 |
| 2015-01-01_01:23:59 | 3.9 |
| 2015-01-01_01:24:00 | 3.9 |
| 2015-01-01_01:24:01 | 4 |
| 2015-01-01_01:24:02 | 4 |
| 2015-01-01_01:24:03 | 4 |
| 2015-01-01_01:24:04 | 4 |
| 2015-01-01_01:24:05 | 4 |
| 2015-01-01_01:24:06 | 3.9 |
| 2015-01-01_01:24:07 | 2.8 |
| 2015-01-01_01:24:08 | 2.8 |
| 2015-01-01_01:24:09 | 2.7 |
| 2015-01-01_01:24:10 | 2.7 |
| 2015-01-01_01:24:11 | 2.5 |
| 2015-01-01_01:24:12 | 2.5 |
| 2015-01-01_01:24:13 | 2.5 |
| 2015-01-01_01:24:14 | 2.5 |
| 2015-01-01_01:24:15 | 2.5 |
| 2015-01-01_01:24:16 | 2.5 |
| 2015-01-01_01:24:17 | 2.5 |
| 2015-01-01_01:24:18 | 2.6 |
| 2015-01-01_01:24:19 | 2.6 |
| 2015-01-01_01:24:20 | 2.6 |
| 2015-01-01_01:24:21 | 2.6 |
| 2015-01-01_01:24:22 | 2.6 |
| 2015-01-01_01:24:23 | 2.6 |
| 2015-01-01_01:24:24 | 2.6 |
| 2015-01-01_01:24:25 | 2.6 |
| 2015-01-01_01:24:26 | 2.6 |
| 2015-01-01_01:24:27 | 2.6 |
| 2015-01-01_01:24:28 | 2.6 |
| 2015-01-01_01:24:29 | 2.6 |
| 2015-01-01_01:24:30 | 2.6 |
| 2015-01-01_01:24:31 | 2.6 |
| 2015-01-01_01:24:32 | 2.6 |
| 2015-01-01_01:24:33 | 2.5 |
| 2015-01-01_01:24:34 | 2.5 |
| 2015-01-01_01:24:35 | 2.5 |
| 2015-01-01_01:24:36 | 2.5 |
| 2015-01-01_01:24:37 | 2.5 |
| 2015-01-01_01:24:38 | 2.5 |
| 2015-01-01_01:24:39 | 2.5 |
| 2015-01-01_01:24:40 | 2.5 |
| 2015-01-01_01:24:41 | 2.5 |
| 2015-01-01_01:24:42 | 2.5 |
| 2015-01-01_01:24:43 | 2.4 |
| 2015-01-01_01:24:44 | 4.3 |
| 2015-01-01_01:24:45 | 5.9 |
| 2015-01-01_01:24:46 | 4.3 |
| 2015-01-01_01:24:47 | 4.9 |
| 2015-01-01_01:24:48 | 5.7 |
| 2015-01-01_01:24:49 | 6 |
| 2015-01-01_01:24:50 | 6.2 |
| 2015-01-01_01:24:51 | 6.2 |
| 2015-01-01_01:24:52 | 6.1 |
| 2015-01-01_01:24:53 | 6.2 |
| 2015-01-01_01:24:54 | 6.4 |
| 2015-01-01_01:24:55 | 5.1 |
| 2015-01-01_01:24:56 | 5.4 |
| 2015-01-01_01:24:57 | 6 |
| 2015-01-01_01:24:58 | 5.6 |
| 2015-01-01_01:24:59 | 5 |
| 2015-01-01_01:25:00 | 5 |
| 2015-01-01_01:25:01 | 5.1 |
| 2015-01-01_01:25:02 | 5.3 |
| 2015-01-01_01:25:03 | 5.5 |
| 2015-01-01_01:25:04 | 5.5 |
| 2015-01-01_01:25:05 | 5.3 |
| 2015-01-01_01:25:06 | 5.2 |
| 2015-01-01_01:25:07 | 5.3 |
| 2015-01-01_01:25:08 | 5.3 |
| 2015-01-01_01:25:09 | 5.3 |
| 2015-01-01_01:25:10 | 5.3 |
| 2015-01-01_01:25:11 | 5.3 |
| 2015-01-01_01:25:12 | 5.3 |
| 2015-01-01_01:25:13 | 5.3 |
| 2015-01-01_01:25:14 | 5.3 |
| 2015-01-01_01:25:15 | 5.4 |
| 2015-01-01_01:25:16 | 5.4 |
| 2015-01-01_01:25:17 | 5.5 |
| 2015-01-01_01:25:18 | 5.6 |
| 2015-01-01_01:25:19 | 5.7 |
| 2015-01-01_01:25:20 | 5.7 |
| 2015-01-01_01:25:21 | 5.7 |
| 2015-01-01_01:25:22 | 5.7 |
| 2015-01-01_01:25:23 | 5.7 |
| 2015-01-01_01:25:24 | 5.6 |
| 2015-01-01_01:25:25 | 5.6 |
| 2015-01-01_01:25:26 | 5.6 |
| 2015-01-01_01:25:27 | 5.5 |
| 2015-01-01_01:25:28 | 5.5 |
| 2015-01-01_01:25:29 | 5.4 |
| 2015-01-01_01:25:30 | 5.3 |
| 2015-01-01_01:25:31 | 5.2 |
| 2015-01-01_01:25:32 | 5 |
| 2015-01-01_01:25:33 | 5 |
| 2015-01-01_01:25:34 | 4.8 |
| 2015-01-01_01:25:35 | 4.7 |
| 2015-01-01_01:25:36 | 4.8 |
| 2015-01-01_01:25:37 | 4.8 |
| 2015-01-01_01:25:38 | 4.9 |
| 2015-01-01_01:25:39 | 4.9 |
| 2015-01-01_01:25:40 | 4.9 |
| 2015-01-01_01:25:41 | 4.8 |
| 2015-01-01_01:25:42 | 4.8 |
| 2015-01-01_01:25:43 | 5 |
| 2015-01-01_01:25:44 | 5.2 |
| 2015-01-01_01:25:45 | 5.5 |
| 2015-01-01_01:25:46 | 5.2 |
| 2015-01-01_01:25:47 | 4.7 |
| 2015-01-01_01:25:48 | 4.7 |
| 2015-01-01_01:25:49 | 4.8 |
| 2015-01-01_01:25:50 | 4.8 |
| 2015-01-01_01:25:51 | 4.8 |
| 2015-01-01_01:25:52 | 4.8 |
| 2015-01-01_01:25:53 | 4.8 |
| 2015-01-01_01:25:54 | 4.8 |
| 2015-01-01_01:25:55 | 4.9 |
| 2015-01-01_01:25:56 | 4.9 |
| 2015-01-01_01:25:57 | 4.8 |
| 2015-01-01_01:25:58 | 4.8 |
| 2015-01-01_01:25:59 | 4.7 |
| 2015-01-01_01:26:00 | 4.7 |
| 2015-01-01_01:26:01 | 4.6 |
| 2015-01-01_01:26:02 | 4.6 |
| 2015-01-01_01:26:03 | 4.5 |
| 2015-01-01_01:26:04 | 4.5 |
| 2015-01-01_01:26:05 | 4.5 |
| 2015-01-01_01:26:06 | 4.5 |
| 2015-01-01_01:26:07 | 4.5 |
| 2015-01-01_01:26:08 | 4.5 |
| 2015-01-01_01:26:09 | 4.4 |
| 2015-01-01_01:26:10 | 4.4 |
| 2015-01-01_01:26:11 | 4.5 |
| 2015-01-01_01:26:12 | 4.5 |
| 2015-01-01_01:26:13 | 4.6 |
| 2015-01-01_01:26:14 | 4.5 |
| 2015-01-01_01:26:15 | 4.5 |
| 2015-01-01_01:26:16 | 4.5 |
| 2015-01-01_01:26:17 | 4.5 |
| 2015-01-01_01:26:18 | 4.4 |
| 2015-01-01_01:26:19 | 4.3 |
| 2015-01-01_01:26:20 | 4.2 |
| 2015-01-01_01:26:21 | 4.2 |
| 2015-01-01_01:26:22 | 3.4 |
| 2015-01-01_01:26:23 | 5.1 |
| 2015-01-01_01:26:24 | 5.3 |
| 2015-01-01_01:26:25 | 5.5 |
| 2015-01-01_01:26:26 | 5.7 |
| 2015-01-01_01:26:27 | 5.7 |
| 2015-01-01_01:26:28 | 5.7 |
| 2015-01-01_01:26:29 | 5.7 |
| 2015-01-01_01:26:30 | 5.7 |
| 2015-01-01_01:26:31 | 5.6 |
| 2015-01-01_01:26:32 | 5.5 |
| 2015-01-01_01:26:33 | 5.5 |
| 2015-01-01_01:26:34 | 5.4 |
| 2015-01-01_01:26:35 | 5.3 |
| 2015-01-01_01:26:36 | 5.3 |
| 2015-01-01_01:26:37 | 5.4 |
| 2015-01-01_01:26:38 | 5.5 |
| 2015-01-01_01:26:39 | 5.6 |
| 2015-01-01_01:26:40 | 5.8 |
| 2015-01-01_01:26:41 | 6 |
| 2015-01-01_01:26:42 | 5.9 |
| 2015-01-01_01:26:43 | 4.3 |
| 2015-01-01_01:26:44 | 4.7 |
| 2015-01-01_01:26:45 | 4.8 |
| 2015-01-01_01:26:46 | 4.8 |
| 2015-01-01_01:26:47 | 4.7 |
| 2015-01-01_01:26:48 | 4.6 |
| 2015-01-01_01:26:49 | 4.6 |
| 2015-01-01_01:26:50 | 4.6 |
| 2015-01-01_01:26:51 | 4.6 |
| 2015-01-01_01:26:52 | 4.6 |
| 2015-01-01_01:26:53 | 4.7 |
| 2015-01-01_01:26:54 | 4.7 |
| 2015-01-01_01:26:55 | 4.7 |
| 2015-01-01_01:26:56 | 4.7 |
| 2015-01-01_01:26:57 | 4.7 |
| 2015-01-01_01:26:58 | 4.3 |
| 2015-01-01_01:26:59 | 4 |
| 2015-01-01_01:27:00 | 5.5 |
| 2015-01-01_01:27:01 | 5.4 |
| 2015-01-01_01:27:02 | 5.3 |
| 2015-01-01_01:27:03 | 5.2 |
| 2015-01-01_01:27:04 | 5.2 |
| 2015-01-01_01:27:05 | 5.4 |
| 2015-01-01_01:27:06 | 5.4 |
| 2015-01-01_01:27:07 | 5.4 |
| 2015-01-01_01:27:08 | 5.5 |
| 2015-01-01_01:27:09 | 5.4 |
| 2015-01-01_01:27:10 | 5.4 |
| 2015-01-01_01:27:11 | 5.4 |
| 2015-01-01_01:27:12 | 5.3 |
| 2015-01-01_01:27:13 | 5.3 |
| 2015-01-01_01:27:14 | 5.2 |
| 2015-01-01_01:27:15 | 5.1 |
| 2015-01-01_01:27:16 | 5 |
| 2015-01-01_01:27:17 | 4.9 |
| 2015-01-01_01:27:18 | 4.9 |
| 2015-01-01_01:27:19 | 4.8 |
| 2015-01-01_01:27:20 | 4.8 |
| 2015-01-01_01:27:21 | 4.7 |
| 2015-01-01_01:27:22 | 4.7 |
| 2015-01-01_01:27:23 | 4.7 |
| 2015-01-01_01:27:24 | 4.6 |
| 2015-01-01_01:27:25 | 4.6 |
| 2015-01-01_01:27:26 | 4.6 |
| 2015-01-01_01:27:27 | 4.6 |
| 2015-01-01_01:27:28 | 4.6 |
| 2015-01-01_01:27:29 | 4.7 |
| 2015-01-01_01:27:30 | 4.9 |
| 2015-01-01_01:27:31 | 5.2 |
| 2015-01-01_01:27:32 | 5.5 |
| 2015-01-01_01:27:33 | 5.7 |
| 2015-01-01_01:27:34 | 5.7 |
| 2015-01-01_01:27:35 | 5.6 |
| 2015-01-01_01:27:36 | 5.6 |
| 2015-01-01_01:27:37 | 5.5 |
| 2015-01-01_01:27:38 | 5.5 |
| 2015-01-01_01:27:39 | 5.6 |
| 2015-01-01_01:27:40 | 5.7 |
| 2015-01-01_01:27:41 | 5.8 |
| 2015-01-01_01:27:42 | 5.8 |
| 2015-01-01_01:27:43 | 5.9 |
| 2015-01-01_01:27:44 | 6 |
| 2015-01-01_01:27:45 | 6 |
| 2015-01-01_01:27:46 | 6.1 |
| 2015-01-01_01:27:47 | 6.1 |
| 2015-01-01_01:27:48 | 6.2 |
| 2015-01-01_01:27:49 | 6.2 |
| 2015-01-01_01:27:50 | 6.2 |
| 2015-01-01_01:27:51 | 5.1 |
| 2015-01-01_01:27:52 | 5.2 |
| 2015-01-01_01:27:53 | 5.4 |
| 2015-01-01_01:27:54 | 5.6 |
| 2015-01-01_01:27:55 | 5.9 |
| 2015-01-01_01:27:56 | 6 |
| 2015-01-01_01:27:57 | 6.2 |
| 2015-01-01_01:27:58 | 6.3 |
| 2015-01-01_01:27:59 | 6.4 |
| 2015-01-01_01:28:00 | 6.4 |
| 2015-01-01_01:28:01 | 6.4 |
| 2015-01-01_01:28:02 | 6.5 |
| 2015-01-01_01:28:03 | 6.5 |
| 2015-01-01_01:28:04 | 6.5 |
| 2015-01-01_01:28:05 | 6.5 |
| 2015-01-01_01:28:06 | 6.4 |
| 2015-01-01_01:28:07 | 6.4 |
| 2015-01-01_01:28:08 | 6.4 |
| 2015-01-01_01:28:09 | 6.3 |
| 2015-01-01_01:28:10 | 6.3 |
| 2015-01-01_01:28:11 | 6.3 |
| 2015-01-01_01:28:12 | 6.3 |
| 2015-01-01_01:28:13 | 6.3 |
| 2015-01-01_01:28:14 | 6.3 |
| 2015-01-01_01:28:15 | 6.3 |
| 2015-01-01_01:28:16 | 6.3 |
| 2015-01-01_01:28:17 | 6.3 |
| 2015-01-01_01:28:18 | 6.3 |
| 2015-01-01_01:28:19 | 6.2 |
| 2015-01-01_01:28:20 | 6.3 |
| 2015-01-01_01:28:21 | 6.2 |
| 2015-01-01_01:28:22 | 6.2 |
| 2015-01-01_01:28:23 | 6.2 |
| 2015-01-01_01:28:24 | 6.2 |
| 2015-01-01_01:28:25 | 6.2 |
| 2015-01-01_01:28:26 | 6.1 |
| 2015-01-01_01:28:27 | 6.1 |
| 2015-01-01_01:28:28 | 6.1 |
| 2015-01-01_01:28:29 | 6.1 |
| 2015-01-01_01:28:30 | 6.1 |
| 2015-01-01_01:28:31 | 6 |
| 2015-01-01_01:28:32 | 6.1 |
| 2015-01-01_01:28:33 | 6.2 |
| 2015-01-01_01:28:34 | 6.2 |
| 2015-01-01_01:28:35 | 6.2 |
| 2015-01-01_01:28:36 | 6.2 |
| 2015-01-01_01:28:37 | 6.2 |
| 2015-01-01_01:28:38 | 6.2 |
| 2015-01-01_01:28:39 | 6.1 |
| 2015-01-01_01:28:40 | 6.1 |
| 2015-01-01_01:28:41 | 6.1 |
| 2015-01-01_01:28:42 | 6.1 |
| 2015-01-01_01:28:43 | 6.1 |
| 2015-01-01_01:28:44 | 6 |
| 2015-01-01_01:28:45 | 6 |
| 2015-01-01_01:28:46 | 6 |
| 2015-01-01_01:28:47 | 6 |
| 2015-01-01_01:28:48 | 5.9 |
| 2015-01-01_01:28:49 | 5.9 |
| 2015-01-01_01:28:50 | 5.9 |
| 2015-01-01_01:28:51 | 5.9 |
| 2015-01-01_01:28:52 | 5.8 |
| 2015-01-01_01:28:53 | 5.8 |
| 2015-01-01_01:28:54 | 5.7 |
| 2015-01-01_01:28:55 | 5.7 |
| 2015-01-01_01:28:56 | 5.7 |
| 2015-01-01_01:28:57 | 5.6 |
| 2015-01-01_01:28:58 | 5.5 |
| 2015-01-01_01:28:59 | 5.4 |
| 2015-01-01_01:29:00 | 5.3 |
| 2015-01-01_01:29:01 | 5.2 |
| 2015-01-01_01:29:02 | 5.2 |
| 2015-01-01_01:29:03 | 5.1 |
| 2015-01-01_01:29:04 | 4.9 |
| 2015-01-01_01:29:05 | 4.9 |
| 2015-01-01_01:29:06 | 4.8 |
| 2015-01-01_01:29:07 | 4.8 |
| 2015-01-01_01:29:08 | 4.8 |
| 2015-01-01_01:29:09 | 4.8 |
| 2015-01-01_01:29:10 | 4.7 |
| 2015-01-01_01:29:11 | 4.7 |
| 2015-01-01_01:29:12 | 4.7 |
| 2015-01-01_01:29:13 | 4.8 |
| 2015-01-01_01:29:14 | 4.8 |
| 2015-01-01_01:29:15 | 4.9 |
| 2015-01-01_01:29:16 | 4.9 |
| 2015-01-01_01:29:17 | 4.8 |
| 2015-01-01_01:29:18 | 4.8 |
| 2015-01-01_01:29:19 | 4.8 |
| 2015-01-01_01:29:20 | 4.8 |
| 2015-01-01_01:29:21 | 4.8 |
| 2015-01-01_01:29:22 | 4.8 |
| 2015-01-01_01:29:23 | 4.8 |
| 2015-01-01_01:29:24 | 4.8 |
| 2015-01-01_01:29:25 | 4.9 |
| 2015-01-01_01:29:26 | 4.8 |
| 2015-01-01_01:29:27 | 4.8 |
| 2015-01-01_01:29:28 | 4.8 |
| 2015-01-01_01:29:29 | 4.8 |
| 2015-01-01_01:29:30 | 4.8 |
| 2015-01-01_01:29:31 | 4.7 |
| 2015-01-01_01:29:32 | 4.7 |
| 2015-01-01_01:29:33 | 4.7 |
| 2015-01-01_01:29:34 | 4.6 |
| 2015-01-01_01:29:35 | 4.5 |
| 2015-01-01_01:29:36 | 4.4 |
| 2015-01-01_01:29:37 | 4.3 |
| 2015-01-01_01:29:38 | 4.3 |
| 2015-01-01_01:29:39 | 4.2 |
| 2015-01-01_01:29:40 | 4.2 |
| 2015-01-01_01:29:41 | 4.1 |
| 2015-01-01_01:29:42 | 3.8 |
| 2015-01-01_01:29:43 | 3.3 |
| 2015-01-01_01:29:44 | 2.7 |
| 2015-01-01_01:29:45 | 2.4 |
| 2015-01-01_01:29:46 | 2.5 |
| 2015-01-01_01:29:47 | 2.4 |
| 2015-01-01_01:29:48 | 2.5 |
| 2015-01-01_01:29:49 | 2.4 |
| 2015-01-01_01:29:50 | 2.3 |
| 2015-01-01_01:29:51 | 2.4 |
| 2015-01-01_01:29:52 | 2.4 |
| 2015-01-01_01:29:53 | 2.4 |
| 2015-01-01_01:29:54 | 2.3 |
| 2015-01-01_01:29:55 | 2.4 |
| 2015-01-01_01:29:56 | 2.4 |
| 2015-01-01_01:29:57 | 2.3 |
| 2015-01-01_01:29:58 | 2.3 |
| 2015-01-01_01:29:59 | 2.3 |
| 2015-01-01_01:30:00 | 2.4 |
| 2015-01-01_01:30:01 | 2.4 |
| 2015-01-01_01:30:02 | 2.4 |
| 2015-01-01_01:30:03 | 2.4 |
| 2015-01-01_01:30:04 | 2.4 |
| 2015-01-01_01:30:05 | 2.4 |
| 2015-01-01_01:30:06 | 2.4 |
| 2015-01-01_01:30:07 | 2.5 |
| 2015-01-01_01:30:08 | 3.2 |
| 2015-01-01_01:30:09 | 5.5 |
| 2015-01-01_01:30:10 | 5.7 |
| 2015-01-01_01:30:11 | 5.4 |
| 2015-01-01_01:30:12 | 6.3 |
| 2015-01-01_01:30:13 | 4.8 |
| 2015-01-01_01:30:14 | 4.9 |
| 2015-01-01_01:30:15 | 5.2 |
| 2015-01-01_01:30:16 | 5.5 |
| 2015-01-01_01:30:17 | 5.8 |
| 2015-01-01_01:30:18 | 5.8 |
| 2015-01-01_01:30:19 | 5.7 |
| 2015-01-01_01:30:20 | 5.8 |
| 2015-01-01_01:30:21 | 5.9 |
| 2015-01-01_01:30:22 | 6.1 |
| 2015-01-01_01:30:23 | 5.8 |
| 2015-01-01_01:30:24 | 4.9 |
| 2015-01-01_01:30:25 | 4.9 |
| 2015-01-01_01:30:26 | 5.1 |
| 2015-01-01_01:30:27 | 5.3 |
| 2015-01-01_01:30:28 | 5.5 |
| 2015-01-01_01:30:29 | 5.6 |
| 2015-01-01_01:30:30 | 5.7 |
| 2015-01-01_01:30:31 | 5.7 |
| 2015-01-01_01:30:32 | 5.8 |
| 2015-01-01_01:30:33 | 5.8 |
| 2015-01-01_01:30:34 | 5.8 |
| 2015-01-01_01:30:35 | 5.7 |
| 2015-01-01_01:30:36 | 5.7 |
| 2015-01-01_01:30:37 | 5.6 |
| 2015-01-01_01:30:38 | 5.6 |
| 2015-01-01_01:30:39 | 5.5 |
| 2015-01-01_01:30:40 | 5.4 |
| 2015-01-01_01:30:41 | 5.2 |
| 2015-01-01_01:30:42 | 5.1 |
| 2015-01-01_01:30:43 | 5 |
| 2015-01-01_01:30:44 | 4.9 |
| 2015-01-01_01:30:45 | 4.9 |
| 2015-01-01_01:30:46 | 4.9 |
| 2015-01-01_01:30:47 | 5 |
| 2015-01-01_01:30:48 | 5.1 |
| 2015-01-01_01:30:49 | 5.2 |
| 2015-01-01_01:30:50 | 5.3 |
| 2015-01-01_01:30:51 | 5.3 |
| 2015-01-01_01:30:52 | 5.3 |
| 2015-01-01_01:30:53 | 5.3 |
| 2015-01-01_01:30:54 | 5.2 |
| 2015-01-01_01:30:55 | 5.2 |
| 2015-01-01_01:30:56 | 5.3 |
| 2015-01-01_01:30:57 | 5.6 |
| 2015-01-01_01:30:58 | 6 |
| 2015-01-01_01:30:59 | 6.3 |
| 2015-01-01_01:31:00 | 6.4 |
| 2015-01-01_01:31:01 | 6.4 |
| 2015-01-01_01:31:02 | 6.4 |
| 2015-01-01_01:31:03 | 6.3 |
| 2015-01-01_01:31:04 | 5.3 |
| 2015-01-01_01:31:05 | 5.4 |
| 2015-01-01_01:31:06 | 5.4 |
| 2015-01-01_01:31:07 | 5.4 |
| 2015-01-01_01:31:08 | 5.4 |
| 2015-01-01_01:31:09 | 5.4 |
| 2015-01-01_01:31:10 | 5.4 |
| 2015-01-01_01:31:11 | 5.4 |
| 2015-01-01_01:31:12 | 5.3 |
| 2015-01-01_01:31:13 | 5.2 |
| 2015-01-01_01:31:14 | 5.3 |
| 2015-01-01_01:31:15 | 5.4 |
| 2015-01-01_01:31:16 | 5.4 |
| 2015-01-01_01:31:17 | 5.4 |
| 2015-01-01_01:31:18 | 5.5 |
| 2015-01-01_01:31:19 | 5.5 |
| 2015-01-01_01:31:20 | 5.4 |
| 2015-01-01_01:31:21 | 5.5 |
| 2015-01-01_01:31:22 | 5.5 |
| 2015-01-01_01:31:23 | 5.5 |
| 2015-01-01_01:31:24 | 5.5 |
| 2015-01-01_01:31:25 | 5.5 |
| 2015-01-01_01:31:26 | 5.4 |
| 2015-01-01_01:31:27 | 5.2 |
| 2015-01-01_01:31:28 | 4.9 |
| 2015-01-01_01:31:29 | 4.7 |
| 2015-01-01_01:31:30 | 4.3 |
| 2015-01-01_01:31:31 | 4.1 |
| 2015-01-01_01:31:32 | 3.8 |
| 2015-01-01_01:31:33 | 3.6 |
| 2015-01-01_01:31:34 | 3.5 |
| 2015-01-01_01:31:35 | 2.4 |
| 2015-01-01_01:31:36 | 2.4 |
| 2015-01-01_01:31:37 | 2.4 |
| 2015-01-01_01:31:38 | 2.4 |
| 2015-01-01_01:31:39 | 2.3 |
| 2015-01-01_01:31:40 | 2.3 |
| 2015-01-01_01:31:41 | 2.3 |
| 2015-01-01_01:31:42 | 2.4 |
| 2015-01-01_01:31:43 | 2.3 |
| 2015-01-01_01:31:44 | 2.3 |
| 2015-01-01_01:31:45 | 2.4 |
| 2015-01-01_01:31:46 | 2.8 |
| 2015-01-01_01:31:47 | 3.5 |
| 2015-01-01_01:31:48 | 6.2 |
| 2015-01-01_01:31:49 | 4.9 |
| 2015-01-01_01:31:50 | 5.2 |
| 2015-01-01_01:31:51 | 6.3 |
| 2015-01-01_01:31:52 | 5.8 |
| 2015-01-01_01:31:53 | 5 |
| 2015-01-01_01:31:54 | 5.5 |
| 2015-01-01_01:31:55 | 5.9 |
| 2015-01-01_01:31:56 | 6.1 |
| 2015-01-01_01:31:57 | 6.3 |
| 2015-01-01_01:31:58 | 6.4 |
| 2015-01-01_01:31:59 | 6.5 |
| 2015-01-01_01:32:00 | 5.8 |
| 2015-01-01_01:32:01 | 5.7 |
| 2015-01-01_01:32:02 | 5.6 |
| 2015-01-01_01:32:03 | 5.4 |
| 2015-01-01_01:32:04 | 5.4 |
| 2015-01-01_01:32:05 | 5.5 |
| 2015-01-01_01:32:06 | 5.7 |
| 2015-01-01_01:32:07 | 5.9 |
| 2015-01-01_01:32:08 | 6.1 |
| 2015-01-01_01:32:09 | 6.1 |
| 2015-01-01_01:32:10 | 5.1 |
| 2015-01-01_01:32:11 | 5.3 |
| 2015-01-01_01:32:12 | 5.3 |
| 2015-01-01_01:32:13 | 5.4 |
| 2015-01-01_01:32:14 | 5.4 |
| 2015-01-01_01:32:15 | 5.4 |
| 2015-01-01_01:32:16 | 5.4 |
| 2015-01-01_01:32:17 | 5.4 |
| 2015-01-01_01:32:18 | 5.4 |
| 2015-01-01_01:32:19 | 5.4 |
| 2015-01-01_01:32:20 | 5.4 |
| 2015-01-01_01:32:21 | 5.5 |
| 2015-01-01_01:32:22 | 5.5 |
| 2015-01-01_01:32:23 | 5.5 |
| 2015-01-01_01:32:24 | 5.5 |
| 2015-01-01_01:32:25 | 5.5 |
| 2015-01-01_01:32:26 | 5.4 |
| 2015-01-01_01:32:27 | 5.5 |
| 2015-01-01_01:32:28 | 5.5 |
| 2015-01-01_01:32:29 | 5.5 |
| 2015-01-01_01:32:30 | 5.5 |
| 2015-01-01_01:32:31 | 5.4 |
| 2015-01-01_01:32:32 | 5.4 |
| 2015-01-01_01:32:33 | 5.4 |
| 2015-01-01_01:32:34 | 5.4 |
| 2015-01-01_01:32:35 | 5.4 |
| 2015-01-01_01:32:36 | 5.4 |
| 2015-01-01_01:32:37 | 5.4 |
| 2015-01-01_01:32:38 | 5.4 |
| 2015-01-01_01:32:39 | 5.3 |
| 2015-01-01_01:32:40 | 5.3 |
| 2015-01-01_01:32:41 | 5.3 |
| 2015-01-01_01:32:42 | 5.3 |
| 2015-01-01_01:32:43 | 5.3 |
| 2015-01-01_01:32:44 | 5.3 |
| 2015-01-01_01:32:45 | 5.3 |
| 2015-01-01_01:32:46 | 5.3 |
| 2015-01-01_01:32:47 | 5.2 |
| 2015-01-01_01:32:48 | 5.3 |
| 2015-01-01_01:32:49 | 5.3 |
| 2015-01-01_01:32:50 | 5.3 |
| 2015-01-01_01:32:51 | 5.3 |
| 2015-01-01_01:32:52 | 5.3 |
| 2015-01-01_01:32:53 | 5.3 |
| 2015-01-01_01:32:54 | 5.3 |
| 2015-01-01_01:32:55 | 5.3 |
| 2015-01-01_01:32:56 | 5.3 |
| 2015-01-01_01:32:57 | 5.3 |
| 2015-01-01_01:32:58 | 5.4 |
| 2015-01-01_01:32:59 | 5.4 |
| 2015-01-01_01:33:00 | 5.5 |
| 2015-01-01_01:33:01 | 5.6 |
| 2015-01-01_01:33:02 | 5.7 |
| 2015-01-01_01:33:03 | 5.8 |
| 2015-01-01_01:33:04 | 5.9 |
| 2015-01-01_01:33:05 | 5.9 |
| 2015-01-01_01:33:06 | 6 |
| 2015-01-01_01:33:07 | 6 |
| 2015-01-01_01:33:08 | 6 |
| 2015-01-01_01:33:09 | 5.9 |
| 2015-01-01_01:33:10 | 6 |
| 2015-01-01_01:33:11 | 6 |
| 2015-01-01_01:33:12 | 6.1 |
| 2015-01-01_01:33:13 | 6.2 |
| 2015-01-01_01:33:14 | 6.3 |
| 2015-01-01_01:33:15 | 6 |
| 2015-01-01_01:33:16 | 5.2 |
| 2015-01-01_01:33:17 | 5.4 |
| 2015-01-01_01:33:18 | 5.4 |
| 2015-01-01_01:33:19 | 5.5 |
| 2015-01-01_01:33:20 | 5.5 |
| 2015-01-01_01:33:21 | 5.7 |
| 2015-01-01_01:33:22 | 5.7 |
| 2015-01-01_01:33:23 | 5.8 |
| 2015-01-01_01:33:24 | 5.8 |
| 2015-01-01_01:33:25 | 5.9 |
| 2015-01-01_01:33:26 | 5.9 |
| 2015-01-01_01:33:27 | 5.9 |
| 2015-01-01_01:33:28 | 5.9 |
| 2015-01-01_01:33:29 | 6 |
| 2015-01-01_01:33:30 | 6 |
| 2015-01-01_01:33:31 | 6 |
| 2015-01-01_01:33:32 | 6 |
| 2015-01-01_01:33:33 | 6 |
| 2015-01-01_01:33:34 | 6 |
| 2015-01-01_01:33:35 | 6 |
| 2015-01-01_01:33:36 | 6.1 |
| 2015-01-01_01:33:37 | 6.1 |
| 2015-01-01_01:33:38 | 6 |
| 2015-01-01_01:33:39 | 6 |
| 2015-01-01_01:33:40 | 6 |
| 2015-01-01_01:33:41 | 6 |
| 2015-01-01_01:33:42 | 6 |
| 2015-01-01_01:33:43 | 6.1 |
| 2015-01-01_01:33:44 | 6 |
| 2015-01-01_01:33:45 | 6.1 |
| 2015-01-01_01:33:46 | 6 |
| 2015-01-01_01:33:47 | 6 |
| 2015-01-01_01:33:48 | 6 |
| 2015-01-01_01:33:49 | 6 |
| 2015-01-01_01:33:50 | 6 |
| 2015-01-01_01:33:51 | 5.9 |
| 2015-01-01_01:33:52 | 5.9 |
| 2015-01-01_01:33:53 | 5.8 |
| 2015-01-01_01:33:54 | 5.8 |
| 2015-01-01_01:33:55 | 5.8 |
| 2015-01-01_01:33:56 | 5.7 |
| 2015-01-01_01:33:57 | 5.7 |
| 2015-01-01_01:33:58 | 5.7 |
| 2015-01-01_01:33:59 | 5.7 |
| 2015-01-01_01:34:00 | 5.6 |
| 2015-01-01_01:34:01 | 5.6 |
| 2015-01-01_01:34:02 | 5.7 |
| 2015-01-01_01:34:03 | 5.9 |
| 2015-01-01_01:34:04 | 6 |
| 2015-01-01_01:34:05 | 5.9 |
| 2015-01-01_01:34:06 | 5.9 |
| 2015-01-01_01:34:07 | 5.9 |
| 2015-01-01_01:34:08 | 5.9 |
| 2015-01-01_01:34:09 | 5.9 |
| 2015-01-01_01:34:10 | 5.8 |
| 2015-01-01_01:34:11 | 5.8 |
| 2015-01-01_01:34:12 | 5.6 |
| 2015-01-01_01:34:13 | 5.5 |
| 2015-01-01_01:34:14 | 5.7 |
| 2015-01-01_01:34:15 | 5.8 |
| 2015-01-01_01:34:16 | 5.8 |
| 2015-01-01_01:34:17 | 5.8 |
| 2015-01-01_01:34:18 | 5.7 |
| 2015-01-01_01:34:19 | 5.6 |
| 2015-01-01_01:34:20 | 5.5 |
| 2015-01-01_01:34:21 | 5.6 |
| 2015-01-01_01:34:22 | 5.6 |
| 2015-01-01_01:34:23 | 5.5 |
| 2015-01-01_01:34:24 | 5.6 |
| 2015-01-01_01:34:25 | 5.6 |
| 2015-01-01_01:34:26 | 5.3 |
| 2015-01-01_01:34:27 | 4.8 |
| 2015-01-01_01:34:28 | 4.6 |
| 2015-01-01_01:34:29 | 4.5 |
| 2015-01-01_01:34:30 | 4.4 |
| 2015-01-01_01:34:31 | 4.4 |
| 2015-01-01_01:34:32 | 4.5 |
| 2015-01-01_01:34:33 | 4.6 |
| 2015-01-01_01:34:34 | 4.7 |
| 2015-01-01_01:34:35 | 4.8 |
| 2015-01-01_01:34:36 | 4.8 |
| 2015-01-01_01:34:37 | 5.1 |
| 2015-01-01_01:34:38 | 5.3 |
| 2015-01-01_01:34:39 | 5.5 |
| 2015-01-01_01:34:40 | 5.6 |
| 2015-01-01_01:34:41 | 5.7 |
| 2015-01-01_01:34:42 | 5.8 |
| 2015-01-01_01:34:43 | 5.8 |
| 2015-01-01_01:34:44 | 5.8 |
| 2015-01-01_01:34:45 | 5.8 |
| 2015-01-01_01:34:46 | 5.7 |
| 2015-01-01_01:34:47 | 5.7 |
| 2015-01-01_01:34:48 | 5.7 |
| 2015-01-01_01:34:49 | 5.7 |
| 2015-01-01_01:34:50 | 5.7 |
| 2015-01-01_01:34:51 | 5.7 |
| 2015-01-01_01:34:52 | 5.7 |
| 2015-01-01_01:34:53 | 5.6 |
| 2015-01-01_01:34:54 | 5.6 |
| 2015-01-01_01:34:55 | 5.6 |
| 2015-01-01_01:34:56 | 5.6 |
| 2015-01-01_01:34:57 | 5.6 |
| 2015-01-01_01:34:58 | 5.6 |
| 2015-01-01_01:34:59 | 5.6 |
| 2015-01-01_01:35:00 | 5.6 |
| 2015-01-01_01:35:01 | 5.7 |
| 2015-01-01_01:35:02 | 5.7 |
| 2015-01-01_01:35:03 | 5.7 |
| 2015-01-01_01:35:04 | 5.7 |
| 2015-01-01_01:35:05 | 5.7 |
| 2015-01-01_01:35:06 | 5.7 |
| 2015-01-01_01:35:07 | 5.7 |
| 2015-01-01_01:35:08 | 5.7 |
| 2015-01-01_01:35:09 | 5.7 |
| 2015-01-01_01:35:10 | 5.7 |
| 2015-01-01_01:35:11 | 5.8 |
| 2015-01-01_01:35:12 | 5.7 |
| 2015-01-01_01:35:13 | 5.9 |
| 2015-01-01_01:35:14 | 5.9 |
| 2015-01-01_01:35:15 | 5.8 |
| 2015-01-01_01:35:16 | 5.9 |
| 2015-01-01_01:35:17 | 5.9 |
| 2015-01-01_01:35:18 | 5.9 |
| 2015-01-01_01:35:19 | 5.9 |
| 2015-01-01_01:35:20 | 5.8 |
| 2015-01-01_01:35:21 | 5.7 |
| 2015-01-01_01:35:22 | 5.5 |
| 2015-01-01_01:35:23 | 5.5 |
| 2015-01-01_01:35:24 | 5.6 |
| 2015-01-01_01:35:25 | 5.7 |
| 2015-01-01_01:35:26 | 5.7 |
| 2015-01-01_01:35:27 | 5.8 |
| 2015-01-01_01:35:28 | 5.8 |
| 2015-01-01_01:35:29 | 5.8 |
| 2015-01-01_01:35:30 | 5.8 |
| 2015-01-01_01:35:31 | 5.7 |
| 2015-01-01_01:35:32 | 5.7 |
| 2015-01-01_01:35:33 | 5.7 |
| 2015-01-01_01:35:34 | 5.7 |
| 2015-01-01_01:35:35 | 5.7 |
| 2015-01-01_01:35:36 | 5.8 |
| 2015-01-01_01:35:37 | 5.8 |
| 2015-01-01_01:35:38 | 5.8 |
| 2015-01-01_01:35:39 | 5.8 |
| 2015-01-01_01:35:40 | 5.8 |
| 2015-01-01_01:35:41 | 5.7 |
| 2015-01-01_01:35:42 | 5.6 |
| 2015-01-01_01:35:43 | 5.6 |
| 2015-01-01_01:35:44 | 5.6 |
| 2015-01-01_01:35:45 | 5.6 |
| 2015-01-01_01:35:46 | 5.6 |
| 2015-01-01_01:35:47 | 5.6 |
| 2015-01-01_01:35:48 | 5.6 |
| 2015-01-01_01:35:49 | 5.6 |
| 2015-01-01_01:35:50 | 5.6 |
| 2015-01-01_01:35:51 | 5.5 |
| 2015-01-01_01:35:52 | 5.4 |
| 2015-01-01_01:35:53 | 5.4 |
| 2015-01-01_01:35:54 | 5.3 |
| 2015-01-01_01:35:55 | 5.2 |
| 2015-01-01_01:35:56 | 5.2 |
| 2015-01-01_01:35:57 | 5.1 |
| 2015-01-01_01:35:58 | 5 |
| 2015-01-01_01:35:59 | 5 |
| 2015-01-01_01:36:00 | 4.9 |
| 2015-01-01_01:36:01 | 4.8 |
| 2015-01-01_01:36:02 | 4.8 |
| 2015-01-01_01:36:03 | 4.7 |
| 2015-01-01_01:36:04 | 4.6 |
| 2015-01-01_01:36:05 | 4.6 |
| 2015-01-01_01:36:06 | 4.7 |
| 2015-01-01_01:36:07 | 4.7 |
| 2015-01-01_01:36:08 | 4.8 |
| 2015-01-01_01:36:09 | 4.9 |
| 2015-01-01_01:36:10 | 4.9 |
| 2015-01-01_01:36:11 | 4.9 |
| 2015-01-01_01:36:12 | 4.9 |
| 2015-01-01_01:36:13 | 4.9 |
| 2015-01-01_01:36:14 | 4.9 |
| 2015-01-01_01:36:15 | 4.8 |
| 2015-01-01_01:36:16 | 4.8 |
| 2015-01-01_01:36:17 | 4.8 |
| 2015-01-01_01:36:18 | 4.8 |
| 2015-01-01_01:36:19 | 4.7 |
| 2015-01-01_01:36:20 | 4.7 |
| 2015-01-01_01:36:21 | 4.7 |
| 2015-01-01_01:36:22 | 4.7 |
| 2015-01-01_01:36:23 | 4.7 |
| 2015-01-01_01:36:24 | 4.7 |
| 2015-01-01_01:36:25 | 4.7 |
| 2015-01-01_01:36:26 | 4.7 |
| 2015-01-01_01:36:27 | 4.7 |
| 2015-01-01_01:36:28 | 4.7 |
| 2015-01-01_01:36:29 | 4.8 |
| 2015-01-01_01:36:30 | 4.8 |
| 2015-01-01_01:36:31 | 4.8 |
| 2015-01-01_01:36:32 | 4.7 |
| 2015-01-01_01:36:33 | 4.7 |
| 2015-01-01_01:36:34 | 4.7 |
| 2015-01-01_01:36:35 | 4.7 |
| 2015-01-01_01:36:36 | 4.6 |
| 2015-01-01_01:36:37 | 4.6 |
| 2015-01-01_01:36:38 | 4.6 |
| 2015-01-01_01:36:39 | 4.6 |
| 2015-01-01_01:36:40 | 4.6 |
| 2015-01-01_01:36:41 | 4.6 |
| 2015-01-01_01:36:42 | 4.6 |
| 2015-01-01_01:36:43 | 4.6 |
| 2015-01-01_01:36:44 | 4.6 |
| 2015-01-01_01:36:45 | 4.6 |
| 2015-01-01_01:36:46 | 4.6 |
| 2015-01-01_01:36:47 | 4.7 |
| 2015-01-01_01:36:48 | 4.6 |
| 2015-01-01_01:36:49 | 4.6 |
| 2015-01-01_01:36:50 | 4.7 |
| 2015-01-01_01:36:51 | 4.7 |
| 2015-01-01_01:36:52 | 4.6 |
| 2015-01-01_01:36:53 | 4.6 |
| 2015-01-01_01:36:54 | 4.6 |
| 2015-01-01_01:36:55 | 4.6 |
| 2015-01-01_01:36:56 | 4.5 |
| 2015-01-01_01:36:57 | 4.4 |
| 2015-01-01_01:36:58 | 3.9 |
| 2015-01-01_01:36:59 | 3.2 |
| 2015-01-01_01:37:00 | 2.7 |
| 2015-01-01_01:37:01 | 2.4 |
| 2015-01-01_01:37:02 | 2.4 |
| 2015-01-01_01:37:03 | 2.4 |
| 2015-01-01_01:37:04 | 2.3 |
| 2015-01-01_01:37:05 | 2.3 |
| 2015-01-01_01:37:06 | 2.3 |
| 2015-01-01_01:37:07 | 2.3 |
| 2015-01-01_01:37:08 | 2.3 |
| 2015-01-01_01:37:09 | 2.3 |
| 2015-01-01_01:37:10 | 2.3 |
| 2015-01-01_01:37:11 | 2.3 |
| 2015-01-01_01:37:12 | 2.3 |
| 2015-01-01_01:37:13 | 2.3 |
| 2015-01-01_01:37:14 | 2.3 |
| 2015-01-01_01:37:15 | 2.3 |
| 2015-01-01_01:37:16 | 2.3 |
| 2015-01-01_01:37:17 | 2.3 |
| 2015-01-01_01:37:18 | 2.3 |
| 2015-01-01_01:37:19 | 2.3 |
| 2015-01-01_01:37:20 | 2.3 |
| 2015-01-01_01:37:21 | 2.3 |
| 2015-01-01_01:37:22 | 2.3 |
| 2015-01-01_01:37:23 | 2.3 |
| 2015-01-01_01:37:24 | 2.3 |
| 2015-01-01_01:37:25 | 2.3 |
| 2015-01-01_01:37:26 | 2.3 |
| 2015-01-01_01:37:27 | 2.3 |
| 2015-01-01_01:37:28 | 2.3 |
| 2015-01-01_01:37:29 | 2.3 |
| 2015-01-01_01:37:30 | 2.3 |
| 2015-01-01_01:37:31 | 2.3 |
| 2015-01-01_01:37:32 | 2.3 |
| 2015-01-01_01:37:33 | 2.3 |
| 2015-01-01_01:37:34 | 2.3 |
| 2015-01-01_01:37:35 | 2.3 |
| 2015-01-01_01:37:36 | 2.2 |
| 2015-01-01_01:37:37 | 2.8 |
| 2015-01-01_01:37:38 | 3.2 |
| 2015-01-01_01:37:39 | 6 |
| 2015-01-01_01:37:40 | 4.7 |
| 2015-01-01_01:37:41 | 5.3 |
| 2015-01-01_01:37:42 | 5.9 |
| 2015-01-01_01:37:43 | 6.3 |
| 2015-01-01_01:37:44 | 4.6 |
| 2015-01-01_01:37:45 | 5.1 |
| 2015-01-01_01:37:46 | 5.7 |
| 2015-01-01_01:37:47 | 5.9 |
| 2015-01-01_01:37:48 | 6 |
| 2015-01-01_01:37:49 | 5.9 |
| 2015-01-01_01:37:50 | 5.7 |
| 2015-01-01_01:37:51 | 5.6 |
| 2015-01-01_01:37:52 | 5.6 |
| 2015-01-01_01:37:53 | 5.6 |
| 2015-01-01_01:37:54 | 5.7 |
| 2015-01-01_01:37:55 | 5.7 |
| 2015-01-01_01:37:56 | 5.8 |
| 2015-01-01_01:37:57 | 6 |
| 2015-01-01_01:37:58 | 6.1 |
| 2015-01-01_01:37:59 | 6.2 |
| 2015-01-01_01:38:00 | 4.8 |
| 2015-01-01_01:38:01 | 5 |
| 2015-01-01_01:38:02 | 5.2 |
| 2015-01-01_01:38:03 | 5.5 |
| 2015-01-01_01:38:04 | 5.8 |
| 2015-01-01_01:38:05 | 6 |
| 2015-01-01_01:38:06 | 6.1 |
| 2015-01-01_01:38:07 | 6.1 |
| 2015-01-01_01:38:08 | 6.1 |
| 2015-01-01_01:38:09 | 4.7 |
| 2015-01-01_01:38:10 | 5 |
| 2015-01-01_01:38:11 | 5.1 |
| 2015-01-01_01:38:12 | 5.2 |
| 2015-01-01_01:38:13 | 5.3 |
| 2015-01-01_01:38:14 | 5.4 |
| 2015-01-01_01:38:15 | 5.3 |
| 2015-01-01_01:38:16 | 5.2 |
| 2015-01-01_01:38:17 | 5.1 |
| 2015-01-01_01:38:18 | 5.2 |
| 2015-01-01_01:38:19 | 5.3 |
| 2015-01-01_01:38:20 | 5.2 |
| 2015-01-01_01:38:21 | 5.2 |
| 2015-01-01_01:38:22 | 5.2 |
| 2015-01-01_01:38:23 | 5.3 |
| 2015-01-01_01:38:24 | 5.3 |
| 2015-01-01_01:38:25 | 5.1 |
| 2015-01-01_01:38:26 | 5.2 |
| 2015-01-01_01:38:27 | 5.1 |
| 2015-01-01_01:38:28 | 5.1 |
| 2015-01-01_01:38:29 | 5.1 |
| 2015-01-01_01:38:30 | 5.1 |
| 2015-01-01_01:38:31 | 5.3 |
| 2015-01-01_01:38:32 | 5.5 |
| 2015-01-01_01:38:33 | 5.5 |
| 2015-01-01_01:38:34 | 5.7 |
| 2015-01-01_01:38:35 | 5.7 |
| 2015-01-01_01:38:36 | 5.6 |
| 2015-01-01_01:38:37 | 5.8 |
| 2015-01-01_01:38:38 | 6 |
| 2015-01-01_01:38:39 | 6 |
| 2015-01-01_01:38:40 | 6 |
| 2015-01-01_01:38:41 | 5.9 |
| 2015-01-01_01:38:42 | 5.9 |
| 2015-01-01_01:38:43 | 5.8 |
| 2015-01-01_01:38:44 | 5.8 |
| 2015-01-01_01:38:45 | 5.8 |
| 2015-01-01_01:38:46 | 5.7 |
| 2015-01-01_01:38:47 | 5.6 |
| 2015-01-01_01:38:48 | 5.5 |
| 2015-01-01_01:38:49 | 5.4 |
| 2015-01-01_01:38:50 | 5.3 |
| 2015-01-01_01:38:51 | 5.2 |
| 2015-01-01_01:38:52 | 5.1 |
| 2015-01-01_01:38:53 | 5 |
| 2015-01-01_01:38:54 | 4.9 |
| 2015-01-01_01:38:55 | 4.8 |
| 2015-01-01_01:38:56 | 4.7 |
| 2015-01-01_01:38:57 | 3.3 |
| 2015-01-01_01:38:58 | 2.4 |
| 2015-01-01_01:38:59 | 2.3 |
| 2015-01-01_01:39:00 | 2.3 |
| 2015-01-01_01:39:01 | 2.3 |
| 2015-01-01_01:39:02 | 2.3 |
| 2015-01-01_01:39:03 | 2.3 |
| 2015-01-01_01:39:04 | 2.2 |
| 2015-01-01_01:39:05 | 2.3 |
| 2015-01-01_01:39:06 | 2.3 |
| 2015-01-01_01:39:07 | 2.2 |
| 2015-01-01_01:39:08 | 2.2 |
| 2015-01-01_01:39:09 | 2.3 |
| 2015-01-01_01:39:10 | 2.2 |
| 2015-01-01_01:39:11 | 2.3 |
| 2015-01-01_01:39:12 | 2.2 |
| 2015-01-01_01:39:13 | 2.2 |
| 2015-01-01_01:39:14 | 2.2 |
| 2015-01-01_01:39:15 | 2.2 |
| 2015-01-01_01:39:16 | 2.2 |
| 2015-01-01_01:39:17 | 2.3 |
| 2015-01-01_01:39:18 | 2.2 |
| 2015-01-01_01:39:19 | 2.3 |
| 2015-01-01_01:39:20 | 2.4 |
| 2015-01-01_01:39:21 | 4.3 |
| 2015-01-01_01:39:22 | 5.7 |
| 2015-01-01_01:39:23 | 5.7 |
| 2015-01-01_01:39:24 | 4.4 |
| 2015-01-01_01:39:25 | 5.2 |
| 2015-01-01_01:39:26 | 6.1 |
| 2015-01-01_01:39:27 | 4.4 |
| 2015-01-01_01:39:28 | 4.4 |
| 2015-01-01_01:39:29 | 4.9 |
| 2015-01-01_01:39:30 | 5.4 |
| 2015-01-01_01:39:31 | 4.9 |
| 2015-01-01_01:39:32 | 4.1 |
| 2015-01-01_01:39:33 | 4.2 |
| 2015-01-01_01:39:34 | 4.5 |
| 2015-01-01_01:39:35 | 4.7 |
| 2015-01-01_01:39:36 | 4.7 |
| 2015-01-01_01:39:37 | 4.7 |
| 2015-01-01_01:39:38 | 4.8 |
| 2015-01-01_01:39:39 | 4.9 |
| 2015-01-01_01:39:40 | 5 |
| 2015-01-01_01:39:41 | 5.1 |
| 2015-01-01_01:39:42 | 5.2 |
| 2015-01-01_01:39:43 | 5.3 |
| 2015-01-01_01:39:44 | 5.4 |
| 2015-01-01_01:39:45 | 5.5 |
| 2015-01-01_01:39:46 | 5.4 |
| 2015-01-01_01:39:47 | 5.4 |
| 2015-01-01_01:39:48 | 5.3 |
| 2015-01-01_01:39:49 | 5.4 |
| 2015-01-01_01:39:50 | 5.5 |
| 2015-01-01_01:39:51 | 5.5 |
| 2015-01-01_01:39:52 | 5.4 |
| 2015-01-01_01:39:53 | 5.5 |
| 2015-01-01_01:39:54 | 5.6 |
| 2015-01-01_01:39:55 | 5.8 |
| 2015-01-01_01:39:56 | 5.7 |
| 2015-01-01_01:39:57 | 5.6 |
| 2015-01-01_01:39:58 | 5.7 |
| 2015-01-01_01:39:59 | 5.7 |
| 2015-01-01_01:40:00 | 5.8 |
| 2015-01-01_01:40:01 | 5.8 |
| 2015-01-01_01:40:02 | 5.6 |
| 2015-01-01_01:40:03 | 5.3 |
| 2015-01-01_01:40:04 | 4.6 |
| 2015-01-01_01:40:05 | 4.5 |
| 2015-01-01_01:40:06 | 4.6 |
| 2015-01-01_01:40:07 | 4.6 |
| 2015-01-01_01:40:08 | 4.5 |
| 2015-01-01_01:40:09 | 4.5 |
| 2015-01-01_01:40:10 | 4.3 |
| 2015-01-01_01:40:11 | 4.3 |
| 2015-01-01_01:40:12 | 4.3 |
| 2015-01-01_01:40:13 | 4.3 |
| 2015-01-01_01:40:14 | 4.4 |
| 2015-01-01_01:40:15 | 4.4 |
| 2015-01-01_01:40:16 | 4.6 |
| 2015-01-01_01:40:17 | 4.6 |
| 2015-01-01_01:40:18 | 4.6 |
| 2015-01-01_01:40:19 | 4.7 |
| 2015-01-01_01:40:20 | 4.7 |
| 2015-01-01_01:40:21 | 4.7 |
| 2015-01-01_01:40:22 | 4.7 |
| 2015-01-01_01:40:23 | 4.7 |
| 2015-01-01_01:40:24 | 4.7 |
| 2015-01-01_01:40:25 | 4.6 |
| 2015-01-01_01:40:26 | 4.4 |
| 2015-01-01_01:40:27 | 4.4 |
| 2015-01-01_01:40:28 | 4.3 |
| 2015-01-01_01:40:29 | 4.2 |
| 2015-01-01_01:40:30 | 4.2 |
| 2015-01-01_01:40:31 | 4.1 |
| 2015-01-01_01:40:32 | 3.9 |
| 2015-01-01_01:40:33 | 3.9 |
| 2015-01-01_01:40:34 | 3.7 |
| 2015-01-01_01:40:35 | 3.5 |
| 2015-01-01_01:40:36 | 2.8 |
| 2015-01-01_01:40:37 | 2.3 |
| 2015-01-01_01:40:38 | 2.3 |
| 2015-01-01_01:40:39 | 2.3 |
| 2015-01-01_01:40:40 | 2.3 |
| 2015-01-01_01:40:41 | 2.3 |
| 2015-01-01_01:40:42 | 2.3 |
| 2015-01-01_01:40:43 | 2.3 |
| 2015-01-01_01:40:44 | 2.3 |
| 2015-01-01_01:40:45 | 2.3 |
| 2015-01-01_01:40:46 | 2.2 |
| 2015-01-01_01:40:47 | 2.2 |
| 2015-01-01_01:40:48 | 2.2 |
| 2015-01-01_01:40:49 | 2.2 |
| 2015-01-01_01:40:50 | 2.2 |
| 2015-01-01_01:40:51 | 2.2 |
| 2015-01-01_01:40:52 | 2.2 |
| 2015-01-01_01:40:53 | 2.2 |
| 2015-01-01_01:40:54 | 2.2 |
| 2015-01-01_01:40:55 | 2.2 |
| 2015-01-01_01:40:56 | 2.2 |
| 2015-01-01_01:40:57 | 2.2 |
| 2015-01-01_01:40:58 | 2.2 |
| 2015-01-01_01:40:59 | 2.2 |
| 2015-01-01_01:41:00 | 2.2 |
| 2015-01-01_01:41:01 | 2.2 |
| 2015-01-01_01:41:02 | 2.2 |
| 2015-01-01_01:41:03 | 2.2 |
| 2015-01-01_01:41:04 | 2.2 |
| 2015-01-01_01:41:05 | 2.2 |
| 2015-01-01_01:41:06 | 2.2 |
| 2015-01-01_01:41:07 | 2.2 |
| 2015-01-01_01:41:08 | 2.2 |
| 2015-01-01_01:41:09 | 2.2 |
| 2015-01-01_01:41:10 | 2.2 |
| 2015-01-01_01:41:11 | 2.2 |
| 2015-01-01_01:41:12 | 2.2 |
| 2015-01-01_01:41:13 | 2.2 |
| 2015-01-01_01:41:14 | 2.2 |
| 2015-01-01_01:41:15 | 2.2 |
| 2015-01-01_01:41:16 | 2.2 |
| 2015-01-01_01:41:17 | 2.2 |
| 2015-01-01_01:41:18 | 2.2 |
| 2015-01-01_01:41:19 | 2.2 |
| 2015-01-01_01:41:20 | 2.2 |
| 2015-01-01_01:41:21 | 2.2 |
| 2015-01-01_01:41:22 | 2.2 |
| 2015-01-01_01:41:23 | 2.2 |
| 2015-01-01_01:41:24 | 2.2 |
| 2015-01-01_01:41:25 | 2.2 |
| 2015-01-01_01:41:26 | 2.2 |
| 2015-01-01_01:41:27 | 2.2 |
| 2015-01-01_01:41:28 | 2.2 |
| 2015-01-01_01:41:29 | 2.2 |
| 2015-01-01_01:41:30 | 2.2 |
| 2015-01-01_01:41:31 | 2.2 |
| 2015-01-01_01:41:32 | 2.2 |
| 2015-01-01_01:41:33 | 2.2 |
| 2015-01-01_01:41:34 | 2.2 |
| 2015-01-01_01:41:35 | 2.2 |
| 2015-01-01_01:41:36 | 2.2 |
| 2015-01-01_01:41:37 | 2.2 |
| 2015-01-01_01:41:38 | 2.2 |
| 2015-01-01_01:41:39 | 2 |
| 2015-01-01_01:41:40 | 2.6 |
| 2015-01-01_01:41:41 | 5.3 |
| 2015-01-01_01:41:42 | 5.6 |
| 2015-01-01_01:41:43 | 4.9 |
| 2015-01-01_01:41:44 | 5.5 |
| 2015-01-01_01:41:45 | 6.2 |
| 2015-01-01_01:41:46 | 6.4 |
| 2015-01-01_01:41:47 | 6.4 |
| 2015-01-01_01:41:48 | 6.4 |
| 2015-01-01_01:41:49 | 5.7 |
| 2015-01-01_01:41:50 | 6.1 |
| 2015-01-01_01:41:51 | 6.1 |
| 2015-01-01_01:41:52 | 5.3 |
| 2015-01-01_01:41:53 | 5.4 |
| 2015-01-01_01:41:54 | 5.7 |
| 2015-01-01_01:41:55 | 5.8 |
| 2015-01-01_01:41:56 | 5.9 |
| 2015-01-01_01:41:57 | 4.6 |
| 2015-01-01_01:41:58 | 4.7 |
| 2015-01-01_01:41:59 | 4.8 |
| 2015-01-01_01:42:00 | 4.8 |
| 2015-01-01_01:42:01 | 4.8 |
| 2015-01-01_01:42:02 | 4.8 |
| 2015-01-01_01:42:03 | 4.8 |
| 2015-01-01_01:42:04 | 4.7 |
| 2015-01-01_01:42:05 | 4.7 |
| 2015-01-01_01:42:06 | 4.7 |
| 2015-01-01_01:42:07 | 4.7 |
| 2015-01-01_01:42:08 | 4.6 |
| 2015-01-01_01:42:09 | 4.6 |
| 2015-01-01_01:42:10 | 4.6 |
| 2015-01-01_01:42:11 | 4.6 |
| 2015-01-01_01:42:12 | 4.6 |
| 2015-01-01_01:42:13 | 4.6 |
| 2015-01-01_01:42:14 | 4.6 |
| 2015-01-01_01:42:15 | 4.6 |
| 2015-01-01_01:42:16 | 4.6 |
| 2015-01-01_01:42:17 | 4.6 |
| 2015-01-01_01:42:18 | 4.7 |
| 2015-01-01_01:42:19 | 4.9 |
| 2015-01-01_01:42:20 | 5.2 |
| 2015-01-01_01:42:21 | 5.4 |
| 2015-01-01_01:42:22 | 5.5 |
| 2015-01-01_01:42:23 | 5.5 |
| 2015-01-01_01:42:24 | 5.5 |
| 2015-01-01_01:42:25 | 5.4 |
| 2015-01-01_01:42:26 | 5.4 |
| 2015-01-01_01:42:27 | 5.4 |
| 2015-01-01_01:42:28 | 5.3 |
| 2015-01-01_01:42:29 | 5.3 |
| 2015-01-01_01:42:30 | 5.3 |
| 2015-01-01_01:42:31 | 5.3 |
| 2015-01-01_01:42:32 | 5.3 |
| 2015-01-01_01:42:33 | 5.2 |
| 2015-01-01_01:42:34 | 5.2 |
| 2015-01-01_01:42:35 | 5.1 |
| 2015-01-01_01:42:36 | 5.1 |
| 2015-01-01_01:42:37 | 5 |
| 2015-01-01_01:42:38 | 4.9 |
| 2015-01-01_01:42:39 | 4.9 |
| 2015-01-01_01:42:40 | 4.8 |
| 2015-01-01_01:42:41 | 4.8 |
| 2015-01-01_01:42:42 | 4.7 |
| 2015-01-01_01:42:43 | 4.7 |
| 2015-01-01_01:42:44 | 4.6 |
| 2015-01-01_01:42:45 | 4.5 |
| 2015-01-01_01:42:46 | 4.4 |
| 2015-01-01_01:42:47 | 4.3 |
| 2015-01-01_01:42:48 | 4.2 |
| 2015-01-01_01:42:49 | 2.5 |
| 2015-01-01_01:42:50 | 2.4 |
| 2015-01-01_01:42:51 | 2.4 |
| 2015-01-01_01:42:52 | 2.4 |
| 2015-01-01_01:42:53 | 3.7 |
| 2015-01-01_01:42:54 | 4.4 |
| 2015-01-01_01:42:55 | 4.6 |
| 2015-01-01_01:42:56 | 4.9 |
| 2015-01-01_01:42:57 | 5.7 |
| 2015-01-01_01:42:58 | 6.3 |
| 2015-01-01_01:42:59 | 6.4 |
| 2015-01-01_01:43:00 | 6.4 |
| 2015-01-01_01:43:01 | 6.3 |
| 2015-01-01_01:43:02 | 6.2 |
| 2015-01-01_01:43:03 | 6.2 |
| 2015-01-01_01:43:04 | 6.3 |
| 2015-01-01_01:43:05 | 6.2 |
| 2015-01-01_01:43:06 | 6.2 |
| 2015-01-01_01:43:07 | 6.1 |
| 2015-01-01_01:43:08 | 6.1 |
| 2015-01-01_01:43:09 | 6.1 |
| 2015-01-01_01:43:10 | 6.1 |
| 2015-01-01_01:43:11 | 6 |
| 2015-01-01_01:43:12 | 5.9 |
| 2015-01-01_01:43:13 | 5.8 |
| 2015-01-01_01:43:14 | 4.7 |
| 2015-01-01_01:43:15 | 3 |
| 2015-01-01_01:43:16 | 2.3 |
| 2015-01-01_01:43:17 | 2.2 |
| 2015-01-01_01:43:18 | 2.2 |
| 2015-01-01_01:43:19 | 2.2 |
| 2015-01-01_01:43:20 | 2.2 |
| 2015-01-01_01:43:21 | 2.2 |
| 2015-01-01_01:43:22 | 2.1 |
| 2015-01-01_01:43:23 | 2.2 |
| 2015-01-01_01:43:24 | 2.2 |
| 2015-01-01_01:43:25 | 2.2 |
| 2015-01-01_01:43:26 | 2.2 |
| 2015-01-01_01:43:27 | 2.2 |
| 2015-01-01_01:43:28 | 2.2 |
| 2015-01-01_01:43:29 | 2.2 |
| 2015-01-01_01:43:30 | 2.2 |
| 2015-01-01_01:43:31 | 2.2 |
| 2015-01-01_01:43:32 | 2.2 |
| 2015-01-01_01:43:33 | 2.2 |
| 2015-01-01_01:43:34 | 2.2 |
| 2015-01-01_01:43:35 | 2.2 |
| 2015-01-01_01:43:36 | 2.2 |
| 2015-01-01_01:43:37 | 2.2 |
| 2015-01-01_01:43:38 | 2.2 |
| 2015-01-01_01:43:39 | 2.2 |
| 2015-01-01_01:43:40 | 2.2 |
| 2015-01-01_01:43:41 | 2.2 |
| 2015-01-01_01:43:42 | 2.2 |
| 2015-01-01_01:43:43 | 2.2 |
| 2015-01-01_01:43:44 | 2.2 |
| 2015-01-01_01:43:45 | 2.2 |
| 2015-01-01_01:43:46 | 2.2 |
| 2015-01-01_01:43:47 | 2.2 |
| 2015-01-01_01:43:48 | 2.2 |
| 2015-01-01_01:43:49 | 2.2 |
| 2015-01-01_01:43:50 | 2.2 |
| 2015-01-01_01:43:51 | 2.2 |
| 2015-01-01_01:43:52 | 2.2 |
| 2015-01-01_01:43:53 | 2.2 |
| 2015-01-01_01:43:54 | 2.2 |
| 2015-01-01_01:43:55 | 2.2 |
| 2015-01-01_01:43:56 | 2.2 |
| 2015-01-01_01:43:57 | 2 |
| 2015-01-01_01:43:58 | 2.5 |
| 2015-01-01_01:43:59 | 3.3 |
| 2015-01-01_01:44:00 | 6 |
| 2015-01-01_01:44:01 | 4.9 |
| 2015-01-01_01:44:02 | 5.2 |
| 2015-01-01_01:44:03 | 5.9 |
| 2015-01-01_01:44:04 | 5.9 |
| 2015-01-01_01:44:05 | 4.9 |
| 2015-01-01_01:44:06 | 5.5 |
| 2015-01-01_01:44:07 | 5.9 |
| 2015-01-01_01:44:08 | 4.8 |
| 2015-01-01_01:44:09 | 4.9 |
| 2015-01-01_01:44:10 | 5.3 |
| 2015-01-01_01:44:11 | 5.1 |
| 2015-01-01_01:44:12 | 4.7 |
| 2015-01-01_01:44:13 | 4.7 |
| 2015-01-01_01:44:14 | 4.8 |
| 2015-01-01_01:44:15 | 4.9 |
| 2015-01-01_01:44:16 | 4.9 |
| 2015-01-01_01:44:17 | 4.8 |
| 2015-01-01_01:44:18 | 4.8 |
| 2015-01-01_01:44:19 | 4.7 |
| 2015-01-01_01:44:20 | 4.1 |
| 2015-01-01_01:44:21 | 3.6 |
| 2015-01-01_01:44:22 | 3.5 |
| 2015-01-01_01:44:23 | 3.4 |
| 2015-01-01_01:44:24 | 3 |
| 2015-01-01_01:44:25 | 4.6 |
| 2015-01-01_01:44:26 | 4.7 |
| 2015-01-01_01:44:27 | 4.9 |
| 2015-01-01_01:44:28 | 5.2 |
| 2015-01-01_01:44:29 | 5.4 |
| 2015-01-01_01:44:30 | 5.6 |
| 2015-01-01_01:44:31 | 5.8 |
| 2015-01-01_01:44:32 | 3.5 |
| 2015-01-01_01:44:33 | 2.7 |
| 2015-01-01_01:44:34 | 2.6 |
| 2015-01-01_01:44:35 | 2.6 |
| 2015-01-01_01:44:36 | 2.6 |
| 2015-01-01_01:44:37 | 2.4 |
| 2015-01-01_01:44:38 | 2.4 |
| 2015-01-01_01:44:39 | 2.3 |
| 2015-01-01_01:44:40 | 2.2 |
| 2015-01-01_01:44:41 | 2.2 |
| 2015-01-01_01:44:42 | 2.2 |
| 2015-01-01_01:44:43 | 2.1 |
| 2015-01-01_01:44:44 | 2.6 |
| 2015-01-01_01:44:45 | 3.7 |
| 2015-01-01_01:44:46 | 5.2 |
| 2015-01-01_01:44:47 | 6.2 |
| 2015-01-01_01:44:48 | 5.1 |
| 2015-01-01_01:44:49 | 5 |
| 2015-01-01_01:44:50 | 5.7 |
| 2015-01-01_01:44:51 | 6.2 |
| 2015-01-01_01:44:52 | 4.9 |
| 2015-01-01_01:44:53 | 5 |
| 2015-01-01_01:44:54 | 5.1 |
| 2015-01-01_01:44:55 | 5.1 |
| 2015-01-01_01:44:56 | 5 |
| 2015-01-01_01:44:57 | 5 |
| 2015-01-01_01:44:58 | 4.9 |
| 2015-01-01_01:44:59 | 4.9 |
| 2015-01-01_01:45:00 | 4.8 |
| 2015-01-01_01:45:01 | 4.7 |
| 2015-01-01_01:45:02 | 4.7 |
| 2015-01-01_01:45:03 | 4.6 |
| 2015-01-01_01:45:04 | 4.7 |
| 2015-01-01_01:45:05 | 4.7 |
| 2015-01-01_01:45:06 | 4.7 |
| 2015-01-01_01:45:07 | 4.8 |
| 2015-01-01_01:45:08 | 4.9 |
| 2015-01-01_01:45:09 | 5 |
| 2015-01-01_01:45:10 | 4.9 |
| 2015-01-01_01:45:11 | 4.8 |
| 2015-01-01_01:45:12 | 4.8 |
| 2015-01-01_01:45:13 | 4.7 |
| 2015-01-01_01:45:14 | 4.5 |
| 2015-01-01_01:45:15 | 4.5 |
| 2015-01-01_01:45:16 | 4.5 |
| 2015-01-01_01:45:17 | 4.4 |
| 2015-01-01_01:45:18 | 3.7 |
| 2015-01-01_01:45:19 | 2.3 |
| 2015-01-01_01:45:20 | 2.3 |
| 2015-01-01_01:45:21 | 2.3 |
| 2015-01-01_01:45:22 | 2.3 |
| 2015-01-01_01:45:23 | 2.3 |
| 2015-01-01_01:45:24 | 2.3 |
| 2015-01-01_01:45:25 | 2.2 |
| 2015-01-01_01:45:26 | 2.2 |
| 2015-01-01_01:45:27 | 2.2 |
| 2015-01-01_01:45:28 | 2.3 |
| 2015-01-01_01:45:29 | 2.8 |
| 2015-01-01_01:45:30 | 3.5 |
| 2015-01-01_01:45:31 | 3.4 |
| 2015-01-01_01:45:32 | 3.3 |
| 2015-01-01_01:45:33 | 3.5 |
| 2015-01-01_01:45:34 | 4.2 |
| 2015-01-01_01:45:35 | 4.7 |
| 2015-01-01_01:45:36 | 3.1 |
| 2015-01-01_01:45:37 | 2.3 |
| 2015-01-01_01:45:38 | 2.1 |
| 2015-01-01_01:45:39 | 2.1 |
| 2015-01-01_01:45:40 | 2.2 |
| 2015-01-01_01:45:41 | 2.2 |
| 2015-01-01_01:45:42 | 2.1 |
| 2015-01-01_01:45:43 | 2.1 |
| 2015-01-01_01:45:44 | 2.2 |
| 2015-01-01_01:45:45 | 2.2 |
| 2015-01-01_01:45:46 | 2 |
| 2015-01-01_01:45:47 | 2 |
| 2015-01-01_01:45:48 | 2.2 |
| 2015-01-01_01:45:49 | 2.1 |
| 2015-01-01_01:45:50 | 2.1 |
| 2015-01-01_01:45:51 | 2.1 |
| 2015-01-01_01:45:52 | 2.1 |
| 2015-01-01_01:45:53 | 2.1 |
| 2015-01-01_01:45:54 | 2.1 |
| 2015-01-01_01:45:55 | 2.1 |
| 2015-01-01_01:45:56 | 2.1 |
| 2015-01-01_01:45:57 | 2.1 |
| 2015-01-01_01:45:58 | 2.1 |
| 2015-01-01_01:45:59 | 2.1 |
| 2015-01-01_01:46:00 | 2.1 |
| 2015-01-01_01:46:01 | 2.2 |
| 2015-01-01_01:46:02 | 2.1 |
| 2015-01-01_01:46:03 | 2.1 |
| 2015-01-01_01:46:04 | 2.1 |
| 2015-01-01_01:46:05 | 2.1 |
| 2015-01-01_01:46:06 | 2.1 |
| 2015-01-01_01:46:07 | 2.1 |
| 2015-01-01_01:46:08 | 2.1 |
| 2015-01-01_01:46:09 | 2.1 |
| 2015-01-01_01:46:10 | 2.1 |
| 2015-01-01_01:46:11 | 2.1 |
| 2015-01-01_01:46:12 | 2.1 |
| 2015-01-01_01:46:13 | 2.1 |
| 2015-01-01_01:46:14 | 2.1 |
| 2015-01-01_01:46:15 | 2.1 |
| 2015-01-01_01:46:16 | 2.1 |